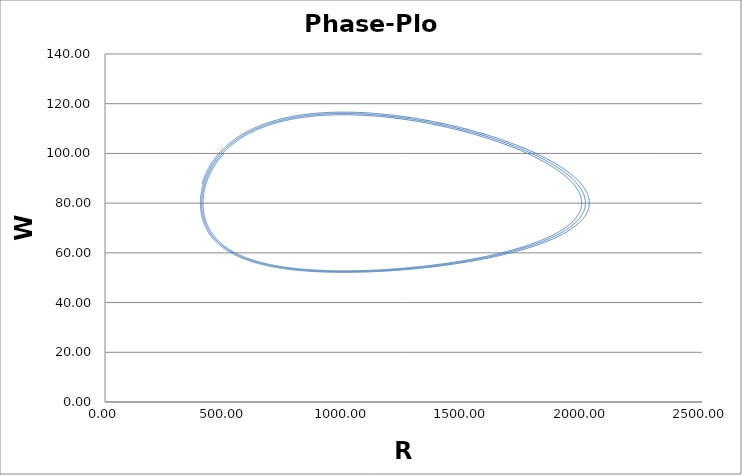
| Category | W |
|---|---|
| 500.0 | 100 |
| 498.9999999992 | 99.9 |
| 498.0069899984048 | 99.8 |
| 497.02094112752405 | 99.7 |
| 496.0418246593139 | 99.599 |
| 495.0696120096582 | 99.499 |
| 494.1042747378336 | 99.399 |
| 493.14578454675745 | 99.298 |
| 492.19411328322036 | 99.197 |
| 491.24923293810184 | 99.097 |
| 490.3111156465713 | 98.996 |
| 489.3797336882732 | 98.895 |
| 488.4550594874972 | 98.794 |
| 487.5370656133338 | 98.693 |
| 486.62572477981547 | 98.592 |
| 485.7210098460431 | 98.49 |
| 484.82289381629937 | 98.389 |
| 483.9313498401477 | 98.288 |
| 483.0463512125183 | 98.186 |
| 482.16787137378094 | 98.085 |
| 481.2958839098047 | 97.983 |
| 480.43036255200514 | 97.881 |
| 479.5712811773795 | 97.78 |
| 478.71861380852914 | 97.678 |
| 477.8723346136706 | 97.576 |
| 477.0324179066348 | 97.474 |
| 476.19883814685477 | 97.372 |
| 475.3715699393425 | 97.27 |
| 474.5505880346546 | 97.168 |
| 473.7358673288472 | 97.066 |
| 472.9273828634206 | 96.964 |
| 472.1251098252536 | 96.862 |
| 471.32902354652776 | 96.76 |
| 470.5390995046415 | 96.657 |
| 469.7553133221153 | 96.555 |
| 468.9776407664867 | 96.452 |
| 468.2060577501967 | 96.35 |
| 467.4405403304669 | 96.248 |
| 466.6810647091678 | 96.145 |
| 465.9276072326787 | 96.042 |
| 465.180144391739 | 95.94 |
| 464.43865282129127 | 95.837 |
| 463.70310930031644 | 95.735 |
| 462.97349075166125 | 95.632 |
| 462.2497742418577 | 95.529 |
| 461.5319369809353 | 95.426 |
| 460.81995632222583 | 95.324 |
| 460.1138097621613 | 95.221 |
| 459.4134749400645 | 95.118 |
| 458.71892963793323 | 95.015 |
| 458.0301517802177 | 94.912 |
| 457.3471194335914 | 94.81 |
| 456.6698108067159 | 94.707 |
| 455.9982042499992 | 94.604 |
| 455.33227825534885 | 94.501 |
| 454.67201145591815 | 94.398 |
| 454.0173826258477 | 94.295 |
| 453.36837068000085 | 94.192 |
| 452.7249546736942 | 94.089 |
| 452.08711380242244 | 93.986 |
| 451.45482740157854 | 93.883 |
| 450.8280749461688 | 93.78 |
| 450.206836050523 | 93.677 |
| 449.59109046800046 | 93.574 |
| 448.9808180906907 | 93.471 |
| 448.37599894911057 | 93.368 |
| 447.7766132118965 | 93.265 |
| 447.18264118549314 | 93.162 |
| 446.5940633138375 | 93.059 |
| 446.01086017803976 | 92.956 |
| 445.4330124960597 | 92.853 |
| 444.86050112238 | 92.75 |
| 444.293307047676 | 92.647 |
| 443.7314113984817 | 92.544 |
| 443.17479543685283 | 92.441 |
| 442.62344056002655 | 92.338 |
| 442.07732830007825 | 92.235 |
| 441.5364403235752 | 92.132 |
| 441.00075843122767 | 92.029 |
| 440.4702645575367 | 91.926 |
| 439.9449407704401 | 91.824 |
| 439.4247692709551 | 91.721 |
| 438.90973239281914 | 91.618 |
| 438.3998126021279 | 91.515 |
| 437.8949924969714 | 91.412 |
| 437.3952548070677 | 91.31 |
| 436.9005823933949 | 91.207 |
| 436.4109582478207 | 91.104 |
| 435.9263654927303 | 91.001 |
| 435.44678738065284 | 90.899 |
| 434.9722072938854 | 90.796 |
| 434.5026087441161 | 90.693 |
| 434.03797537204537 | 90.591 |
| 433.5782909470055 | 90.488 |
| 433.12353936657934 | 90.386 |
| 432.67370465621735 | 90.283 |
| 432.22877096885355 | 90.181 |
| 431.78872258452014 | 90.079 |
| 431.35354390996145 | 89.976 |
| 430.92321947824644 | 89.874 |
| 430.4977339483805 | 89.772 |
| 430.0770721049166 | 89.669 |
| 429.6612188575651 | 89.567 |
| 429.25015924080327 | 89.465 |
| 428.8438784134842 | 89.363 |
| 428.4423616584448 | 89.261 |
| 428.0455943821134 | 89.159 |
| 427.65356211411716 | 89.057 |
| 427.2662505068885 | 88.955 |
| 426.8836453352719 | 88.853 |
| 426.5057324961297 | 88.751 |
| 426.1324980079483 | 88.649 |
| 425.7639280104435 | 88.547 |
| 425.40000876416667 | 88.446 |
| 425.04072665010983 | 88.344 |
| 424.6860681693114 | 88.243 |
| 424.33601994246175 | 88.141 |
| 423.99056870950886 | 88.04 |
| 423.6497013292643 | 87.938 |
| 423.3134047790089 | 87.837 |
| 422.9816661540993 | 87.735 |
| 422.6544726675743 | 87.634 |
| 422.33181164976173 | 87.533 |
| 422.0136705478859 | 87.432 |
| 421.70003692567485 | 87.331 |
| 421.3908984629687 | 87.23 |
| 421.08624295532826 | 87.129 |
| 420.786058313644 | 87.028 |
| 420.49033256374594 | 86.927 |
| 420.19905384601384 | 86.826 |
| 419.91221041498835 | 86.726 |
| 419.62979063898257 | 86.625 |
| 419.3517829996944 | 86.525 |
| 419.07817609181996 | 86.424 |
| 418.80895862266726 | 86.324 |
| 418.54411941177125 | 86.223 |
| 418.2836473905094 | 86.123 |
| 418.0275316017181 | 86.023 |
| 417.7757611993106 | 85.923 |
| 417.5283254478949 | 85.823 |
| 417.2852137223936 | 85.723 |
| 417.0464155076643 | 85.623 |
| 416.8119203981207 | 85.523 |
| 416.58171809735586 | 85.423 |
| 416.3557984177653 | 85.324 |
| 416.134151280172 | 85.224 |
| 415.91676671345226 | 85.124 |
| 415.70363485416306 | 85.025 |
| 415.49474594617004 | 84.926 |
| 415.29009034027723 | 84.826 |
| 415.08965849385777 | 84.727 |
| 414.89344097048604 | 84.628 |
| 414.7014284395708 | 84.529 |
| 414.51361167599 | 84.43 |
| 414.3299815597266 | 84.331 |
| 414.15052907550603 | 84.232 |
| 413.97524531243477 | 84.134 |
| 413.80412146364034 | 84.035 |
| 413.6371488259129 | 83.937 |
| 413.47431879934805 | 83.838 |
| 413.3156228869911 | 83.74 |
| 413.1610526944828 | 83.642 |
| 413.0105999297068 | 83.543 |
| 412.86425640243806 | 83.445 |
| 412.72201402399315 | 83.347 |
| 412.58386480688205 | 83.249 |
| 412.4498008644612 | 83.152 |
| 412.3198144105885 | 83.054 |
| 412.1938977592793 | 82.956 |
| 412.0720433243647 | 82.859 |
| 411.9542436191505 | 82.761 |
| 411.8404912560785 | 82.664 |
| 411.73077894638925 | 82.567 |
| 411.6250994997859 | 82.47 |
| 411.5234458241003 | 82.373 |
| 411.42581092496033 | 82.276 |
| 411.33218790545897 | 82.179 |
| 411.24256996582506 | 82.082 |
| 411.1569504030956 | 81.985 |
| 411.0753226107899 | 81.889 |
| 410.997680078585 | 81.792 |
| 410.92401639199323 | 81.696 |
| 410.8543252320411 | 81.6 |
| 410.78860037495 | 81.504 |
| 410.7268356918186 | 81.408 |
| 410.66902514830696 | 81.312 |
| 410.61516280432204 | 81.216 |
| 410.5652428137055 | 81.12 |
| 410.5192594239225 | 81.024 |
| 410.47720697575284 | 80.929 |
| 410.4390799029834 | 80.833 |
| 410.4048727321023 | 80.738 |
| 410.37458008199525 | 80.643 |
| 410.3481966636428 | 80.548 |
| 410.3257172798201 | 80.453 |
| 410.30713682479785 | 80.358 |
| 410.29245028404546 | 80.263 |
| 410.28165273393523 | 80.169 |
| 410.274739341449 | 80.074 |
| 410.271705363886 | 79.98 |
| 410.2725461485727 | 79.885 |
| 410.2772571325744 | 79.791 |
| 410.2858338424082 | 79.697 |
| 410.2982718937581 | 79.603 |
| 410.3145669911918 | 79.509 |
| 410.3347149278787 | 79.415 |
| 410.35871158531035 | 79.322 |
| 410.38655293302213 | 79.228 |
| 410.41823502831676 | 79.135 |
| 410.45375401598966 | 79.041 |
| 410.49310612805584 | 78.948 |
| 410.5362876834786 | 78.855 |
| 410.58329508789984 | 78.762 |
| 410.63412483337225 | 78.669 |
| 410.6887734980931 | 78.576 |
| 410.74723774613955 | 78.484 |
| 410.809514327206 | 78.391 |
| 410.8756000763429 | 78.299 |
| 410.9454919136972 | 78.207 |
| 411.01918684425476 | 78.115 |
| 411.09668195758405 | 78.023 |
| 411.17797442758183 | 77.931 |
| 411.26306151222036 | 77.839 |
| 411.35194055329623 | 77.747 |
| 411.44460897618103 | 77.656 |
| 411.5410642895734 | 77.564 |
| 411.64130408525295 | 77.473 |
| 411.7453260378357 | 77.382 |
| 411.8531279045312 | 77.291 |
| 411.96470752490126 | 77.2 |
| 412.0800628206202 | 77.109 |
| 412.19919179523686 | 77.018 |
| 412.3220925339382 | 76.928 |
| 412.44876320331434 | 76.837 |
| 412.5792020511254 | 76.747 |
| 412.7134074060696 | 76.657 |
| 412.8513776775535 | 76.567 |
| 412.9931113554631 | 76.477 |
| 413.13860700993706 | 76.387 |
| 413.28786329114115 | 76.298 |
| 413.4408789290444 | 76.208 |
| 413.5976527331967 | 76.119 |
| 413.7581835925079 | 76.029 |
| 413.9224704750286 | 75.94 |
| 414.09051242773216 | 75.851 |
| 414.26230857629844 | 75.762 |
| 414.437858124899 | 75.674 |
| 414.61716035598363 | 75.585 |
| 414.8002146300685 | 75.496 |
| 414.98702038552574 | 75.408 |
| 415.1775771383742 | 75.32 |
| 415.3718844820723 | 75.232 |
| 415.5699420873115 | 75.144 |
| 415.77174970181187 | 75.056 |
| 415.9773071501186 | 74.968 |
| 416.18661433340003 | 74.881 |
| 416.3996712292474 | 74.793 |
| 416.6164778914754 | 74.706 |
| 416.8370344499246 | 74.619 |
| 417.0613411102648 | 74.532 |
| 417.2893981538 | 74.445 |
| 417.5212059372748 | 74.358 |
| 417.7567648926817 | 74.272 |
| 417.99607552707016 | 74.185 |
| 418.2391384223566 | 74.099 |
| 418.48595423513586 | 74.012 |
| 418.7365236964941 | 73.926 |
| 418.99084761182246 | 73.84 |
| 419.2489268606325 | 73.755 |
| 419.5107623963725 | 73.669 |
| 419.7763552462454 | 73.583 |
| 420.04570651102716 | 73.498 |
| 420.3188173648875 | 73.413 |
| 420.5956890552105 | 73.328 |
| 420.87632290241777 | 73.243 |
| 421.1607202997912 | 73.158 |
| 421.4488827132984 | 73.073 |
| 421.7408116814182 | 72.989 |
| 422.0365088149678 | 72.904 |
| 422.33597579693077 | 72.82 |
| 422.6392143822862 | 72.736 |
| 422.9462263978391 | 72.652 |
| 423.25701374205164 | 72.568 |
| 423.5715783848756 | 72.484 |
| 423.88992236758554 | 72.401 |
| 424.21204780261365 | 72.317 |
| 424.5379568733848 | 72.234 |
| 424.8676518341532 | 72.151 |
| 425.20113500983973 | 72.068 |
| 425.53840879587034 | 71.985 |
| 425.8794756580154 | 71.902 |
| 426.2243381322299 | 71.82 |
| 426.5729988244946 | 71.737 |
| 426.9254604106584 | 71.655 |
| 427.2817256362809 | 71.573 |
| 427.64179731647647 | 71.491 |
| 428.00567833575906 | 71.409 |
| 428.3733716478875 | 71.327 |
| 428.74488027571203 | 71.246 |
| 429.12020731102155 | 71.165 |
| 429.4993559143914 | 71.083 |
| 429.88232931503234 | 71.002 |
| 430.26913081064 | 70.921 |
| 430.65976376724507 | 70.84 |
| 431.0542316190645 | 70.76 |
| 431.4525378683531 | 70.679 |
| 431.85468608525593 | 70.599 |
| 432.2606799076615 | 70.519 |
| 432.6705230410555 | 70.439 |
| 433.08421925837524 | 70.359 |
| 433.5017723998647 | 70.279 |
| 433.9231863729302 | 70.199 |
| 434.34846515199666 | 70.12 |
| 434.7776127783644 | 70.04 |
| 435.21063336006665 | 69.961 |
| 435.6475310717274 | 69.882 |
| 436.08831015442007 | 69.803 |
| 436.53297491552615 | 69.725 |
| 436.9815297285951 | 69.646 |
| 437.43397903320397 | 69.568 |
| 437.8903273348181 | 69.489 |
| 438.35057920465175 | 69.411 |
| 438.8147392795294 | 69.333 |
| 439.28281226174767 | 69.255 |
| 439.754802918937 | 69.178 |
| 440.23071608392434 | 69.1 |
| 440.71055665459585 | 69.023 |
| 441.19432959375996 | 68.946 |
| 441.6820399290108 | 68.869 |
| 442.1736927525918 | 68.792 |
| 442.6692932212599 | 68.715 |
| 443.1688465561495 | 68.638 |
| 443.6723580426369 | 68.562 |
| 444.17983303020515 | 68.486 |
| 444.6912769323087 | 68.41 |
| 445.2066952262385 | 68.334 |
| 445.726093452987 | 68.258 |
| 446.2494772171138 | 68.182 |
| 446.7768521866106 | 68.107 |
| 447.30822409276703 | 68.031 |
| 447.843598730036 | 67.956 |
| 448.38298195589937 | 67.881 |
| 448.9263796907337 | 67.806 |
| 449.4737979176757 | 67.731 |
| 450.02524268248794 | 67.657 |
| 450.58072009342436 | 67.582 |
| 451.1402363210959 | 67.508 |
| 451.70379759833605 | 67.434 |
| 452.2714102200659 | 67.36 |
| 452.84308054315954 | 67.286 |
| 453.4188149863092 | 67.213 |
| 453.99862002989005 | 67.139 |
| 454.58250221582495 | 67.066 |
| 455.17046814744907 | 66.993 |
| 455.762524489374 | 66.92 |
| 456.358677967352 | 66.847 |
| 456.9589353681394 | 66.774 |
| 457.56330353936045 | 66.702 |
| 458.1717893893701 | 66.629 |
| 458.78439988711693 | 66.557 |
| 459.4011420620056 | 66.485 |
| 460.0220230037587 | 66.413 |
| 460.6470498622785 | 66.341 |
| 461.27622984750786 | 66.27 |
| 461.9095702292912 | 66.198 |
| 462.5470783372343 | 66.127 |
| 463.1887615605644 | 66.056 |
| 463.8346273479889 | 65.985 |
| 464.4846832075542 | 65.914 |
| 465.13893670650367 | 65.844 |
| 465.79739547113473 | 65.773 |
| 466.4600671866558 | 65.703 |
| 467.12695959704234 | 65.633 |
| 467.7980805048921 | 65.563 |
| 468.4734377712797 | 65.493 |
| 469.1530393156107 | 65.424 |
| 469.83689311547477 | 65.354 |
| 470.52500720649755 | 65.285 |
| 471.2173896821928 | 65.216 |
| 471.9140486938125 | 65.147 |
| 472.614992450197 | 65.078 |
| 473.3202292176237 | 65.009 |
| 474.02976731965515 | 64.941 |
| 474.7436151369858 | 64.873 |
| 475.4617811072882 | 64.804 |
| 476.18427372505795 | 64.736 |
| 476.9111015414577 | 64.669 |
| 477.6422731641599 | 64.601 |
| 478.37779725718866 | 64.533 |
| 479.1176825407604 | 64.466 |
| 479.86193779112347 | 64.399 |
| 480.6105718403962 | 64.332 |
| 481.36359357640424 | 64.265 |
| 482.1210119425165 | 64.198 |
| 482.8828359374794 | 64.132 |
| 483.6490746152506 | 64.066 |
| 484.4197370848306 | 64 |
| 485.1948325100936 | 63.934 |
| 485.97437010961653 | 63.868 |
| 486.758359156507 | 63.802 |
| 487.5468089782296 | 63.737 |
| 488.33972895643063 | 63.671 |
| 489.13712852676167 | 63.606 |
| 489.9390171787012 | 63.541 |
| 490.7454044553748 | 63.476 |
| 491.55629995337404 | 63.412 |
| 492.3717133225731 | 63.347 |
| 493.19165426594424 | 63.283 |
| 494.0161325393714 | 63.219 |
| 494.84515795146217 | 63.155 |
| 495.6787403633574 | 63.091 |
| 496.5168896885401 | 63.027 |
| 497.35961589264144 | 62.964 |
| 498.20692899324547 | 62.9 |
| 499.05883905969176 | 62.837 |
| 499.91535621287613 | 62.774 |
| 500.7764906250494 | 62.712 |
| 501.6422525196141 | 62.649 |
| 502.5126521709191 | 62.587 |
| 503.38769990405245 | 62.524 |
| 504.26740609463155 | 62.462 |
| 505.15178116859175 | 62.4 |
| 506.0408356019724 | 62.338 |
| 506.93457992070074 | 62.277 |
| 507.8330247003738 | 62.215 |
| 508.73618056603755 | 62.154 |
| 509.644058191964 | 62.093 |
| 510.556668301426 | 62.032 |
| 511.47402166646935 | 61.972 |
| 512.3961291076828 | 61.911 |
| 513.3230014939652 | 61.851 |
| 514.2546497422907 | 61.79 |
| 515.1910848174705 | 61.73 |
| 516.1323177319128 | 61.671 |
| 517.0783595453802 | 61.611 |
| 518.0292213647431 | 61.551 |
| 518.9849143437325 | 61.492 |
| 519.9454496826879 | 61.433 |
| 520.9108386283042 | 61.374 |
| 521.8810924733743 | 61.315 |
| 522.85622255653 | 61.256 |
| 523.836240261979 | 61.198 |
| 524.8211570192399 | 61.14 |
| 525.8109843028732 | 61.082 |
| 526.8057336322101 | 61.024 |
| 527.8054165710781 | 60.966 |
| 528.8100447275226 | 60.908 |
| 529.8196297535264 | 60.851 |
| 530.8341833447258 | 60.794 |
| 531.8537172401227 | 60.737 |
| 532.8782432217943 | 60.68 |
| 533.9077731145987 | 60.623 |
| 534.9423187858782 | 60.567 |
| 535.9818921451578 | 60.51 |
| 537.026505143841 | 60.454 |
| 538.076169774902 | 60.398 |
| 539.1308980725748 | 60.342 |
| 540.1907021120375 | 60.287 |
| 541.2555940090936 | 60.231 |
| 542.3255859198504 | 60.176 |
| 543.4006900403921 | 60.121 |
| 544.4809186064502 | 60.066 |
| 545.5662838930698 | 60.011 |
| 546.6567982142717 | 59.957 |
| 547.752473922711 | 59.902 |
| 548.8533234093314 | 59.848 |
| 549.9593591030157 | 59.794 |
| 551.0705934702318 | 59.74 |
| 552.1870390146752 | 59.687 |
| 553.3087082769067 | 59.633 |
| 554.4356138339863 | 59.58 |
| 555.5677682991025 | 59.527 |
| 556.7051843211974 | 59.474 |
| 557.8478745845878 | 59.421 |
| 558.9958518085808 | 59.369 |
| 560.1491287470861 | 59.316 |
| 561.3077181882232 | 59.264 |
| 562.4716329539239 | 59.212 |
| 563.6408858995301 | 59.16 |
| 564.8154899133878 | 59.109 |
| 565.9954579164349 | 59.057 |
| 567.1808028617857 | 59.006 |
| 568.3715377343087 | 58.955 |
| 569.5676755502019 | 58.904 |
| 570.7692293565608 | 58.853 |
| 571.9762122309427 | 58.803 |
| 573.1886372809257 | 58.753 |
| 574.4065176436625 | 58.702 |
| 575.6298664854287 | 58.652 |
| 576.8586970011663 | 58.603 |
| 578.0930224140218 | 58.553 |
| 579.3328559748785 | 58.504 |
| 580.5782109618843 | 58.454 |
| 581.8291006799731 | 58.405 |
| 583.0855384603808 | 58.357 |
| 584.3475376601566 | 58.308 |
| 585.6151116616672 | 58.259 |
| 586.8882738720968 | 58.211 |
| 588.1670377229399 | 58.163 |
| 589.4514166694895 | 58.115 |
| 590.7414241903185 | 58.067 |
| 592.0370737867559 | 58.02 |
| 593.338378982356 | 57.973 |
| 594.6453533223627 | 57.925 |
| 595.9580103731669 | 57.878 |
| 597.2763637217577 | 57.832 |
| 598.6004269751677 | 57.785 |
| 599.9302137599117 | 57.739 |
| 601.2657377214192 | 57.692 |
| 602.6070125234602 | 57.646 |
| 603.9540518475648 | 57.601 |
| 605.3068693924357 | 57.555 |
| 606.665478873355 | 57.51 |
| 608.0298940215831 | 57.464 |
| 609.4001285837517 | 57.419 |
| 610.7761963212495 | 57.374 |
| 612.1581110096014 | 57.33 |
| 613.5458864378403 | 57.285 |
| 614.939536407872 | 57.241 |
| 616.339074733833 | 57.197 |
| 617.7445152414413 | 57.153 |
| 619.1558717673396 | 57.109 |
| 620.5731581584317 | 57.066 |
| 621.9963882712108 | 57.023 |
| 623.4255759710807 | 56.979 |
| 624.8607351316699 | 56.937 |
| 626.3018796341377 | 56.894 |
| 627.749023366472 | 56.851 |
| 629.2021802227808 | 56.809 |
| 630.6613641025747 | 56.767 |
| 632.1265889100417 | 56.725 |
| 633.5978685533152 | 56.683 |
| 635.0752169437316 | 56.642 |
| 636.5586479950827 | 56.6 |
| 638.0481756228575 | 56.559 |
| 639.5438137434771 | 56.518 |
| 641.0455762735213 | 56.477 |
| 642.5534771289455 | 56.437 |
| 644.067530224291 | 56.397 |
| 645.5877494718852 | 56.356 |
| 647.1141487810343 | 56.316 |
| 648.6467420572063 | 56.277 |
| 650.1855432012063 | 56.237 |
| 651.730566108342 | 56.198 |
| 653.281824667581 | 56.159 |
| 654.8393327606984 | 56.12 |
| 656.4031042614164 | 56.081 |
| 657.9731530345333 | 56.042 |
| 659.5494929350446 | 56.004 |
| 661.1321378072539 | 55.966 |
| 662.7211014838751 | 55.928 |
| 664.3163977851245 | 55.89 |
| 665.9180405178037 | 55.853 |
| 667.5260434743728 | 55.816 |
| 669.1404204320143 | 55.778 |
| 670.7611851516862 | 55.741 |
| 672.3883513771663 | 55.705 |
| 674.0219328340861 | 55.668 |
| 675.6619432289546 | 55.632 |
| 677.3083962481719 | 55.596 |
| 678.9613055570334 | 55.56 |
| 680.6206847987223 | 55.524 |
| 682.2865475932934 | 55.489 |
| 683.9589075366451 | 55.454 |
| 685.6377781994815 | 55.419 |
| 687.3231731262641 | 55.384 |
| 689.0151058341522 | 55.349 |
| 690.713589811933 | 55.315 |
| 692.4186385189408 | 55.28 |
| 694.130265383965 | 55.246 |
| 695.8484838041472 | 55.213 |
| 697.5733071438676 | 55.179 |
| 699.3047487336195 | 55.146 |
| 701.0428218688729 | 55.113 |
| 702.787539808927 | 55.08 |
| 704.5389157757505 | 55.047 |
| 706.2969629528112 | 55.014 |
| 708.0616944838933 | 54.982 |
| 709.8331234719038 | 54.95 |
| 711.6112629776659 | 54.918 |
| 713.3961260187017 | 54.886 |
| 715.1877255680024 | 54.855 |
| 716.9860745527864 | 54.824 |
| 718.7911858532452 | 54.793 |
| 720.6030723012778 | 54.762 |
| 722.4217466792114 | 54.731 |
| 724.2472217185112 | 54.701 |
| 726.0795100984766 | 54.671 |
| 727.9186244449253 | 54.641 |
| 729.7645773288648 | 54.611 |
| 731.617381265151 | 54.581 |
| 733.477048711134 | 54.552 |
| 735.3435920652904 | 54.523 |
| 737.217023665844 | 54.494 |
| 739.0973557893716 | 54.466 |
| 740.9846006493973 | 54.437 |
| 742.878770394972 | 54.409 |
| 744.7798771092407 | 54.381 |
| 746.6879328079958 | 54.353 |
| 748.6029494382167 | 54.326 |
| 750.524938876596 | 54.298 |
| 752.4539129280523 | 54.271 |
| 754.3898833242283 | 54.244 |
| 756.332861721976 | 54.218 |
| 758.2828597018267 | 54.191 |
| 760.2398887664485 | 54.165 |
| 762.2039603390882 | 54.139 |
| 764.1750857619995 | 54.113 |
| 766.153276294857 | 54.088 |
| 768.1385431131556 | 54.063 |
| 770.130897306595 | 54.037 |
| 772.1303498774503 | 54.013 |
| 774.1369117389274 | 53.988 |
| 776.1505937135041 | 53.964 |
| 778.1714065312552 | 53.939 |
| 780.1993608281641 | 53.916 |
| 782.2344671444182 | 53.892 |
| 784.2767359226897 | 53.868 |
| 786.3261775064012 | 53.845 |
| 788.382802137976 | 53.822 |
| 790.4466199570721 | 53.799 |
| 792.5176409988023 | 53.777 |
| 794.5958751919375 | 53.754 |
| 796.6813323570946 | 53.732 |
| 798.774022204909 | 53.711 |
| 800.8739543341911 | 53.689 |
| 802.9811382300667 | 53.668 |
| 805.0955832621014 | 53.646 |
| 807.2172986824094 | 53.626 |
| 809.3462936237454 | 53.605 |
| 811.482577097581 | 53.584 |
| 813.6261579921644 | 53.564 |
| 815.7770450705632 | 53.544 |
| 817.9352469686919 | 53.524 |
| 820.1007721933219 | 53.505 |
| 822.2736291200747 | 53.486 |
| 824.4538259913994 | 53.467 |
| 826.6413709145324 | 53.448 |
| 828.8362718594406 | 53.429 |
| 831.0385366567474 | 53.411 |
| 833.2481729956423 | 53.393 |
| 835.4651884217727 | 53.375 |
| 837.6895903351187 | 53.358 |
| 839.9213859878507 | 53.34 |
| 842.1605824821697 | 53.323 |
| 844.40718676813 | 53.306 |
| 846.6612056414448 | 53.29 |
| 848.9226457412734 | 53.274 |
| 851.1915135479921 | 53.257 |
| 853.4678153809461 | 53.242 |
| 855.7515573961845 | 53.226 |
| 858.0427455841766 | 53.211 |
| 860.3413857675116 | 53.196 |
| 862.647483598579 | 53.181 |
| 864.9610445572318 | 53.166 |
| 867.2820739484313 | 53.152 |
| 869.6105768998735 | 53.138 |
| 871.9465583595984 | 53.124 |
| 874.2900230935791 | 53.11 |
| 876.6409756832944 | 53.097 |
| 878.9994205232821 | 53.084 |
| 881.3653618186739 | 53.071 |
| 883.738803582712 | 53.058 |
| 886.1197496342469 | 53.046 |
| 888.5082035952171 | 53.034 |
| 890.9041688881094 | 53.022 |
| 893.3076487334012 | 53.01 |
| 895.718646146983 | 52.999 |
| 898.137163937564 | 52.988 |
| 900.5632047040566 | 52.977 |
| 902.9967708329436 | 52.967 |
| 905.437864495626 | 52.956 |
| 907.886487645751 | 52.946 |
| 910.3426420165231 | 52.937 |
| 912.8063291179935 | 52.927 |
| 915.2775502343326 | 52.918 |
| 917.7563064210821 | 52.909 |
| 920.2425985023887 | 52.9 |
| 922.736427068218 | 52.892 |
| 925.2377924715496 | 52.884 |
| 927.7466948255533 | 52.876 |
| 930.2631340007451 | 52.868 |
| 932.787109622125 | 52.861 |
| 935.3186210662943 | 52.854 |
| 937.8576674585555 | 52.847 |
| 940.4042476699906 | 52.84 |
| 942.9583603145219 | 52.834 |
| 945.5200037459524 | 52.828 |
| 948.0891760549875 | 52.822 |
| 950.6658750662372 | 52.817 |
| 953.2500983351983 | 52.811 |
| 955.8418431452187 | 52.807 |
| 958.4411065044409 | 52.802 |
| 961.0478851427268 | 52.798 |
| 963.6621755085639 | 52.793 |
| 966.2839737659503 | 52.79 |
| 968.9132757912627 | 52.786 |
| 971.5500771701032 | 52.783 |
| 974.1943731941285 | 52.78 |
| 976.8461588578583 | 52.777 |
| 979.5054288554657 | 52.775 |
| 982.1721775775477 | 52.772 |
| 984.8463991078773 | 52.77 |
| 987.528087220136 | 52.769 |
| 990.2172353746267 | 52.768 |
| 992.9138367149693 | 52.767 |
| 995.6178840647752 | 52.766 |
| 998.329369924305 | 52.765 |
| 1001.0482864671051 | 52.765 |
| 1003.7746255366279 | 52.765 |
| 1006.5083786428315 | 52.766 |
| 1009.2495369587613 | 52.766 |
| 1011.9980913171129 | 52.767 |
| 1014.7540322067771 | 52.769 |
| 1017.5173497693655 | 52.77 |
| 1020.2880337957183 | 52.772 |
| 1023.0660737223936 | 52.774 |
| 1025.851458628139 | 52.777 |
| 1028.644177230344 | 52.779 |
| 1031.4442178814757 | 52.782 |
| 1034.251568565496 | 52.786 |
| 1037.0662168942608 | 52.789 |
| 1039.8881501039018 | 52.793 |
| 1042.717355051191 | 52.797 |
| 1045.5538182098867 | 52.802 |
| 1048.3975256670642 | 52.807 |
| 1051.2484631194268 | 52.812 |
| 1054.1066158696017 | 52.817 |
| 1056.9719688224186 | 52.823 |
| 1059.8445064811706 | 52.829 |
| 1062.7242129438596 | 52.835 |
| 1065.6110718994246 | 52.842 |
| 1068.5050666239545 | 52.849 |
| 1071.4061799768835 | 52.856 |
| 1074.3143943971718 | 52.864 |
| 1077.2296918994696 | 52.872 |
| 1080.1520540702666 | 52.88 |
| 1083.0814620640247 | 52.888 |
| 1086.0178965992968 | 52.897 |
| 1088.96133795483 | 52.906 |
| 1091.911765965654 | 52.915 |
| 1094.8691600191546 | 52.925 |
| 1097.8334990511341 | 52.935 |
| 1100.8047615418561 | 52.946 |
| 1103.7829255120773 | 52.956 |
| 1106.7679685190656 | 52.967 |
| 1109.7598676526043 | 52.979 |
| 1112.7585995309835 | 52.99 |
| 1115.7641402969784 | 53.002 |
| 1118.776465613816 | 53.014 |
| 1121.7955506611277 | 53.027 |
| 1124.8213701308905 | 53.04 |
| 1127.8538982233576 | 53.053 |
| 1130.8931086429761 | 53.067 |
| 1133.9389745942938 | 53.081 |
| 1136.9914687778553 | 53.095 |
| 1140.0505633860878 | 53.109 |
| 1143.1162300991764 | 53.124 |
| 1146.1884400809295 | 53.139 |
| 1149.267163974634 | 53.155 |
| 1152.352371898903 | 53.171 |
| 1155.4440334435121 | 53.187 |
| 1158.5421176652305 | 53.204 |
| 1161.646593083641 | 53.22 |
| 1164.7574276769533 | 53.238 |
| 1167.8745888778108 | 53.255 |
| 1170.998043569089 | 53.273 |
| 1174.1277580796886 | 53.291 |
| 1177.2636981803216 | 53.31 |
| 1180.4058290792923 | 53.329 |
| 1183.5541154182727 | 53.348 |
| 1186.7085212680724 | 53.368 |
| 1189.8690101244065 | 53.388 |
| 1193.035544903656 | 53.408 |
| 1196.208087938628 | 53.428 |
| 1199.3866009743112 | 53.449 |
| 1202.5710451636292 | 53.471 |
| 1205.7613810631917 | 53.492 |
| 1208.9575686290455 | 53.514 |
| 1212.1595672124217 | 53.537 |
| 1215.3673355554863 | 53.559 |
| 1218.5808317870872 | 53.583 |
| 1221.800013418504 | 53.606 |
| 1225.0248373391992 | 53.63 |
| 1228.2552598125694 | 53.654 |
| 1231.4912364717006 | 53.678 |
| 1234.7327223151258 | 53.703 |
| 1237.9796717025856 | 53.728 |
| 1241.2320383507943 | 53.754 |
| 1244.4897753292087 | 53.78 |
| 1247.752835055805 | 53.806 |
| 1251.0211692928592 | 53.833 |
| 1254.2947291427358 | 53.86 |
| 1257.5734650436834 | 53.887 |
| 1260.857326765638 | 53.915 |
| 1264.1462634060351 | 53.943 |
| 1267.4402233856329 | 53.972 |
| 1270.7391544443424 | 54.001 |
| 1274.043003637071 | 54.03 |
| 1277.3517173295772 | 54.059 |
| 1280.6652411943369 | 54.089 |
| 1283.9835202064228 | 54.12 |
| 1287.3064986393993 | 54.151 |
| 1290.6341200612294 | 54.182 |
| 1293.9663273301999 | 54.213 |
| 1297.30306259086 | 54.245 |
| 1300.64426726998 | 54.277 |
| 1303.9898820725248 | 54.31 |
| 1307.3398469776487 | 54.343 |
| 1310.6941012347081 | 54.376 |
| 1314.0525833592962 | 54.41 |
| 1317.4152311292976 | 54.444 |
| 1320.7819815809655 | 54.479 |
| 1324.1527710050227 | 54.514 |
| 1327.5275349427866 | 54.549 |
| 1330.9062081823179 | 54.585 |
| 1334.2887247545973 | 54.621 |
| 1337.6750179297276 | 54.658 |
| 1341.0650202131637 | 54.694 |
| 1344.4586633419729 | 54.732 |
| 1347.855878281123 | 54.769 |
| 1351.2565952198033 | 54.808 |
| 1354.6607435677759 | 54.846 |
| 1358.0682519517607 | 54.885 |
| 1361.4790482118547 | 54.924 |
| 1364.8930593979856 | 54.964 |
| 1368.3102117664018 | 55.004 |
| 1371.7304307762004 | 55.045 |
| 1375.1536410858916 | 55.086 |
| 1378.5797665500056 | 55.127 |
| 1382.0087302157367 | 55.169 |
| 1385.4404543196317 | 55.211 |
| 1388.8748602843198 | 55.253 |
| 1392.3118687152871 | 55.296 |
| 1395.751399397697 | 55.34 |
| 1399.193371293255 | 55.383 |
| 1402.6377025371237 | 55.428 |
| 1406.084310434885 | 55.472 |
| 1409.533111459553 | 55.517 |
| 1412.9840212486386 | 55.563 |
| 1416.4369546012656 | 55.609 |
| 1419.891825475343 | 55.655 |
| 1423.3485469847897 | 55.702 |
| 1426.807031396818 | 55.749 |
| 1430.2671901292745 | 55.797 |
| 1433.7289337480386 | 55.845 |
| 1437.1921719644843 | 55.893 |
| 1440.656813633002 | 55.942 |
| 1444.1227667485837 | 55.991 |
| 1447.5899384444735 | 56.041 |
| 1451.0582349898848 | 56.091 |
| 1454.527561787783 | 56.142 |
| 1457.9978233727393 | 56.193 |
| 1461.468923408853 | 56.244 |
| 1464.940764687748 | 56.296 |
| 1468.4132491266398 | 56.348 |
| 1471.8862777664792 | 56.401 |
| 1475.3597507701722 | 56.454 |
| 1478.8335674208763 | 56.508 |
| 1482.307626120378 | 56.562 |
| 1485.781824387549 | 56.617 |
| 1489.2560588568872 | 56.672 |
| 1492.7302252771392 | 56.727 |
| 1496.20421851001 | 56.783 |
| 1499.6779325289588 | 56.84 |
| 1503.151260418084 | 56.896 |
| 1506.6240943710977 | 56.954 |
| 1510.0963256903933 | 57.011 |
| 1513.5678447862051 | 57.069 |
| 1517.0385411758637 | 57.128 |
| 1520.5083034831482 | 57.187 |
| 1523.9770194377368 | 57.247 |
| 1527.4445758747565 | 57.307 |
| 1530.9108587344363 | 57.367 |
| 1534.3757530618616 | 57.428 |
| 1537.8391430068355 | 57.489 |
| 1541.3009118238454 | 57.551 |
| 1544.760941872139 | 57.614 |
| 1548.2191146159103 | 57.676 |
| 1551.675310624597 | 57.74 |
| 1555.1294095732915 | 57.803 |
| 1558.5812902432683 | 57.867 |
| 1562.0308305226272 | 57.932 |
| 1565.4779074070552 | 57.997 |
| 1568.9223970007104 | 58.063 |
| 1572.3641745172265 | 58.129 |
| 1575.803114280843 | 58.195 |
| 1579.2390897276593 | 58.262 |
| 1582.6719734070189 | 58.33 |
| 1586.10163698302 | 58.398 |
| 1589.5279512361599 | 58.466 |
| 1592.9507860651106 | 58.535 |
| 1596.3700104886304 | 58.605 |
| 1599.7854926476107 | 58.675 |
| 1603.1970998072622 | 58.745 |
| 1606.6046983594404 | 58.816 |
| 1610.0081538251136 | 58.887 |
| 1613.4073308569739 | 58.959 |
| 1616.8020932421944 | 59.031 |
| 1620.1923039053327 | 59.104 |
| 1623.5778249113846 | 59.178 |
| 1626.9585174689873 | 59.251 |
| 1630.3342419337766 | 59.326 |
| 1633.7048578118968 | 59.4 |
| 1637.0702237636685 | 59.476 |
| 1640.430197607413 | 59.551 |
| 1643.784636323437 | 59.628 |
| 1647.1333960581792 | 59.705 |
| 1650.4763321285182 | 59.782 |
| 1653.8132990262482 | 59.86 |
| 1657.1441504227187 | 59.938 |
| 1660.4687391736447 | 60.017 |
| 1663.786917324086 | 60.096 |
| 1667.098536113598 | 60.176 |
| 1670.4034459815568 | 60.256 |
| 1673.7014965726603 | 60.337 |
| 1676.992536742604 | 60.418 |
| 1680.2764145639378 | 60.5 |
| 1683.5529773321016 | 60.582 |
| 1686.8220715716432 | 60.665 |
| 1690.08354304262 | 60.748 |
| 1693.3372367471857 | 60.832 |
| 1696.5829969363635 | 60.917 |
| 1699.820667117008 | 61.001 |
| 1703.0500900589568 | 61.087 |
| 1706.2711078023735 | 61.173 |
| 1709.4835616652838 | 61.259 |
| 1712.6872922513062 | 61.346 |
| 1715.8821394575778 | 61.433 |
| 1719.0679424828784 | 61.521 |
| 1722.2445398359534 | 61.61 |
| 1725.411769344036 | 61.699 |
| 1728.5694681615716 | 61.788 |
| 1731.7174727791462 | 61.878 |
| 1734.8556190326165 | 61.969 |
| 1737.9837421124478 | 62.06 |
| 1741.1016765732586 | 62.152 |
| 1744.2092563435717 | 62.244 |
| 1747.3063147357766 | 62.336 |
| 1750.3926844563005 | 62.43 |
| 1753.4681976159923 | 62.523 |
| 1756.5326857407188 | 62.617 |
| 1759.5859797821745 | 62.712 |
| 1762.6279101289067 | 62.808 |
| 1765.658306617556 | 62.903 |
| 1768.6769985443134 | 63 |
| 1771.683814676596 | 63.096 |
| 1774.6785832649402 | 63.194 |
| 1777.6611320551146 | 63.292 |
| 1780.6312883004541 | 63.39 |
| 1783.588878774413 | 63.489 |
| 1786.5337297833414 | 63.589 |
| 1789.4656671794837 | 63.689 |
| 1792.384516374199 | 63.789 |
| 1795.2901023514053 | 63.89 |
| 1798.1822496812488 | 63.992 |
| 1801.0607825339962 | 64.094 |
| 1803.9255246941525 | 64.197 |
| 1806.776299574804 | 64.3 |
| 1809.6129302321863 | 64.404 |
| 1812.4352393804784 | 64.508 |
| 1815.243049406823 | 64.613 |
| 1818.036182386572 | 64.718 |
| 1820.814460098758 | 64.824 |
| 1823.5777040417936 | 64.931 |
| 1826.3257354493949 | 65.038 |
| 1829.058375306731 | 65.145 |
| 1831.7754443668007 | 65.253 |
| 1834.4767631670327 | 65.362 |
| 1837.1621520461126 | 65.471 |
| 1839.8314311610338 | 65.58 |
| 1842.4844205043728 | 65.69 |
| 1845.1209399217885 | 65.801 |
| 1847.7408091297448 | 65.912 |
| 1850.343847733455 | 66.024 |
| 1852.929875245049 | 66.136 |
| 1855.498711101961 | 66.249 |
| 1858.0501746855366 | 66.363 |
| 1860.584085339861 | 66.476 |
| 1863.100262390803 | 66.591 |
| 1865.598525165277 | 66.706 |
| 1868.0786930107208 | 66.821 |
| 1870.5405853147888 | 66.937 |
| 1872.984021525256 | 67.054 |
| 1875.4088211701353 | 67.171 |
| 1877.8148038780055 | 67.288 |
| 1880.2017893985458 | 67.407 |
| 1882.569597623279 | 67.525 |
| 1884.918048606519 | 67.644 |
| 1887.2469625865217 | 67.764 |
| 1889.5561600068363 | 67.884 |
| 1891.8454615378569 | 68.005 |
| 1894.1146880985705 | 68.127 |
| 1896.3636608785 | 68.248 |
| 1898.5922013598395 | 68.371 |
| 1900.8001313397792 | 68.494 |
| 1902.9872729530193 | 68.617 |
| 1905.1534486944672 | 68.741 |
| 1907.2984814421177 | 68.865 |
| 1909.4221944801127 | 68.99 |
| 1911.5244115219775 | 69.116 |
| 1913.6049567340299 | 69.242 |
| 1915.6636547589612 | 69.368 |
| 1917.700330739583 | 69.495 |
| 1919.7148103427392 | 69.623 |
| 1921.706919783378 | 69.751 |
| 1923.6764858487813 | 69.88 |
| 1925.6233359229482 | 70.009 |
| 1927.547298011127 | 70.138 |
| 1929.4482007644956 | 70.268 |
| 1931.3258735049822 | 70.399 |
| 1933.180146250225 | 70.53 |
| 1935.0108497386675 | 70.662 |
| 1936.8178154547809 | 70.794 |
| 1938.6008756544156 | 70.927 |
| 1940.3598633902723 | 71.06 |
| 1942.0946125374903 | 71.193 |
| 1943.8049578193488 | 71.327 |
| 1945.4907348330753 | 71.462 |
| 1947.1517800757574 | 71.597 |
| 1948.7879309703528 | 71.733 |
| 1950.399025891792 | 71.869 |
| 1951.9849041931695 | 72.006 |
| 1953.5454062320177 | 72.143 |
| 1955.0803733966588 | 72.28 |
| 1956.5896481326286 | 72.418 |
| 1958.073073969167 | 72.557 |
| 1959.5304955457705 | 72.696 |
| 1960.9617586388003 | 72.835 |
| 1962.3667101881395 | 72.975 |
| 1963.7451983238943 | 73.116 |
| 1965.0970723931355 | 73.257 |
| 1966.4221829866688 | 73.398 |
| 1967.7203819658346 | 73.54 |
| 1968.9915224893246 | 73.682 |
| 1970.2354590400137 | 73.825 |
| 1971.4520474517994 | 73.968 |
| 1972.6411449364402 | 74.112 |
| 1973.8026101103899 | 74.256 |
| 1974.9363030216182 | 74.401 |
| 1976.0420851764131 | 74.546 |
| 1977.119819566157 | 74.692 |
| 1978.1693706940698 | 74.837 |
| 1979.1906046019124 | 74.984 |
| 1980.1833888966437 | 75.131 |
| 1981.1475927770239 | 75.278 |
| 1982.0830870601555 | 75.426 |
| 1982.9897442079584 | 75.574 |
| 1983.8674383535674 | 75.722 |
| 1984.7160453276474 | 75.871 |
| 1985.5354426846193 | 76.021 |
| 1986.3255097287868 | 76.171 |
| 1987.0861275403586 | 76.321 |
| 1987.8171790013582 | 76.472 |
| 1988.5185488214117 | 76.623 |
| 1989.1901235634089 | 76.774 |
| 1989.8317916690273 | 76.926 |
| 1990.4434434841135 | 77.078 |
| 1991.0249712839113 | 77.231 |
| 1991.576269298133 | 77.384 |
| 1992.0972337358598 | 77.538 |
| 1992.5877628102708 | 77.691 |
| 1993.047756763185 | 77.846 |
| 1993.477117889415 | 78 |
| 1993.87575056092 | 78.155 |
| 1994.2435612507513 | 78.311 |
| 1994.580458556783 | 78.466 |
| 1994.8863532252192 | 78.622 |
| 1995.1611581738691 | 78.779 |
| 1995.4047885151833 | 78.936 |
| 1995.6171615790415 | 79.093 |
| 1995.798196935285 | 79.25 |
| 1995.9478164159843 | 79.408 |
| 1996.0659441374364 | 79.566 |
| 1996.1525065218798 | 79.725 |
| 1996.207432318923 | 79.884 |
| 1996.2306526266764 | 80.043 |
| 1996.2221009125788 | 80.202 |
| 1996.181713033913 | 80.362 |
| 1996.1094272580008 | 80.522 |
| 1996.0051842820692 | 80.683 |
| 1995.8689272527813 | 80.843 |
| 1995.7006017854224 | 81.004 |
| 1995.5001559827347 | 81.166 |
| 1995.267540453393 | 81.327 |
| 1995.0027083301118 | 81.489 |
| 1994.7056152873784 | 81.651 |
| 1994.3762195588035 | 81.814 |
| 1994.0144819540808 | 81.976 |
| 1993.6203658755499 | 82.139 |
| 1993.1938373343537 | 82.303 |
| 1992.7348649661842 | 82.466 |
| 1992.2434200466073 | 82.63 |
| 1991.7194765059623 | 82.794 |
| 1991.1630109438279 | 82.958 |
| 1990.574002643045 | 83.123 |
| 1989.9524335832957 | 83.287 |
| 1989.2982884542241 | 83.452 |
| 1988.611554668099 | 83.617 |
| 1987.892222372007 | 83.783 |
| 1987.1402844595725 | 83.948 |
| 1986.3557365821982 | 84.114 |
| 1985.538577159817 | 84.28 |
| 1984.688807391152 | 84.446 |
| 1983.80643126348 | 84.612 |
| 1982.8914555618867 | 84.779 |
| 1981.943889878016 | 84.945 |
| 1980.9637466183008 | 85.112 |
| 1979.9510410116734 | 85.279 |
| 1978.9057911167515 | 85.446 |
| 1977.8280178284901 | 85.614 |
| 1976.7177448843001 | 85.781 |
| 1975.5749988696232 | 85.949 |
| 1974.3998092229633 | 86.116 |
| 1973.1922082403678 | 86.284 |
| 1971.9522310793532 | 86.452 |
| 1970.679915762274 | 86.62 |
| 1969.3753031791284 | 86.788 |
| 1968.0384370897987 | 86.957 |
| 1966.6693641257218 | 87.125 |
| 1965.2681337909878 | 87.293 |
| 1963.8347984628608 | 87.462 |
| 1962.369413391723 | 87.63 |
| 1960.872036700435 | 87.799 |
| 1959.3427293831146 | 87.968 |
| 1957.7815553033254 | 88.137 |
| 1956.1885811916795 | 88.305 |
| 1954.5638766428488 | 88.474 |
| 1952.9075141119827 | 88.643 |
| 1951.2195689105329 | 88.812 |
| 1949.5001192014827 | 88.981 |
| 1947.7492459939797 | 89.15 |
| 1945.967033137371 | 89.319 |
| 1944.1535673146402 | 89.488 |
| 1942.3089380352476 | 89.657 |
| 1940.433237627369 | 89.826 |
| 1938.526561229538 | 89.995 |
| 1936.589006781689 | 90.164 |
| 1934.6206750156025 | 90.333 |
| 1932.6216694447521 | 90.502 |
| 1930.5920963535566 | 90.67 |
| 1928.5320647860356 | 90.839 |
| 1926.4416865338717 | 91.008 |
| 1924.3210761238806 | 91.177 |
| 1922.1703508048895 | 91.345 |
| 1919.989630534028 | 91.514 |
| 1917.7790379624334 | 91.682 |
| 1915.5386984203703 | 91.85 |
| 1913.2687399017714 | 92.018 |
| 1910.969293048199 | 92.186 |
| 1908.640491132232 | 92.354 |
| 1906.282470040282 | 92.522 |
| 1903.8953682548415 | 92.69 |
| 1901.4793268361677 | 92.858 |
| 1899.0344894034072 | 93.025 |
| 1896.5610021151658 | 93.192 |
| 1894.0590136495266 | 93.359 |
| 1891.5286751835222 | 93.526 |
| 1888.970140372067 | 93.693 |
| 1886.383565326352 | 93.86 |
| 1883.769108591711 | 94.026 |
| 1881.126931124961 | 94.192 |
| 1878.4571962712232 | 94.358 |
| 1875.7600697402338 | 94.524 |
| 1873.035719582145 | 94.69 |
| 1870.2843161628293 | 94.855 |
| 1867.5060321386875 | 95.02 |
| 1864.7010424309726 | 95.185 |
| 1861.8695241996338 | 95.349 |
| 1859.0116568166873 | 95.514 |
| 1856.1276218391242 | 95.678 |
| 1853.217602981361 | 95.842 |
| 1850.281786087241 | 96.005 |
| 1847.320359101594 | 96.169 |
| 1844.3335120413642 | 96.332 |
| 1841.3214369663137 | 96.494 |
| 1838.2843279493093 | 96.657 |
| 1835.2223810462028 | 96.819 |
| 1832.1357942653128 | 96.98 |
| 1829.024767536517 | 97.142 |
| 1825.8895026799646 | 97.303 |
| 1822.7302033744184 | 97.464 |
| 1819.547075125234 | 97.624 |
| 1816.3403252319895 | 97.784 |
| 1813.1101627557716 | 97.944 |
| 1809.85679848613 | 98.103 |
| 1806.5804449077095 | 98.262 |
| 1803.281316166571 | 98.42 |
| 1799.9596280362096 | 98.578 |
| 1796.6155978832812 | 98.736 |
| 1793.2494446330497 | 98.893 |
| 1789.8613887345612 | 99.05 |
| 1786.4516521255603 | 99.207 |
| 1783.0204581971564 | 99.363 |
| 1779.5680317582517 | 99.518 |
| 1776.094598999742 | 99.674 |
| 1772.6003874585 | 99.828 |
| 1769.0856259811546 | 99.983 |
| 1765.550544687674 | 100.136 |
| 1761.995374934766 | 100.29 |
| 1758.4203492791078 | 100.442 |
| 1754.8257014404114 | 100.595 |
| 1751.211666264342 | 100.747 |
| 1747.5784796852972 | 100.898 |
| 1743.926378689058 | 101.049 |
| 1740.255601275326 | 101.199 |
| 1736.566386420153 | 101.349 |
| 1732.8589740382818 | 101.498 |
| 1729.1336049454 | 101.647 |
| 1725.3905208203282 | 101.795 |
| 1721.6299641671458 | 101.943 |
| 1717.85217827727 | 102.09 |
| 1714.057407191499 | 102.237 |
| 1710.2458956620287 | 102.383 |
| 1706.4178891144572 | 102.528 |
| 1702.5736336097843 | 102.673 |
| 1698.7133758064213 | 102.817 |
| 1694.8373629222194 | 102.961 |
| 1690.9458426965298 | 103.104 |
| 1687.0390633523036 | 103.247 |
| 1683.1172735582466 | 103.388 |
| 1679.1807223910355 | 103.53 |
| 1675.2296592976104 | 103.67 |
| 1671.2643340575503 | 103.81 |
| 1667.284996745546 | 103.95 |
| 1663.291897693979 | 104.088 |
| 1659.2852874556163 | 104.227 |
| 1655.2654167664327 | 104.364 |
| 1651.232536508572 | 104.501 |
| 1647.186897673453 | 104.637 |
| 1643.1287513250356 | 104.772 |
| 1639.0583485632537 | 104.907 |
| 1634.975940487625 | 105.041 |
| 1630.881778161048 | 105.175 |
| 1626.7761125737977 | 105.307 |
| 1622.6591946077237 | 105.439 |
| 1618.5312750006672 | 105.571 |
| 1614.392604311101 | 105.701 |
| 1610.2434328830034 | 105.831 |
| 1606.0840108109749 | 105.96 |
| 1601.914587905605 | 106.089 |
| 1597.735413659101 | 106.216 |
| 1593.5467372111827 | 106.343 |
| 1589.3488073152557 | 106.47 |
| 1585.1418723048673 | 106.595 |
| 1580.9261800604568 | 106.72 |
| 1576.7019779764046 | 106.844 |
| 1572.46951292839 | 106.967 |
| 1568.2290312410646 | 107.089 |
| 1563.980778656047 | 107.211 |
| 1559.725000300249 | 107.332 |
| 1555.461940654536 | 107.452 |
| 1551.1918435227333 | 107.572 |
| 1546.9149520009798 | 107.69 |
| 1542.6315084474395 | 107.808 |
| 1538.3417544523736 | 107.925 |
| 1534.0459308085829 | 108.041 |
| 1529.7442774822223 | 108.157 |
| 1525.437033583996 | 108.271 |
| 1521.1244373407376 | 108.385 |
| 1516.8067260673795 | 108.498 |
| 1512.484136139319 | 108.61 |
| 1508.156902965183 | 108.721 |
| 1503.8252609599986 | 108.832 |
| 1499.4894435187714 | 108.942 |
| 1495.1496829904788 | 109.05 |
| 1490.8062106524787 | 109.158 |
| 1486.4592566853416 | 109.266 |
| 1482.1090501481058 | 109.372 |
| 1477.7558189539614 | 109.477 |
| 1473.3997898463663 | 109.582 |
| 1469.041188375597 | 109.686 |
| 1464.6802388757353 | 109.789 |
| 1460.3171644420981 | 109.891 |
| 1455.9521869091068 | 109.992 |
| 1451.5855268286036 | 110.092 |
| 1447.2174034486145 | 110.192 |
| 1442.8480346925608 | 110.29 |
| 1438.4776371389223 | 110.388 |
| 1434.106426001352 | 110.485 |
| 1429.7346151092445 | 110.58 |
| 1425.3624168887598 | 110.676 |
| 1420.9900423443019 | 110.77 |
| 1416.6177010404556 | 110.863 |
| 1412.2456010843787 | 110.955 |
| 1407.873949108653 | 111.047 |
| 1403.5029502545935 | 111.137 |
| 1399.132808156015 | 111.227 |
| 1394.763724923457 | 111.316 |
| 1390.395901128866 | 111.404 |
| 1386.0295357907362 | 111.491 |
| 1381.6648263597062 | 111.577 |
| 1377.301968704612 | 111.662 |
| 1372.9411570989942 | 111.746 |
| 1368.5825842080615 | 111.83 |
| 1364.2264410761054 | 111.912 |
| 1359.8729171143668 | 111.994 |
| 1355.5222000893532 | 112.074 |
| 1351.1744761116033 | 112.154 |
| 1346.8299296248995 | 112.233 |
| 1342.4887433959243 | 112.31 |
| 1338.1510985043587 | 112.387 |
| 1333.8171743334228 | 112.463 |
| 1329.4871485608521 | 112.538 |
| 1325.1611971503112 | 112.613 |
| 1320.8394943432395 | 112.686 |
| 1316.5222126511271 | 112.758 |
| 1312.2095228482187 | 112.83 |
| 1307.9015939646408 | 112.9 |
| 1303.598593279951 | 112.97 |
| 1299.3006863171051 | 113.038 |
| 1295.008036836839 | 113.106 |
| 1290.7208068324614 | 113.173 |
| 1286.4391565250555 | 113.238 |
| 1282.1632443590834 | 113.303 |
| 1277.893226998392 | 113.367 |
| 1273.6292593226156 | 113.43 |
| 1269.37149442397 | 113.492 |
| 1265.1200836044375 | 113.553 |
| 1260.875176373334 | 113.614 |
| 1256.636920445259 | 113.673 |
| 1252.4054617384202 | 113.731 |
| 1248.180944373331 | 113.789 |
| 1243.9635106718752 | 113.845 |
| 1239.7533011567348 | 113.901 |
| 1235.5504545511772 | 113.955 |
| 1231.3551077791951 | 114.009 |
| 1227.167395965997 | 114.062 |
| 1222.9874524388417 | 114.114 |
| 1218.815408728213 | 114.164 |
| 1214.65139456933 | 114.214 |
| 1210.4955379039868 | 114.263 |
| 1206.3479648827185 | 114.312 |
| 1202.2087998672873 | 114.359 |
| 1198.0781654334842 | 114.405 |
| 1193.9561823742406 | 114.45 |
| 1189.8429697030472 | 114.495 |
| 1185.7386446576709 | 114.538 |
| 1181.6433227041687 | 114.581 |
| 1177.5571175411915 | 114.622 |
| 1173.4801411045723 | 114.663 |
| 1169.4125035721952 | 114.703 |
| 1165.3543133691378 | 114.742 |
| 1161.3056771730849 | 114.78 |
| 1157.2666999200044 | 114.817 |
| 1153.2374848100844 | 114.853 |
| 1149.2181333139224 | 114.888 |
| 1145.2087451789641 | 114.922 |
| 1141.2094184361854 | 114.956 |
| 1137.2202494070123 | 114.988 |
| 1133.241332710474 | 115.02 |
| 1129.2727612705835 | 115.05 |
| 1125.3146263239414 | 115.08 |
| 1121.3670174275555 | 115.109 |
| 1117.4300224668743 | 115.137 |
| 1113.5037276640257 | 115.164 |
| 1109.5882175862587 | 115.19 |
| 1105.6835751545814 | 115.215 |
| 1101.78988165259 | 115.24 |
| 1097.9072167354848 | 115.263 |
| 1094.0356584392666 | 115.286 |
| 1090.1752831901101 | 115.307 |
| 1086.3261658139086 | 115.328 |
| 1082.488379545984 | 115.348 |
| 1078.661996040958 | 115.367 |
| 1074.847085382781 | 115.385 |
| 1071.0437160949107 | 115.402 |
| 1067.2519551506375 | 115.419 |
| 1063.4718679835523 | 115.434 |
| 1059.7035184981496 | 115.449 |
| 1055.9469690805643 | 115.463 |
| 1052.2022806094344 | 115.476 |
| 1048.469512466887 | 115.488 |
| 1044.748722549642 | 115.499 |
| 1041.0399672802296 | 115.509 |
| 1037.343301618315 | 115.519 |
| 1033.65877907213 | 115.527 |
| 1029.9864517100016 | 115.535 |
| 1026.3263701719773 | 115.542 |
| 1022.6785836815422 | 115.548 |
| 1019.0431400574212 | 115.553 |
| 1015.4200857254638 | 115.558 |
| 1011.8094657306078 | 115.561 |
| 1008.2113237489169 | 115.564 |
| 1004.625702099687 | 115.566 |
| 1001.0526417576199 | 115.567 |
| 997.4921823650571 | 115.567 |
| 993.944362244273 | 115.567 |
| 990.4092184098203 | 115.565 |
| 986.886786580927 | 115.563 |
| 983.3771011939385 | 115.56 |
| 979.8801954148024 | 115.556 |
| 976.3961011515926 | 115.552 |
| 972.9248490670675 | 115.546 |
| 969.4664685912611 | 115.54 |
| 966.020987934101 | 115.533 |
| 962.5884340980514 | 115.525 |
| 959.1688328907773 | 115.516 |
| 955.7622089378266 | 115.507 |
| 952.3685856953264 | 115.497 |
| 948.9879854626909 | 115.486 |
| 945.6204293953372 | 115.474 |
| 942.2659375174064 | 115.461 |
| 938.9245287344863 | 115.448 |
| 935.5962208463332 | 115.434 |
| 932.2810305595893 | 115.419 |
| 928.9789735004945 | 115.403 |
| 925.6900642275863 | 115.387 |
| 922.4143162443894 | 115.37 |
| 919.1517420120886 | 115.352 |
| 915.9023529621844 | 115.333 |
| 912.6661595091282 | 115.314 |
| 909.4431710629342 | 115.294 |
| 906.233396041766 | 115.273 |
| 903.0368418844951 | 115.251 |
| 899.853515063229 | 115.229 |
| 896.6834210958074 | 115.206 |
| 893.5265645582622 | 115.182 |
| 890.3829490972417 | 115.158 |
| 887.2525774423947 | 115.132 |
| 884.1354514187134 | 115.106 |
| 881.0315719588331 | 115.08 |
| 877.9409391152864 | 115.052 |
| 874.8635520727099 | 115.024 |
| 871.7994091600021 | 114.995 |
| 868.7485078624294 | 114.966 |
| 865.7108448336801 | 114.936 |
| 862.6864159078635 | 114.905 |
| 859.6752161114528 | 114.873 |
| 856.6772396751694 | 114.841 |
| 853.6924800458092 | 114.808 |
| 850.7209298980067 | 114.775 |
| 847.7625811459366 | 114.74 |
| 844.817424954952 | 114.705 |
| 841.8854517531573 | 114.67 |
| 838.9666512429142 | 114.634 |
| 836.0610124122791 | 114.597 |
| 833.168523546373 | 114.559 |
| 830.2891722386789 | 114.521 |
| 827.4229454022698 | 114.482 |
| 824.5698292809616 | 114.442 |
| 821.7298094603947 | 114.402 |
| 818.9028708790389 | 114.361 |
| 816.0889978391239 | 114.32 |
| 813.2881740174919 | 114.278 |
| 810.5003824763736 | 114.235 |
| 807.7256056740852 | 114.192 |
| 804.963825475646 | 114.148 |
| 802.2150231633165 | 114.104 |
| 799.4791794470549 | 114.058 |
| 796.7562744748928 | 114.013 |
| 794.0462878432284 | 113.966 |
| 791.3491986070362 | 113.919 |
| 788.664985289995 | 113.872 |
| 785.9936258945298 | 113.824 |
| 783.3350979117707 | 113.775 |
| 780.6893783314264 | 113.726 |
| 778.0564436515716 | 113.676 |
| 775.4362698883498 | 113.625 |
| 772.8288325855883 | 113.574 |
| 770.234106824328 | 113.523 |
| 767.652067232265 | 113.471 |
| 765.082687993106 | 113.418 |
| 762.525942855835 | 113.365 |
| 759.9818051438936 | 113.311 |
| 757.4502477642719 | 113.256 |
| 754.9312432165125 | 113.201 |
| 752.424763601625 | 113.146 |
| 749.9307806309134 | 113.09 |
| 747.4492656347132 | 113.033 |
| 744.9801895710416 | 112.976 |
| 742.5235230341577 | 112.919 |
| 740.0792362630352 | 112.86 |
| 737.6472991497452 | 112.802 |
| 735.227681247751 | 112.743 |
| 732.820351780114 | 112.683 |
| 730.4252796476114 | 112.623 |
| 728.0424334367648 | 112.562 |
| 725.6717814277808 | 112.501 |
| 723.3132916024036 | 112.439 |
| 720.9669316516789 | 112.377 |
| 718.6326689836301 | 112.314 |
| 716.310470730847 | 112.251 |
| 714.0003037579868 | 112.187 |
| 711.7021346691876 | 112.123 |
| 709.4159298153952 | 112.058 |
| 707.1416553016029 | 111.993 |
| 704.8792769940046 | 111.928 |
| 702.6287605270621 | 111.862 |
| 700.3900713104861 | 111.795 |
| 698.1631745361315 | 111.728 |
| 695.9480351848081 | 111.661 |
| 693.7446180330057 | 111.593 |
| 691.5528876595351 | 111.524 |
| 689.3728084520847 | 111.456 |
| 687.2043446136929 | 111.386 |
| 685.0474601691385 | 111.317 |
| 682.9021189712466 | 111.247 |
| 680.7682847071131 | 111.176 |
| 678.6459209042463 | 111.105 |
| 676.5349909366274 | 111.034 |
| 674.43545803069 | 110.962 |
| 672.3472852712182 | 110.89 |
| 670.2704356071649 | 110.817 |
| 668.2048718573908 | 110.744 |
| 666.1505567163231 | 110.67 |
| 664.1074527595367 | 110.596 |
| 662.0755224492565 | 110.522 |
| 660.0547281397817 | 110.447 |
| 658.0450320828339 | 110.372 |
| 656.046396432828 | 110.297 |
| 654.0587832520671 | 110.221 |
| 652.0821545158616 | 110.145 |
| 650.1164721175742 | 110.068 |
| 648.1616978735894 | 109.991 |
| 646.2177935282102 | 109.914 |
| 644.2847207584806 | 109.836 |
| 642.3624411789363 | 109.758 |
| 640.4509163462825 | 109.679 |
| 638.5501077640009 | 109.6 |
| 636.6599768868855 | 109.521 |
| 634.7804851255074 | 109.442 |
| 632.9115938506116 | 109.362 |
| 631.0532643974421 | 109.281 |
| 629.2054580700017 | 109.201 |
| 627.3681361452406 | 109.12 |
| 625.5412598771799 | 109.038 |
| 623.7247905009679 | 108.957 |
| 621.9186892368696 | 108.875 |
| 620.1229172941918 | 108.792 |
| 618.3374358751424 | 108.71 |
| 616.5622061786262 | 108.627 |
| 614.7971894039764 | 108.543 |
| 613.0423467546236 | 108.46 |
| 611.2976394417025 | 108.376 |
| 609.5630286875962 | 108.292 |
| 607.8384757294201 | 108.207 |
| 606.1239418224446 | 108.122 |
| 604.4193882434587 | 108.037 |
| 602.7247762940734 | 107.952 |
| 601.0400673039672 | 107.866 |
| 599.3652226340732 | 107.78 |
| 597.7002036797087 | 107.693 |
| 596.0449718736481 | 107.607 |
| 594.3994886891402 | 107.52 |
| 592.7637156428686 | 107.433 |
| 591.1376142978585 | 107.345 |
| 589.521146266328 | 107.257 |
| 587.9142732124868 | 107.169 |
| 586.316956855281 | 107.081 |
| 584.7291589710853 | 106.992 |
| 583.150841396344 | 106.903 |
| 581.58196603016 | 106.814 |
| 580.0224948368331 | 106.725 |
| 578.4723898483489 | 106.635 |
| 576.9316131668178 | 106.545 |
| 575.400126966864 | 106.455 |
| 573.8778934979683 | 106.365 |
| 572.3648750867615 | 106.274 |
| 570.8610341392706 | 106.183 |
| 569.3663331431202 | 106.092 |
| 567.8807346696854 | 106.001 |
| 566.4042013762013 | 105.909 |
| 564.9366960078265 | 105.817 |
| 563.478181399663 | 105.725 |
| 562.0286204787316 | 105.633 |
| 560.5879762659051 | 105.54 |
| 559.1562118777982 | 105.448 |
| 557.7332905286156 | 105.355 |
| 556.3191755319585 | 105.261 |
| 554.9138303025904 | 105.168 |
| 553.5172183581623 | 105.074 |
| 552.1293033208981 | 104.981 |
| 550.7500489192407 | 104.887 |
| 549.3794189894594 | 104.792 |
| 548.0173774772187 | 104.698 |
| 546.6638884391099 | 104.603 |
| 545.318916044145 | 104.508 |
| 543.9824245752144 | 104.413 |
| 542.654378430508 | 104.318 |
| 541.3347421249007 | 104.223 |
| 540.0234802913028 | 104.127 |
| 538.7205576819762 | 104.031 |
| 537.4259391698155 | 103.935 |
| 536.1395897495961 | 103.839 |
| 534.8614745391892 | 103.743 |
| 533.5915587807435 | 103.646 |
| 532.3298078418354 | 103.55 |
| 531.0761872165868 | 103.453 |
| 529.8306625267521 | 103.356 |
| 528.5931995227742 | 103.259 |
| 527.3637640848102 | 103.161 |
| 526.1423222237273 | 103.064 |
| 524.9288400820692 | 102.966 |
| 523.7232839349932 | 102.868 |
| 522.5256201911797 | 102.77 |
| 521.3358153937124 | 102.672 |
| 520.1538362209319 | 102.574 |
| 518.9796494872614 | 102.475 |
| 517.813222144006 | 102.377 |
| 516.6545212801252 | 102.278 |
| 515.5035141229803 | 102.179 |
| 514.360168039055 | 102.08 |
| 513.2244505346522 | 101.981 |
| 512.0963292565651 | 101.882 |
| 510.9757719927248 | 101.782 |
| 509.86274667282294 | 101.683 |
| 508.75722136891204 | 101.583 |
| 507.6591642959818 | 101.483 |
| 506.568543812513 | 101.383 |
| 505.48532842100917 | 101.283 |
| 504.40948676850604 | 101.183 |
| 503.3409876470595 | 101.083 |
| 502.27979999421206 | 100.982 |
| 501.22589289343904 | 100.882 |
| 500.1792355745736 | 100.781 |
| 499.13979741421196 | 100.681 |
| 498.1075479360986 | 100.58 |
| 497.08245681149236 | 100.479 |
| 496.0644938595129 | 100.378 |
| 495.05362904746875 | 100.277 |
| 494.049832491167 | 100.175 |
| 493.0530744552046 | 100.074 |
| 492.0633253532417 | 99.972 |
| 491.0805557482583 | 99.871 |
| 490.10473635279294 | 99.769 |
| 489.135838029165 | 99.667 |
| 488.17383178968026 | 99.566 |
| 487.21868879682074 | 99.464 |
| 486.27038036341776 | 99.362 |
| 485.3288779528103 | 99.26 |
| 484.39415317898744 | 99.157 |
| 483.46617780671625 | 99.055 |
| 482.5449237516545 | 98.953 |
| 481.63036308044923 | 98.85 |
| 480.72246801082116 | 98.748 |
| 479.821210911635 | 98.645 |
| 478.9265643029563 | 98.543 |
| 478.0385008560952 | 98.44 |
| 477.1569933936366 | 98.337 |
| 476.2820148894579 | 98.234 |
| 475.41353846873426 | 98.132 |
| 474.551537407931 | 98.029 |
| 473.6959851347848 | 97.926 |
| 472.8468552282724 | 97.823 |
| 472.00412141856805 | 97.719 |
| 471.1677575869899 | 97.616 |
| 470.33773776593483 | 97.513 |
| 469.5140361388027 | 97.41 |
| 468.69662703991014 | 97.306 |
| 467.8854849543938 | 97.203 |
| 467.08058451810354 | 97.099 |
| 466.2819005174855 | 96.996 |
| 465.48940788945595 | 96.892 |
| 464.7030817212651 | 96.789 |
| 463.9228972503521 | 96.685 |
| 463.14882986419065 | 96.582 |
| 462.380855100126 | 96.478 |
| 461.61894864520315 | 96.374 |
| 460.86308633598685 | 96.27 |
| 460.11324415837294 | 96.167 |
| 459.3693982473919 | 96.063 |
| 458.63152488700484 | 95.959 |
| 457.89960050989106 | 95.855 |
| 457.17360169722895 | 95.751 |
| 456.453505178469 | 95.647 |
| 455.73928783110006 | 95.543 |
| 455.03092668040836 | 95.439 |
| 454.3283988992301 | 95.335 |
| 453.63168180769713 | 95.231 |
| 452.9407528729766 | 95.127 |
| 452.25558970900374 | 95.023 |
| 451.57617007620934 | 94.919 |
| 450.9024718812407 | 94.815 |
| 450.2344731766769 | 94.711 |
| 449.57215216073894 | 94.606 |
| 448.91548717699374 | 94.502 |
| 448.26445671405327 | 94.398 |
| 447.61903940526855 | 94.294 |
| 446.97921402841837 | 94.19 |
| 446.3449595053934 | 94.086 |
| 445.71625490187546 | 93.981 |
| 445.0930794270124 | 93.877 |
| 444.47541243308825 | 93.773 |
| 443.86323341518914 | 93.669 |
| 443.2565220108654 | 93.565 |
| 442.65525799978917 | 93.461 |
| 442.0594213034084 | 93.356 |
| 441.4689919845968 | 93.252 |
| 440.8839502473006 | 93.148 |
| 440.3042764361813 | 93.044 |
| 439.72995103625504 | 92.94 |
| 439.1609546725292 | 92.836 |
| 438.5972681096352 | 92.731 |
| 438.03887225145854 | 92.627 |
| 437.48574814076596 | 92.523 |
| 436.9378769588296 | 92.419 |
| 436.3952400250484 | 92.315 |
| 435.8578187965672 | 92.211 |
| 435.3255948678928 | 92.107 |
| 434.79854997050813 | 92.003 |
| 434.27666597248384 | 91.899 |
| 433.75992487808765 | 91.795 |
| 433.24830882739167 | 91.691 |
| 432.7418000958778 | 91.587 |
| 432.24038109404097 | 91.483 |
| 431.7440343669907 | 91.379 |
| 431.25274259405097 | 91.275 |
| 430.7664885883583 | 91.172 |
| 430.28525529645833 | 91.068 |
| 429.809025797901 | 90.964 |
| 429.33778330483403 | 90.86 |
| 428.8715111615957 | 90.757 |
| 428.41019284430575 | 90.653 |
| 427.95381196045537 | 90.549 |
| 427.5023522484963 | 90.446 |
| 427.05579757742885 | 90.342 |
| 426.6141319463886 | 90.239 |
| 426.177339484233 | 90.135 |
| 425.74540444912645 | 90.032 |
| 425.31831122812525 | 89.928 |
| 424.8960443367615 | 89.825 |
| 424.4785884186268 | 89.722 |
| 424.0659282449551 | 89.618 |
| 423.6580487142054 | 89.515 |
| 423.25493485164384 | 89.412 |
| 422.8565718089257 | 89.309 |
| 422.46294486367714 | 89.206 |
| 422.0740394190765 | 89.103 |
| 421.6898410034357 | 89 |
| 421.31033526978166 | 88.897 |
| 420.9355079954375 | 88.794 |
| 420.5653450816037 | 88.691 |
| 420.1998325529398 | 88.588 |
| 419.8389565571458 | 88.485 |
| 419.4827033645439 | 88.383 |
| 419.13105936766067 | 88.28 |
| 418.7840110808093 | 88.178 |
| 418.4415451396723 | 88.075 |
| 418.1036483008846 | 87.973 |
| 417.770307441617 | 87.87 |
| 417.4415095591603 | 87.768 |
| 417.11724177050996 | 87.666 |
| 416.797491311951 | 87.564 |
| 416.48224553864384 | 87.461 |
| 416.1714919242109 | 87.359 |
| 415.8652180603236 | 87.257 |
| 415.5634116562903 | 87.155 |
| 415.2660605386449 | 87.053 |
| 414.9731526507364 | 86.952 |
| 414.6846760523191 | 86.85 |
| 414.40061891914416 | 86.748 |
| 414.12096954255145 | 86.647 |
| 413.84571632906284 | 86.545 |
| 413.5748477999763 | 86.444 |
| 413.308352590961 | 86.342 |
| 413.04621945165377 | 86.241 |
| 412.7884372452561 | 86.14 |
| 412.5349949481327 | 86.039 |
| 412.28588164941124 | 85.938 |
| 412.04108655058286 | 85.836 |
| 411.8005989651044 | 85.736 |
| 411.5644083180014 | 85.635 |
| 411.33250414547274 | 85.534 |
| 411.10487609449615 | 85.433 |
| 410.88151392243566 | 85.333 |
| 410.66240749664973 | 85.232 |
| 410.44754679410113 | 85.132 |
| 410.236921900968 | 85.031 |
| 410.0305230122565 | 84.931 |
| 409.8283404314147 | 84.831 |
| 409.63036456994814 | 84.731 |
| 409.43658594703663 | 84.631 |
| 409.24699518915264 | 84.531 |
| 409.0615830296812 | 84.431 |
| 408.88034030854124 | 84.331 |
| 408.70325797180874 | 84.231 |
| 408.53032707134105 | 84.132 |
| 408.36153876440306 | 84.032 |
| 408.1968843132949 | 83.933 |
| 408.0363550849811 | 83.833 |
| 407.8799425507217 | 83.734 |
| 407.72763828570464 | 83.635 |
| 407.57943396868006 | 83.536 |
| 407.43532138159605 | 83.437 |
| 407.29529240923625 | 83.338 |
| 407.1593390388591 | 83.239 |
| 407.0274533598388 | 83.14 |
| 406.89962756330766 | 83.042 |
| 406.77585394180096 | 82.943 |
| 406.65612488890264 | 82.845 |
| 406.5404328988933 | 82.747 |
| 406.42877056639975 | 82.648 |
| 406.3211305860464 | 82.55 |
| 406.21750575210837 | 82.452 |
| 406.1178889581663 | 82.354 |
| 406.0222731967632 | 82.257 |
| 405.9306515590628 | 82.159 |
| 405.84301723451 | 82.061 |
| 405.75936351049273 | 81.964 |
| 405.679683772006 | 81.866 |
| 405.60397150131763 | 81.769 |
| 405.53222027763564 | 81.672 |
| 405.4644237767779 | 81.575 |
| 405.40057577084303 | 81.478 |
| 405.3406701278837 | 81.381 |
| 405.2847008115814 | 81.284 |
| 405.23266188092305 | 81.187 |
| 405.1845474898799 | 81.091 |
| 405.1403518870876 | 80.994 |
| 405.1000694155288 | 80.898 |
| 405.0636945122171 | 80.802 |
| 405.0312217078831 | 80.706 |
| 405.00264562666223 | 80.609 |
| 404.9779609857845 | 80.514 |
| 404.957162595266 | 80.418 |
| 404.94024535760263 | 80.322 |
| 404.927204267465 | 80.226 |
| 404.9180344113958 | 80.131 |
| 404.9127309675088 | 80.036 |
| 404.9112892051898 | 79.94 |
| 404.9137044847992 | 79.845 |
| 404.9199722573768 | 79.75 |
| 404.93008806434807 | 79.655 |
| 404.9440475372327 | 79.56 |
| 404.96184639735446 | 79.466 |
| 404.9834804555536 | 79.371 |
| 405.0089456119004 | 79.277 |
| 405.038237855411 | 79.182 |
| 405.071353263765 | 79.088 |
| 405.10828800302477 | 78.994 |
| 405.1490383273568 | 78.9 |
| 405.19360057875457 | 78.806 |
| 405.24197118676375 | 78.712 |
| 405.29414666820867 | 78.619 |
| 405.35012362692095 | 78.525 |
| 405.4098987534698 | 78.432 |
| 405.4734688248943 | 78.339 |
| 405.5408307044373 | 78.246 |
| 405.6119813412812 | 78.153 |
| 405.6869177702855 | 78.06 |
| 405.7656371117262 | 77.967 |
| 405.848136571037 | 77.874 |
| 405.93441343855204 | 77.782 |
| 406.0244650892508 | 77.689 |
| 406.1182889825044 | 77.597 |
| 406.2158826618239 | 77.505 |
| 406.31724375461033 | 77.413 |
| 406.42236997190616 | 77.321 |
| 406.5312591081491 | 77.229 |
| 406.6439090409269 | 77.137 |
| 406.76031773073476 | 77.046 |
| 406.8804832207333 | 76.954 |
| 407.0044036365095 | 76.863 |
| 407.1320771858382 | 76.772 |
| 407.26350215844644 | 76.681 |
| 407.39867692577815 | 76.59 |
| 407.53759994076177 | 76.499 |
| 407.6802697375788 | 76.409 |
| 407.82668493143416 | 76.318 |
| 407.97684421832827 | 76.228 |
| 408.13074637483084 | 76.137 |
| 408.28839025785595 | 76.047 |
| 408.44977480443924 | 75.957 |
| 408.61489903151636 | 75.867 |
| 408.7837620357031 | 75.778 |
| 408.9563629930771 | 75.688 |
| 409.13270115896125 | 75.599 |
| 409.3127758677086 | 75.509 |
| 409.49658653248866 | 75.42 |
| 409.6841326450757 | 75.331 |
| 409.87541377563787 | 75.242 |
| 410.0704295725287 | 75.153 |
| 410.26917976207955 | 75.065 |
| 410.4716641483935 | 74.976 |
| 410.6778826131412 | 74.888 |
| 410.88783511535803 | 74.799 |
| 411.1015216912424 | 74.711 |
| 411.31894245395586 | 74.623 |
| 411.54009759342466 | 74.535 |
| 411.76498737614264 | 74.448 |
| 411.9936121449755 | 74.36 |
| 412.2259723189666 | 74.273 |
| 412.4620683931443 | 74.185 |
| 412.70190093833014 | 74.098 |
| 412.94547060094914 | 74.011 |
| 413.19277810284086 | 73.924 |
| 413.44382424107226 | 73.837 |
| 413.6986098877515 | 73.751 |
| 413.95713598984344 | 73.664 |
| 414.2194035689862 | 73.578 |
| 414.48541372130916 | 73.492 |
| 414.7551676172522 | 73.406 |
| 415.02866650138617 | 73.32 |
| 415.3059116922347 | 73.234 |
| 415.5869045820973 | 73.148 |
| 415.8716466368736 | 73.063 |
| 416.16013939588885 | 72.978 |
| 416.4523844717205 | 72.892 |
| 416.74838355002646 | 72.807 |
| 417.0481383893738 | 72.722 |
| 417.35165082106914 | 72.638 |
| 417.6589227489903 | 72.553 |
| 417.96995614941846 | 72.468 |
| 418.2847530708722 | 72.384 |
| 418.6033156339421 | 72.3 |
| 418.9256460311266 | 72.216 |
| 419.251746526669 | 72.132 |
| 419.58161945639574 | 72.048 |
| 419.9152672275551 | 71.964 |
| 420.25269231865764 | 71.881 |
| 420.5938972793172 | 71.798 |
| 420.93888473009315 | 71.714 |
| 421.28765736233345 | 71.631 |
| 421.6402179380189 | 71.548 |
| 421.9965692896081 | 71.466 |
| 422.35671431988357 | 71.383 |
| 422.7206560017988 | 71.301 |
| 423.0883973783259 | 71.218 |
| 423.4599415623047 | 71.136 |
| 423.83529173629216 | 71.054 |
| 424.2144511524129 | 70.972 |
| 424.5974231322108 | 70.89 |
| 424.984211066501 | 70.809 |
| 425.37481841522316 | 70.727 |
| 425.769248707295 | 70.646 |
| 426.16750554046706 | 70.565 |
| 426.56959258117826 | 70.484 |
| 426.97551356441176 | 70.403 |
| 427.385272293552 | 70.323 |
| 427.7988726402422 | 70.242 |
| 428.2163185442427 | 70.162 |
| 428.6376140132899 | 70.081 |
| 429.0627631229559 | 70.001 |
| 429.49177001650884 | 69.921 |
| 429.9246389047737 | 69.842 |
| 430.36137406599386 | 69.762 |
| 430.80197984569327 | 69.682 |
| 431.24646065653906 | 69.603 |
| 431.6948209782049 | 69.524 |
| 432.14706535723474 | 69.445 |
| 432.603198406907 | 69.366 |
| 433.0632248070995 | 69.287 |
| 433.5271493041549 | 69.209 |
| 433.994976710746 | 69.13 |
| 434.4667119057426 | 69.052 |
| 434.94235983407765 | 68.974 |
| 435.4219255066144 | 68.896 |
| 435.9054140000139 | 68.818 |
| 436.39283045660284 | 68.741 |
| 436.8841800842417 | 68.663 |
| 437.379468156193 | 68.586 |
| 437.8787000109906 | 68.509 |
| 438.3818810523083 | 68.432 |
| 438.88901674882953 | 68.355 |
| 439.40011263411674 | 68.278 |
| 439.9151743064815 | 68.202 |
| 440.4342074288544 | 68.125 |
| 440.9572177286553 | 68.049 |
| 441.4842109976638 | 67.973 |
| 442.01519309188996 | 67.897 |
| 442.55016993144477 | 67.821 |
| 443.0891475004112 | 67.745 |
| 443.63213184671486 | 67.67 |
| 444.1791290819953 | 67.595 |
| 444.73014538147675 | 67.52 |
| 445.2851869838392 | 67.445 |
| 445.84426019108963 | 67.37 |
| 446.40737136843296 | 67.295 |
| 446.9745269441429 | 67.221 |
| 447.5457334094331 | 67.146 |
| 448.1209973183279 | 67.072 |
| 448.700325287533 | 66.998 |
| 449.28372399630615 | 66.924 |
| 449.8712001863276 | 66.85 |
| 450.4627606615704 | 66.777 |
| 451.0584122881705 | 66.704 |
| 451.6581619942964 | 66.63 |
| 452.2620167700191 | 66.557 |
| 452.8699836671813 | 66.484 |
| 453.48206979926647 | 66.412 |
| 454.0982823412676 | 66.339 |
| 454.7186285295555 | 66.267 |
| 455.3431156617471 | 66.194 |
| 455.9717510965731 | 66.122 |
| 456.60454225374485 | 66.05 |
| 457.2414966138217 | 65.978 |
| 457.88262171807696 | 65.907 |
| 458.527925168364 | 65.835 |
| 459.17741462698154 | 65.764 |
| 459.8310978165386 | 65.693 |
| 460.48898251981865 | 65.622 |
| 461.1510765796433 | 65.551 |
| 461.8173878987356 | 65.48 |
| 462.4879244395823 | 65.41 |
| 463.16269422429565 | 65.34 |
| 463.8417053344746 | 65.27 |
| 464.5249659110653 | 65.2 |
| 465.2124841542204 | 65.13 |
| 465.9042683231584 | 65.06 |
| 466.6003267360214 | 64.991 |
| 467.30066776973246 | 64.921 |
| 468.0052998598522 | 64.852 |
| 468.7142315004341 | 64.783 |
| 469.42747124387944 | 64.714 |
| 470.1450277007909 | 64.646 |
| 470.86690953982514 | 64.577 |
| 471.59312548754497 | 64.509 |
| 472.32368432826985 | 64.441 |
| 473.05859490392567 | 64.373 |
| 473.7978661138935 | 64.305 |
| 474.54150691485717 | 64.237 |
| 475.2895263206495 | 64.17 |
| 476.04193340209775 | 64.102 |
| 476.7987372868678 | 64.035 |
| 477.5599471593068 | 63.968 |
| 478.32557226028484 | 63.901 |
| 479.0956218870356 | 63.834 |
| 479.8701053929949 | 63.768 |
| 480.64903218763885 | 63.702 |
| 481.43241173632 | 63.635 |
| 482.22025356010215 | 63.569 |
| 483.01256723559425 | 63.504 |
| 483.809362394782 | 63.438 |
| 484.61064872485866 | 63.372 |
| 485.41643596805415 | 63.307 |
| 486.2267339214623 | 63.242 |
| 487.04155243686694 | 63.177 |
| 487.860901420566 | 63.112 |
| 488.68479083319426 | 63.048 |
| 489.51323068954423 | 62.983 |
| 490.34623105838534 | 62.919 |
| 491.1838020622814 | 62.855 |
| 492.02595387740627 | 62.791 |
| 492.8726967333576 | 62.727 |
| 493.7240409129691 | 62.663 |
| 494.5799967521203 | 62.6 |
| 495.4405746395449 | 62.537 |
| 496.30578501663706 | 62.473 |
| 497.17563837725544 | 62.411 |
| 498.0501452675256 | 62.348 |
| 498.92931628563986 | 62.285 |
| 499.81316208165555 | 62.223 |
| 500.7016933572909 | 62.16 |
| 501.59492086571856 | 62.098 |
| 502.49285541135737 | 62.037 |
| 503.39550784966144 | 61.975 |
| 504.30288908690716 | 61.913 |
| 505.21501007997784 | 61.852 |
| 506.13188183614614 | 61.791 |
| 507.0535154128538 | 61.73 |
| 507.9799219174892 | 61.669 |
| 508.9111125071624 | 61.608 |
| 509.8470983884775 | 61.548 |
| 510.7878908173026 | 61.487 |
| 511.73350109853726 | 61.427 |
| 512.683940585877 | 61.367 |
| 513.6392206815757 | 61.307 |
| 514.5993528362044 | 61.248 |
| 515.5643485484084 | 61.188 |
| 516.5342193646605 | 61.129 |
| 517.5089768790128 | 61.07 |
| 518.4886327328439 | 61.011 |
| 519.4731986146046 | 60.952 |
| 520.4626862595597 | 60.894 |
| 521.4571074495278 | 60.835 |
| 522.4564740126169 | 60.777 |
| 523.4607978229579 | 60.719 |
| 524.4700908004344 | 60.661 |
| 525.4843649104091 | 60.603 |
| 526.5036321634483 | 60.546 |
| 527.5279046150414 | 60.488 |
| 528.5571943653182 | 60.431 |
| 529.5915135587627 | 60.374 |
| 530.6308743839231 | 60.317 |
| 531.675289073119 | 60.261 |
| 532.7247699021443 | 60.204 |
| 533.7793291899675 | 60.148 |
| 534.8389792984275 | 60.092 |
| 535.9037326319267 | 60.036 |
| 536.9736016371197 | 59.98 |
| 538.0485988025986 | 59.925 |
| 539.1287366585743 | 59.87 |
| 540.2140277765546 | 59.814 |
| 541.3044847690178 | 59.759 |
| 542.4001202890822 | 59.705 |
| 543.500947030173 | 59.65 |
| 544.6069777256835 | 59.595 |
| 545.7182251486329 | 59.541 |
| 546.8347021113208 | 59.487 |
| 547.9564214649763 | 59.433 |
| 549.0833960994037 | 59.379 |
| 550.2156389426233 | 59.326 |
| 551.3531629605088 | 59.272 |
| 552.4959811564194 | 59.219 |
| 553.6441065708281 | 59.166 |
| 554.7975522809451 | 59.113 |
| 555.9563314003374 | 59.061 |
| 557.120457078543 | 59.008 |
| 558.2899425006809 | 58.956 |
| 559.4648008870563 | 58.904 |
| 560.6450454927611 | 58.852 |
| 561.8306896072701 | 58.8 |
| 563.0217465540313 | 58.749 |
| 564.2182296900523 | 58.698 |
| 565.4201524054812 | 58.646 |
| 566.6275281231826 | 58.595 |
| 567.840370298309 | 58.545 |
| 569.0586924178663 | 58.494 |
| 570.2825080002744 | 58.444 |
| 571.5118305949233 | 58.393 |
| 572.7466737817224 | 58.343 |
| 573.9870511706463 | 58.293 |
| 575.2329764012735 | 58.244 |
| 576.4844631423208 | 58.194 |
| 577.7415250911714 | 58.145 |
| 579.0041759733981 | 58.096 |
| 580.2724295422803 | 58.047 |
| 581.5462995783156 | 57.998 |
| 582.8257998887257 | 57.95 |
| 584.110944306956 | 57.901 |
| 585.4017466921698 | 57.853 |
| 586.6982209287365 | 57.805 |
| 588.0003809257138 | 57.758 |
| 589.308240616323 | 57.71 |
| 590.6218139574198 | 57.663 |
| 591.9411149289573 | 57.615 |
| 593.2661575334438 | 57.568 |
| 594.5969557953936 | 57.521 |
| 595.9335237607718 | 57.475 |
| 597.2758754964326 | 57.428 |
| 598.6240250895509 | 57.382 |
| 599.9779866470474 | 57.336 |
| 601.3377742950072 | 57.29 |
| 602.7034021780913 | 57.244 |
| 604.0748844589419 | 57.199 |
| 605.4522353175801 | 57.154 |
| 606.8354689507972 | 57.109 |
| 608.2245995715391 | 57.064 |
| 609.6196414082831 | 57.019 |
| 611.0206087044081 | 56.974 |
| 612.4275157175573 | 56.93 |
| 613.8403767189935 | 56.886 |
| 615.2592059929478 | 56.842 |
| 616.68401783596 | 56.798 |
| 618.1148265562119 | 56.755 |
| 619.5516464728531 | 56.711 |
| 620.994491915319 | 56.668 |
| 622.4433772226416 | 56.625 |
| 623.8983167427517 | 56.583 |
| 625.3593248317738 | 56.54 |
| 626.8264158533134 | 56.498 |
| 628.2996041777352 | 56.455 |
| 629.7789041814347 | 56.414 |
| 631.2643302461001 | 56.372 |
| 632.755896757968 | 56.33 |
| 634.2536181070681 | 56.289 |
| 635.7575086864622 | 56.248 |
| 637.2675828914732 | 56.207 |
| 638.783855118906 | 56.166 |
| 640.3063397662598 | 56.125 |
| 641.8350512309319 | 56.085 |
| 643.3700039094123 | 56.045 |
| 644.91121219647 | 56.005 |
| 646.4586904843303 | 55.965 |
| 648.0124531618426 | 55.925 |
| 649.5725146136397 | 55.886 |
| 651.1388892192879 | 55.847 |
| 652.7115913524276 | 55.808 |
| 654.2906353799051 | 55.769 |
| 655.8760356608941 | 55.731 |
| 657.4678065460089 | 55.692 |
| 659.0659623764071 | 55.654 |
| 660.6705174828835 | 55.616 |
| 662.2814861849532 | 55.578 |
| 663.8988827899263 | 55.541 |
| 665.5227215919714 | 55.504 |
| 667.15301687117 | 55.466 |
| 668.7897828925609 | 55.429 |
| 670.4330339051735 | 55.393 |
| 672.0827841410521 | 55.356 |
| 673.7390478142694 | 55.32 |
| 675.4018391199293 | 55.284 |
| 677.0711722331598 | 55.248 |
| 678.7470613080951 | 55.212 |
| 680.429520476847 | 55.177 |
| 682.1185638484657 | 55.142 |
| 683.8142055078896 | 55.106 |
| 685.5164595148849 | 55.072 |
| 687.225339902973 | 55.037 |
| 688.9408606783481 | 55.003 |
| 690.6630358187828 | 54.968 |
| 692.3918792725226 | 54.934 |
| 694.1274049571697 | 54.901 |
| 695.8696267585544 | 54.867 |
| 697.618558529596 | 54.834 |
| 699.374214089151 | 54.8 |
| 701.1366072208507 | 54.767 |
| 702.9057516719264 | 54.735 |
| 704.6816611520228 | 54.702 |
| 706.4643493319996 | 54.67 |
| 708.2538298427212 | 54.638 |
| 710.0501162738335 | 54.606 |
| 711.8532221725299 | 54.574 |
| 713.663161042303 | 54.543 |
| 715.4799463416864 | 54.512 |
| 717.3035914829811 | 54.481 |
| 719.1341098309722 | 54.45 |
| 720.9715147016307 | 54.419 |
| 722.8158193608035 | 54.389 |
| 724.667037022891 | 54.359 |
| 726.5251808495103 | 54.329 |
| 728.3902639481469 | 54.299 |
| 730.2622993707921 | 54.27 |
| 732.141300112568 | 54.24 |
| 734.0272791103389 | 54.211 |
| 735.9202492413086 | 54.182 |
| 737.8202233216056 | 54.154 |
| 739.7272141048529 | 54.125 |
| 741.6412342807263 | 54.097 |
| 743.5622964734965 | 54.069 |
| 745.4904132405594 | 54.041 |
| 747.4255970709511 | 54.014 |
| 749.3678603838492 | 53.987 |
| 751.3172155270605 | 53.96 |
| 753.2736747754933 | 53.933 |
| 755.2372503296164 | 53.906 |
| 757.207954313903 | 53.88 |
| 759.1857987752607 | 53.854 |
| 761.170795681446 | 53.828 |
| 763.1629569194648 | 53.802 |
| 765.1622942939581 | 53.776 |
| 767.1688195255718 | 53.751 |
| 769.182544249313 | 53.726 |
| 771.2034800128897 | 53.701 |
| 773.2316382750369 | 53.677 |
| 775.2670304038255 | 53.652 |
| 777.3096676749578 | 53.628 |
| 779.3595612700462 | 53.604 |
| 781.4167222748766 | 53.581 |
| 783.4811616776567 | 53.557 |
| 785.5528903672476 | 53.534 |
| 787.6319191313808 | 53.511 |
| 789.7182586548577 | 53.489 |
| 791.811919517735 | 53.466 |
| 793.912912193492 | 53.444 |
| 796.0212470471835 | 53.422 |
| 798.1369343335748 | 53.4 |
| 800.2599841952615 | 53.378 |
| 802.3904066607724 | 53.357 |
| 804.5282116426558 | 53.336 |
| 806.6734089355492 | 53.315 |
| 808.8260082142322 | 53.294 |
| 810.9860190316626 | 53.274 |
| 813.153450816996 | 53.254 |
| 815.3283128735877 | 53.234 |
| 817.5106143769777 | 53.214 |
| 819.7003643728591 | 53.195 |
| 821.8975717750286 | 53.176 |
| 824.1022453633198 | 53.157 |
| 826.3143937815191 | 53.138 |
| 828.5340255352646 | 53.12 |
| 830.7611489899264 | 53.101 |
| 832.9957723684697 | 53.084 |
| 835.237903749301 | 53.066 |
| 837.4875510640949 | 53.048 |
| 839.7447220956038 | 53.031 |
| 842.00942447545 | 53.014 |
| 844.281665681899 | 52.997 |
| 846.5614530376146 | 52.981 |
| 848.8487937073968 | 52.965 |
| 851.1436946959001 | 52.949 |
| 853.4461628453342 | 52.933 |
| 855.7562048331461 | 52.917 |
| 858.0738271696832 | 52.902 |
| 860.399036195839 | 52.887 |
| 862.7318380806784 | 52.872 |
| 865.0722388190457 | 52.858 |
| 867.420244229153 | 52.843 |
| 869.7758599501506 | 52.829 |
| 872.1390914396768 | 52.816 |
| 874.5099439713906 | 52.802 |
| 876.888422632484 | 52.789 |
| 879.2745323211755 | 52.776 |
| 881.6682777441848 | 52.763 |
| 884.0696634141879 | 52.751 |
| 886.4786936472524 | 52.738 |
| 888.8953725602544 | 52.726 |
| 891.3197040682753 | 52.715 |
| 893.7516918819795 | 52.703 |
| 896.1913395049716 | 52.692 |
| 898.6386502311354 | 52.681 |
| 901.0936271419528 | 52.67 |
| 903.5562731038017 | 52.66 |
| 906.0265907652363 | 52.65 |
| 908.5045825542458 | 52.64 |
| 910.9902506754945 | 52.63 |
| 913.4835971075413 | 52.621 |
| 915.9846236000395 | 52.612 |
| 918.4933316709167 | 52.603 |
| 921.0097226035346 | 52.594 |
| 923.5337974438288 | 52.586 |
| 926.0655569974289 | 52.578 |
| 928.6050018267576 | 52.57 |
| 931.1521322481111 | 52.563 |
| 933.7069483287177 | 52.556 |
| 936.2694498837776 | 52.549 |
| 938.8396364734821 | 52.542 |
| 941.4175074000119 | 52.536 |
| 944.0030617045164 | 52.529 |
| 946.596298164072 | 52.523 |
| 949.1972152886199 | 52.518 |
| 951.8058113178847 | 52.513 |
| 954.4220842182716 | 52.507 |
| 957.0460316797441 | 52.503 |
| 959.6776511126811 | 52.498 |
| 962.3169396447138 | 52.494 |
| 964.9638941175422 | 52.49 |
| 967.6185110837317 | 52.486 |
| 970.2807868034895 | 52.483 |
| 972.95071724142 | 52.48 |
| 975.6282980632609 | 52.477 |
| 978.3135246325987 | 52.474 |
| 981.0063920075642 | 52.472 |
| 983.7068949375072 | 52.47 |
| 986.4150278596522 | 52.468 |
| 989.1307848957334 | 52.467 |
| 991.8541598486095 | 52.466 |
| 994.5851461988586 | 52.465 |
| 997.3237371013538 | 52.464 |
| 1000.0699253818176 | 52.464 |
| 1002.8237035333577 | 52.464 |
| 1005.5850637129824 | 52.464 |
| 1008.353997738096 | 52.465 |
| 1011.1304970829754 | 52.466 |
| 1013.9145528752256 | 52.467 |
| 1016.7061558922176 | 52.469 |
| 1019.5052965575051 | 52.47 |
| 1022.3119649372225 | 52.472 |
| 1025.1261507364638 | 52.475 |
| 1027.947843295642 | 52.477 |
| 1030.7770315868293 | 52.48 |
| 1033.613704210078 | 52.483 |
| 1036.4578493897234 | 52.487 |
| 1039.309454970667 | 52.491 |
| 1042.168508414641 | 52.495 |
| 1045.0349967964548 | 52.499 |
| 1047.908906800222 | 52.504 |
| 1050.7902247155703 | 52.509 |
| 1053.6789364338322 | 52.514 |
| 1056.575027444218 | 52.52 |
| 1059.4784828299703 | 52.526 |
| 1062.3892872645017 | 52.532 |
| 1065.3074250075135 | 52.539 |
| 1068.2328799010984 | 52.546 |
| 1071.1656353658243 | 52.553 |
| 1074.105674396802 | 52.56 |
| 1077.0529795597356 | 52.568 |
| 1080.0075329869558 | 52.576 |
| 1082.9693163734366 | 52.585 |
| 1085.938310972796 | 52.593 |
| 1088.9144975932797 | 52.602 |
| 1091.8978565937296 | 52.612 |
| 1094.888367879535 | 52.621 |
| 1097.8860108985707 | 52.631 |
| 1100.8907646371165 | 52.642 |
| 1103.9026076157638 | 52.652 |
| 1106.921517885307 | 52.663 |
| 1109.9474730226182 | 52.675 |
| 1112.9804501265105 | 52.686 |
| 1116.0204258135852 | 52.698 |
| 1119.0673762140646 | 52.71 |
| 1122.1212769676122 | 52.723 |
| 1125.18210321914 | 52.736 |
| 1128.2498296146005 | 52.749 |
| 1131.3244302967682 | 52.762 |
| 1134.4058789010076 | 52.776 |
| 1137.4941485510278 | 52.791 |
| 1140.5892118546276 | 52.805 |
| 1143.6910408994272 | 52.82 |
| 1146.7996072485894 | 52.835 |
| 1149.914881936529 | 52.851 |
| 1153.036835464613 | 52.866 |
| 1156.1654377968496 | 52.883 |
| 1159.3006583555675 | 52.899 |
| 1162.4424660170857 | 52.916 |
| 1165.5908291073745 | 52.933 |
| 1168.745715397707 | 52.951 |
| 1171.9070921003038 | 52.969 |
| 1175.0749258639676 | 52.987 |
| 1178.2491827697122 | 53.005 |
| 1181.429828326384 | 53.024 |
| 1184.6168274662755 | 53.043 |
| 1187.8101445407344 | 53.063 |
| 1191.0097433157662 | 53.083 |
| 1194.2155869676308 | 53.103 |
| 1197.4276380784356 | 53.124 |
| 1200.6458586317235 | 53.145 |
| 1203.8702100080568 | 53.166 |
| 1207.1006529805984 | 53.188 |
| 1210.3371477106898 | 53.21 |
| 1213.5796537434267 | 53.232 |
| 1216.8281300032327 | 53.255 |
| 1220.0825347894327 | 53.278 |
| 1223.3428257718242 | 53.302 |
| 1226.6089599862491 | 53.325 |
| 1229.8808938301668 | 53.35 |
| 1233.1585830582262 | 53.374 |
| 1236.4419827778418 | 53.399 |
| 1239.7310474447697 | 53.424 |
| 1243.0257308586888 | 53.45 |
| 1246.325986158783 | 53.476 |
| 1249.6317658193295 | 53.502 |
| 1252.9430216452906 | 53.529 |
| 1256.2597047679117 | 53.556 |
| 1259.5817656403246 | 53.583 |
| 1262.909154033159 | 53.611 |
| 1266.2418190301591 | 53.639 |
| 1269.5797090238113 | 53.668 |
| 1272.922771710978 | 53.697 |
| 1276.2709540885428 | 53.726 |
| 1279.6242024490662 | 53.756 |
| 1282.9824623764507 | 53.786 |
| 1286.3456787416203 | 53.816 |
| 1289.7137956982103 | 53.847 |
| 1293.086756678272 | 53.878 |
| 1296.4645043879912 | 53.91 |
| 1299.8469808034224 | 53.942 |
| 1303.234127166238 | 53.974 |
| 1306.6258839794957 | 54.007 |
| 1310.0221910034213 | 54.04 |
| 1313.4229872512128 | 54.074 |
| 1316.8282109848615 | 54.108 |
| 1320.2377997109952 | 54.142 |
| 1323.6516901767418 | 54.177 |
| 1327.0698183656148 | 54.212 |
| 1330.4921194934225 | 54.247 |
| 1333.9185280042013 | 54.283 |
| 1337.3489775661735 | 54.319 |
| 1340.7834010677313 | 54.356 |
| 1344.2217306134482 | 54.393 |
| 1347.6638975201176 | 54.43 |
| 1351.1098323128217 | 54.468 |
| 1354.559464721029 | 54.506 |
| 1358.012723674724 | 54.545 |
| 1361.4695373005686 | 54.584 |
| 1364.9298329180974 | 54.624 |
| 1368.393537035946 | 54.663 |
| 1371.8605753481165 | 54.704 |
| 1375.3308727302779 | 54.744 |
| 1378.804353236106 | 54.785 |
| 1382.2809400936605 | 54.827 |
| 1385.760555701804 | 54.869 |
| 1389.2431216266593 | 54.911 |
| 1392.7285585981133 | 54.954 |
| 1396.2167865063602 | 54.997 |
| 1399.7077243984932 | 55.041 |
| 1403.2012904751396 | 55.085 |
| 1406.6974020871444 | 55.129 |
| 1410.1959757323034 | 55.174 |
| 1413.6969270521445 | 55.219 |
| 1417.2001708287607 | 55.265 |
| 1420.705620981697 | 55.311 |
| 1424.2131905648885 | 55.358 |
| 1427.7227917636567 | 55.405 |
| 1431.2343358917597 | 55.452 |
| 1434.7477333885022 | 55.5 |
| 1438.2628938159032 | 55.548 |
| 1441.779725855926 | 55.597 |
| 1445.2981373077687 | 55.646 |
| 1448.8180350852197 | 55.695 |
| 1452.3393252140768 | 55.745 |
| 1455.8619128296339 | 55.796 |
| 1459.3857021742344 | 55.847 |
| 1462.9105965948952 | 55.898 |
| 1466.4364985410007 | 55.95 |
| 1469.963309562069 | 56.002 |
| 1473.4909303055933 | 56.055 |
| 1477.0192605149568 | 56.108 |
| 1480.5481990274263 | 56.161 |
| 1484.0776437722234 | 56.215 |
| 1487.6074917686758 | 56.27 |
| 1491.137639124451 | 56.325 |
| 1494.6679810338726 | 56.38 |
| 1498.1984117763218 | 56.436 |
| 1501.7288247147255 | 56.492 |
| 1505.2591122941324 | 56.549 |
| 1508.7891660403789 | 56.606 |
| 1512.3188765588475 | 56.663 |
| 1515.8481335333165 | 56.721 |
| 1519.3768257249062 | 56.78 |
| 1522.9048409711213 | 56.839 |
| 1526.4320661849908 | 56.898 |
| 1529.958387354309 | 56.958 |
| 1533.4836895409776 | 57.019 |
| 1537.007856880451 | 57.079 |
| 1540.5307725812884 | 57.141 |
| 1544.0523189248102 | 57.202 |
| 1547.572377264866 | 57.265 |
| 1551.0908280277115 | 57.327 |
| 1554.6075507119979 | 57.391 |
| 1558.1224238888756 | 57.454 |
| 1561.6353252022147 | 57.518 |
| 1565.146131368942 | 57.583 |
| 1568.6547181794976 | 57.648 |
| 1572.1609604984149 | 57.714 |
| 1575.6647322650203 | 57.78 |
| 1579.1659064942626 | 57.846 |
| 1582.6643552776648 | 57.913 |
| 1586.1599497844081 | 57.981 |
| 1589.652560262545 | 58.049 |
| 1593.142056040345 | 58.117 |
| 1596.6283055277756 | 58.186 |
| 1600.1111762181188 | 58.256 |
| 1603.5905346897257 | 58.325 |
| 1607.0662466079125 | 58.396 |
| 1610.5381767269964 | 58.467 |
| 1614.0061888924772 | 58.538 |
| 1617.4701460433637 | 58.61 |
| 1620.929910214648 | 58.682 |
| 1624.38534253993 | 58.755 |
| 1627.8363032541913 | 58.829 |
| 1631.282651696725 | 58.903 |
| 1634.724246314219 | 58.977 |
| 1638.1609446639975 | 59.052 |
| 1641.5926034174204 | 59.127 |
| 1645.0190783634444 | 59.203 |
| 1648.4402244123469 | 59.279 |
| 1651.8558955996139 | 59.356 |
| 1655.2659450899953 | 59.434 |
| 1658.6702251817278 | 59.512 |
| 1662.068587310929 | 59.59 |
| 1665.4608820561625 | 59.669 |
| 1668.846959143178 | 59.748 |
| 1672.2266674498267 | 59.828 |
| 1675.599855011154 | 59.909 |
| 1678.9663690246728 | 59.99 |
| 1682.3260558558175 | 60.071 |
| 1685.6787610435804 | 60.153 |
| 1689.0243293063338 | 60.235 |
| 1692.362604547839 | 60.318 |
| 1695.6934298634433 | 60.402 |
| 1699.0166475464662 | 60.486 |
| 1702.3320990947798 | 60.571 |
| 1705.6396252175807 | 60.656 |
| 1708.9390658423586 | 60.741 |
| 1712.2302601220608 | 60.827 |
| 1715.5130464424565 | 60.914 |
| 1718.7872624297006 | 61.001 |
| 1722.0527449580995 | 61.089 |
| 1725.3093301580816 | 61.177 |
| 1728.5568534243705 | 61.266 |
| 1731.7951494243678 | 61.355 |
| 1735.024052106742 | 61.445 |
| 1738.2433947102274 | 61.535 |
| 1741.453009772636 | 61.626 |
| 1744.6527291400794 | 61.718 |
| 1747.842383976406 | 61.809 |
| 1751.0218047728547 | 61.902 |
| 1754.1908213579238 | 61.995 |
| 1757.3492629074588 | 62.088 |
| 1760.4969579549588 | 62.182 |
| 1763.633734402106 | 62.277 |
| 1766.7594195295144 | 62.372 |
| 1769.8738400077025 | 62.468 |
| 1772.9768219082912 | 62.564 |
| 1776.0681907154265 | 62.661 |
| 1779.147771337428 | 62.758 |
| 1782.2153881186662 | 62.856 |
| 1785.2708648516677 | 62.954 |
| 1788.3140247894494 | 63.053 |
| 1791.3446906580834 | 63.152 |
| 1794.3626846694945 | 63.252 |
| 1797.3678285344865 | 63.353 |
| 1800.3599434760056 | 63.454 |
| 1803.338850242633 | 63.555 |
| 1806.3043691223152 | 63.658 |
| 1809.2563199563267 | 63.76 |
| 1812.1945221534697 | 63.863 |
| 1815.1187947045084 | 63.967 |
| 1818.0289561968411 | 64.071 |
| 1820.924824829407 | 64.176 |
| 1823.8062184278322 | 64.282 |
| 1826.6729544598113 | 64.387 |
| 1829.524850050728 | 64.494 |
| 1832.3617219995122 | 64.601 |
| 1835.1833867947353 | 64.708 |
| 1837.9896606309442 | 64.817 |
| 1840.7803594252316 | 64.925 |
| 1843.555298834045 | 65.034 |
| 1846.3142942702334 | 65.144 |
| 1849.0571609203298 | 65.254 |
| 1851.783713762073 | 65.365 |
| 1854.4937675821634 | 65.477 |
| 1857.1871369942576 | 65.588 |
| 1859.863636457196 | 65.701 |
| 1862.5230802934677 | 65.814 |
| 1865.1652827079079 | 65.927 |
| 1867.7900578066296 | 66.041 |
| 1870.3972196161892 | 66.156 |
| 1872.986582102981 | 66.271 |
| 1875.5579591928656 | 66.387 |
| 1878.1111647910266 | 66.503 |
| 1880.6460128020549 | 66.62 |
| 1883.1623171502624 | 66.737 |
| 1885.6598918002203 | 66.855 |
| 1888.1385507775221 | 66.974 |
| 1890.59810818977 | 67.093 |
| 1893.0383782477827 | 67.212 |
| 1895.4591752870222 | 67.332 |
| 1897.8603137892396 | 67.453 |
| 1900.2416084043368 | 67.574 |
| 1902.6028739724416 | 67.696 |
| 1904.9439255461955 | 67.818 |
| 1907.2645784132515 | 67.94 |
| 1909.5646481189788 | 68.064 |
| 1911.8439504893738 | 68.188 |
| 1914.1023016541735 | 68.312 |
| 1916.339518070169 | 68.437 |
| 1918.5554165447172 | 68.562 |
| 1920.7498142594463 | 68.688 |
| 1922.9225287941556 | 68.815 |
| 1925.0733781509018 | 68.942 |
| 1927.2021807782735 | 69.069 |
| 1929.3087555958473 | 69.197 |
| 1931.3929220188243 | 69.326 |
| 1933.4544999828427 | 69.455 |
| 1935.4933099689636 | 69.585 |
| 1937.5091730288252 | 69.715 |
| 1939.5019108099639 | 69.846 |
| 1941.4713455812957 | 69.977 |
| 1943.417300258758 | 70.109 |
| 1945.3395984311016 | 70.241 |
| 1947.2380643858373 | 70.374 |
| 1949.1125231353237 | 70.507 |
| 1950.9628004429994 | 70.641 |
| 1952.7887228497511 | 70.775 |
| 1954.5901177004137 | 70.91 |
| 1956.366813170399 | 71.046 |
| 1958.1186382924468 | 71.181 |
| 1959.8454229834952 | 71.318 |
| 1961.5469980716625 | 71.455 |
| 1963.223195323339 | 71.592 |
| 1964.8738474703812 | 71.73 |
| 1966.498788237403 | 71.868 |
| 1968.0978523691608 | 72.007 |
| 1969.6708756580244 | 72.147 |
| 1971.2176949715292 | 72.287 |
| 1972.7381482800051 | 72.427 |
| 1974.2320746842743 | 72.568 |
| 1975.6993144434127 | 72.709 |
| 1977.1397090025712 | 72.851 |
| 1978.5531010208463 | 72.994 |
| 1979.9393343991983 | 73.137 |
| 1981.2982543084083 | 73.28 |
| 1982.6297072170678 | 73.424 |
| 1983.9335409195953 | 73.568 |
| 1985.209604564273 | 73.713 |
| 1986.4577486812955 | 73.858 |
| 1987.677825210827 | 74.004 |
| 1988.8696875310563 | 74.15 |
| 1990.0331904862458 | 74.297 |
| 1991.1681904147642 | 74.444 |
| 1992.2745451771007 | 74.591 |
| 1993.3521141838476 | 74.739 |
| 1994.4007584236485 | 74.888 |
| 1995.420340491103 | 75.037 |
| 1996.410724614619 | 75.186 |
| 1997.37177668421 | 75.336 |
| 1998.3033642792227 | 75.486 |
| 1999.2053566959926 | 75.637 |
| 2000.0776249754192 | 75.788 |
| 2000.9200419304502 | 75.94 |
| 2001.7324821734694 | 76.092 |
| 2002.5148221435795 | 76.244 |
| 2003.266940133772 | 76.397 |
| 2003.988716317976 | 76.55 |
| 2004.6800327779763 | 76.704 |
| 2005.3407735301964 | 76.858 |
| 2005.9708245523348 | 77.013 |
| 2006.5700738098462 | 77.168 |
| 2007.1384112822625 | 77.323 |
| 2007.6757289893412 | 77.479 |
| 2008.1819210170365 | 77.635 |
| 2008.656883543282 | 77.791 |
| 2009.100514863577 | 77.948 |
| 2009.5127154163697 | 78.106 |
| 2009.8933878082262 | 78.263 |
| 2010.2424368387785 | 78.421 |
| 2010.5597695254435 | 78.58 |
| 2010.8452951279007 | 78.739 |
| 2011.0989251723256 | 78.898 |
| 2011.3205734753656 | 79.057 |
| 2011.5101561678514 | 79.217 |
| 2011.667591718237 | 79.378 |
| 2011.792800955756 | 79.538 |
| 2011.8857070932893 | 79.699 |
| 2011.9462357499328 | 79.86 |
| 2011.9743149732592 | 80.022 |
| 2011.9698752612626 | 80.184 |
| 2011.9328495839798 | 80.346 |
| 2011.8631734047776 | 80.509 |
| 2011.7607847013 | 80.672 |
| 2011.6256239860647 | 80.835 |
| 2011.4576343267024 | 80.999 |
| 2011.2567613658284 | 81.162 |
| 2011.0229533405409 | 81.327 |
| 2010.7561611015353 | 81.491 |
| 2010.4563381318283 | 81.656 |
| 2010.1234405650814 | 81.821 |
| 2009.7574272035192 | 81.986 |
| 2009.35825953543 | 82.152 |
| 2008.9259017522454 | 82.318 |
| 2008.4603207651874 | 82.484 |
| 2007.9614862214783 | 82.65 |
| 2007.429370520103 | 82.817 |
| 2006.8639488271183 | 82.984 |
| 2006.2651990905 | 83.151 |
| 2005.6331020545224 | 83.318 |
| 2004.967641273662 | 83.486 |
| 2004.2688031260159 | 83.653 |
| 2003.5365768262336 | 83.821 |
| 2002.7709544379497 | 83.99 |
| 2001.971930885713 | 84.158 |
| 2001.1395039664058 | 84.327 |
| 2000.273674360147 | 84.496 |
| 1999.3744456406705 | 84.665 |
| 1998.4418242851755 | 84.834 |
| 1997.4758196836406 | 85.003 |
| 1996.4764441475966 | 85.173 |
| 1995.4437129183527 | 85.343 |
| 1994.3776441746695 | 85.512 |
| 1993.2782590398729 | 85.682 |
| 1992.145581588406 | 85.853 |
| 1990.9796388518116 | 86.023 |
| 1989.7804608241413 | 86.194 |
| 1988.5480804667857 | 86.364 |
| 1987.2825337127226 | 86.535 |
| 1985.9838594701773 | 86.706 |
| 1984.6520996256916 | 86.877 |
| 1983.2872990465971 | 87.048 |
| 1981.8895055828896 | 87.219 |
| 1980.4587700685001 | 87.39 |
| 1978.99514632196 | 87.562 |
| 1977.4986911464557 | 87.733 |
| 1975.9694643292721 | 87.905 |
| 1974.4075286406198 | 88.076 |
| 1972.812949831845 | 88.248 |
| 1971.1857966330174 | 88.42 |
| 1969.5261407498997 | 88.591 |
| 1967.834056860288 | 88.763 |
| 1966.1096226097297 | 88.935 |
| 1964.352918606613 | 89.107 |
| 1962.5640284166266 | 89.279 |
| 1960.743038556592 | 89.45 |
| 1958.8900384876638 | 89.622 |
| 1957.0051206078997 | 89.794 |
| 1955.088380244199 | 89.966 |
| 1953.13991564361 | 90.138 |
| 1951.1598279640075 | 90.31 |
| 1949.1482212641372 | 90.482 |
| 1947.105202493033 | 90.653 |
| 1945.0308814788036 | 90.825 |
| 1942.9253709167917 | 90.997 |
| 1940.7887863571073 | 91.168 |
| 1938.621246191535 | 91.34 |
| 1936.4228716398204 | 91.511 |
| 1934.1937867353342 | 91.683 |
| 1931.9341183101192 | 91.854 |
| 1929.6439959793202 | 92.025 |
| 1927.3235521250028 | 92.196 |
| 1924.972921879362 | 92.367 |
| 1922.5922431073247 | 92.538 |
| 1920.1816563885486 | 92.709 |
| 1917.7413049988245 | 92.88 |
| 1915.2713348908821 | 93.05 |
| 1912.7718946746065 | 93.22 |
| 1910.2431355966694 | 93.391 |
| 1907.6852115195786 | 93.561 |
| 1905.0982789001525 | 93.73 |
| 1902.482496767424 | 93.9 |
| 1899.83802669998 | 94.07 |
| 1897.1650328027408 | 94.239 |
| 1894.4636816831883 | 94.408 |
| 1891.7341424270448 | 94.577 |
| 1888.9765865734148 | 94.746 |
| 1886.1911880893897 | 94.914 |
| 1883.3781233441282 | 95.082 |
| 1880.5375710824167 | 95.25 |
| 1877.669712397716 | 95.418 |
| 1874.7747307047057 | 95.585 |
| 1871.8528117113292 | 95.753 |
| 1868.9041433903515 | 95.92 |
| 1865.9289159504347 | 96.086 |
| 1862.9273218067426 | 96.253 |
| 1859.89955555108 | 96.419 |
| 1856.8458139215777 | 96.585 |
| 1853.7662957719303 | 96.75 |
| 1850.6612020401983 | 96.915 |
| 1847.5307357171803 | 97.08 |
| 1844.3751018143682 | 97.245 |
| 1841.194507331494 | 97.409 |
| 1837.9891612236752 | 97.573 |
| 1834.759274368174 | 97.736 |
| 1831.5050595307748 | 97.9 |
| 1828.2267313317955 | 98.062 |
| 1824.9245062117373 | 98.225 |
| 1821.5986023965895 | 98.387 |
| 1818.2492398627955 | 98.549 |
| 1814.8766403018922 | 98.71 |
| 1811.481027084834 | 98.871 |
| 1808.0626252260129 | 99.031 |
| 1804.6216613469837 | 99.191 |
| 1801.1583636399087 | 99.351 |
| 1797.6729618307286 | 99.51 |
| 1794.165687142077 | 99.669 |
| 1790.6367722559455 | 99.827 |
| 1787.086451276111 | 99.985 |
| 1783.5149596903395 | 100.142 |
| 1779.922534332378 | 100.299 |
| 1776.3094133437419 | 100.456 |
| 1772.675836135315 | 100.612 |
| 1769.0220433487716 | 100.767 |
| 1765.3482768178324 | 100.922 |
| 1761.654779529367 | 101.077 |
| 1757.9417955843544 | 101.231 |
| 1754.209570158714 | 101.384 |
| 1750.4583494640187 | 101.537 |
| 1746.6883807081024 | 101.689 |
| 1742.8999120555739 | 101.841 |
| 1739.0931925882496 | 101.993 |
| 1735.2684722655165 | 102.143 |
| 1731.4260018846373 | 102.294 |
| 1727.5660330410117 | 102.443 |
| 1723.6888180884025 | 102.592 |
| 1719.7946100991414 | 102.741 |
| 1715.8836628243255 | 102.889 |
| 1711.9562306540151 | 103.036 |
| 1708.012568577448 | 103.183 |
| 1704.0529321432775 | 103.329 |
| 1700.07757741985 | 103.474 |
| 1696.0867609555319 | 103.619 |
| 1692.0807397390968 | 103.763 |
| 1688.059771160187 | 103.907 |
| 1684.0241129698577 | 104.05 |
| 1679.974023241218 | 104.192 |
| 1675.9097603301777 | 104.334 |
| 1671.8315828363131 | 104.475 |
| 1667.7397495638616 | 104.616 |
| 1663.6345194828557 | 104.755 |
| 1659.5161516904095 | 104.894 |
| 1655.384905372166 | 105.033 |
| 1651.241039763917 | 105.17 |
| 1647.0848141134045 | 105.307 |
| 1642.916487642319 | 105.444 |
| 1638.736319508497 | 105.579 |
| 1634.5445687683348 | 105.714 |
| 1630.3414943394255 | 105.848 |
| 1626.1273549634284 | 105.982 |
| 1621.9024091691822 | 106.114 |
| 1617.6669152360707 | 106.246 |
| 1613.4211311576505 | 106.378 |
| 1609.1653146055485 | 106.508 |
| 1604.8997228936419 | 106.638 |
| 1600.6246129425244 | 106.767 |
| 1596.3402412442724 | 106.895 |
| 1592.0468638275152 | 107.023 |
| 1587.7447362228213 | 107.149 |
| 1583.4341134284064 | 107.275 |
| 1579.115249876172 | 107.4 |
| 1574.788399398082 | 107.525 |
| 1570.4538151928866 | 107.648 |
| 1566.1117497931969 | 107.771 |
| 1561.7624550329222 | 107.893 |
| 1557.4061820150741 | 108.015 |
| 1553.043181079944 | 108.135 |
| 1548.6737017736623 | 108.255 |
| 1544.2979928171449 | 108.373 |
| 1539.9163020754322 | 108.491 |
| 1535.528876527429 | 108.608 |
| 1531.1359622360483 | 108.725 |
| 1526.7378043187662 | 108.84 |
| 1522.3346469185935 | 108.955 |
| 1517.9267331754684 | 109.069 |
| 1513.5143051980751 | 109.182 |
| 1509.0976040360943 | 109.294 |
| 1504.6768696528884 | 109.405 |
| 1500.2523408986274 | 109.516 |
| 1495.8242554838587 | 109.625 |
| 1491.3928499535245 | 109.734 |
| 1486.9583596614316 | 109.842 |
| 1482.5210187451758 | 109.949 |
| 1478.081060101525 | 110.055 |
| 1473.638715362265 | 110.16 |
| 1469.1942148705075 | 110.264 |
| 1464.7477876574671 | 110.368 |
| 1460.2996614197077 | 110.47 |
| 1455.8500624968601 | 110.572 |
| 1451.3992158498143 | 110.673 |
| 1446.9473450393868 | 110.773 |
| 1442.494672205467 | 110.872 |
| 1438.0414180466396 | 110.97 |
| 1433.587801800291 | 111.067 |
| 1429.1340412231934 | 111.164 |
| 1424.6803525725743 | 111.259 |
| 1420.2269505876654 | 111.353 |
| 1415.774048471738 | 111.447 |
| 1411.3218578746203 | 111.54 |
| 1406.870588875698 | 111.631 |
| 1402.420449967401 | 111.722 |
| 1397.9716480391703 | 111.812 |
| 1393.52438836191 | 111.901 |
| 1389.078874572922 | 111.989 |
| 1384.6353086613199 | 112.076 |
| 1380.1938909539267 | 112.163 |
| 1375.75482010165 | 112.248 |
| 1371.3182930663352 | 112.332 |
| 1366.8845051080973 | 112.416 |
| 1362.4536497731265 | 112.498 |
| 1358.025918881967 | 112.58 |
| 1353.601502518269 | 112.66 |
| 1349.1805890180074 | 112.74 |
| 1344.7633649591708 | 112.819 |
| 1340.3500151519129 | 112.897 |
| 1335.9407226291676 | 112.973 |
| 1331.5356686377222 | 113.049 |
| 1327.13503262975 | 113.124 |
| 1322.7389922547939 | 113.198 |
| 1318.3477233522033 | 113.271 |
| 1313.961399944017 | 113.343 |
| 1309.5801942282917 | 113.415 |
| 1305.20427657287 | 113.485 |
| 1300.833815509588 | 113.554 |
| 1296.4689777289148 | 113.622 |
| 1292.109928075022 | 113.69 |
| 1287.7568295412811 | 113.756 |
| 1283.409843266181 | 113.822 |
| 1279.0691285296646 | 113.886 |
| 1274.7348427498794 | 113.95 |
| 1270.407141480337 | 114.012 |
| 1266.086178407479 | 114.074 |
| 1261.7721053486428 | 114.135 |
| 1257.4650722504232 | 114.195 |
| 1253.1652271874275 | 114.253 |
| 1248.8727163614162 | 114.311 |
| 1244.5876841008264 | 114.368 |
| 1240.3102728606725 | 114.424 |
| 1236.0406232228195 | 114.479 |
| 1231.7788738966242 | 114.533 |
| 1227.5251617199385 | 114.586 |
| 1223.2796216604704 | 114.638 |
| 1219.0423868174976 | 114.69 |
| 1214.813588423928 | 114.74 |
| 1210.593355848702 | 114.789 |
| 1206.3818165995328 | 114.837 |
| 1202.1790963259766 | 114.885 |
| 1197.985318822829 | 114.931 |
| 1193.800606033843 | 114.977 |
| 1189.6250780557627 | 115.021 |
| 1185.4588531426648 | 115.065 |
| 1181.302047710606 | 115.108 |
| 1177.15477634257 | 115.149 |
| 1173.0171517937054 | 115.19 |
| 1168.8892849968545 | 115.23 |
| 1164.7712850683627 | 115.269 |
| 1160.6632593141642 | 115.307 |
| 1156.5653132361408 | 115.344 |
| 1152.4775505387447 | 115.38 |
| 1148.4000731358824 | 115.415 |
| 1144.3329811580525 | 115.45 |
| 1140.2763729597332 | 115.483 |
| 1136.2303451270127 | 115.515 |
| 1132.1949924854575 | 115.547 |
| 1128.1704081082135 | 115.577 |
| 1124.1566833243323 | 115.607 |
| 1120.1539077273217 | 115.636 |
| 1116.1621691839089 | 115.663 |
| 1112.1815538430155 | 115.69 |
| 1108.2121461449376 | 115.716 |
| 1104.2540288307237 | 115.741 |
| 1100.3072829517482 | 115.765 |
| 1096.3719878794727 | 115.789 |
| 1092.4482213153897 | 115.811 |
| 1088.536059301145 | 115.832 |
| 1084.635576228833 | 115.853 |
| 1080.7468448514578 | 115.872 |
| 1076.8699362935567 | 115.891 |
| 1073.0049200619817 | 115.909 |
| 1069.1518640568302 | 115.926 |
| 1065.3108345825244 | 115.942 |
| 1061.4818963590305 | 115.957 |
| 1057.665112533215 | 115.971 |
| 1053.8605446903316 | 115.985 |
| 1050.0682528656348 | 115.997 |
| 1046.2882955561147 | 116.009 |
| 1042.5207297323484 | 116.02 |
| 1038.765610850463 | 116.029 |
| 1035.0229928642052 | 116.038 |
| 1031.2929282371138 | 116.047 |
| 1027.5754679547886 | 116.054 |
| 1023.870661537253 | 116.06 |
| 1020.1785570514046 | 116.066 |
| 1016.4992011235495 | 116.07 |
| 1012.8326389520159 | 116.074 |
| 1009.1789143198428 | 116.077 |
| 1005.5380696075385 | 116.079 |
| 1001.9101458059068 | 116.081 |
| 998.2951825289335 | 116.081 |
| 994.693218026732 | 116.081 |
| 991.1042891985416 | 116.08 |
| 987.5284316057763 | 116.077 |
| 983.965679485119 | 116.075 |
| 980.416065761657 | 116.071 |
| 976.8796220620557 | 116.066 |
| 973.3563787277657 | 116.061 |
| 969.8463648282614 | 116.055 |
| 966.3496081743046 | 116.048 |
| 962.8661353312322 | 116.04 |
| 959.395971632262 | 116.031 |
| 955.9391411918156 | 116.022 |
| 952.4956669188526 | 116.012 |
| 949.0655705302146 | 116.001 |
| 945.6488725639737 | 115.989 |
| 942.2455923927846 | 115.976 |
| 938.8557482372349 | 115.963 |
| 935.4793571791921 | 115.949 |
| 932.1164351751426 | 115.934 |
| 928.7669970695214 | 115.918 |
| 925.4310566080288 | 115.901 |
| 922.1086264509306 | 115.884 |
| 918.7997181863394 | 115.866 |
| 915.5043423434751 | 115.847 |
| 912.2225084059003 | 115.828 |
| 908.9542248247295 | 115.807 |
| 905.6994990318082 | 115.786 |
| 902.45833745286 | 115.764 |
| 899.2307455205995 | 115.742 |
| 896.016727687808 | 115.719 |
| 892.8162874403699 | 115.694 |
| 889.6294273102674 | 115.67 |
| 886.4561488885316 | 115.644 |
| 883.2964528381478 | 115.618 |
| 880.150338906912 | 115.591 |
| 877.0178059402372 | 115.563 |
| 873.8988518939086 | 115.535 |
| 870.7934738467834 | 115.506 |
| 867.7016680134349 | 115.476 |
| 864.6234297567389 | 115.445 |
| 861.5587536004007 | 115.414 |
| 858.5076332414195 | 115.382 |
| 855.4700615624911 | 115.349 |
| 852.4460306443448 | 115.316 |
| 849.4355317780147 | 115.282 |
| 846.4385554770425 | 115.247 |
| 843.455091489612 | 115.212 |
| 840.4851288106113 | 115.176 |
| 837.5286556936248 | 115.139 |
| 834.5856596628502 | 115.102 |
| 831.6561275249412 | 115.064 |
| 828.7400453807753 | 115.025 |
| 825.8373986371428 | 114.985 |
| 822.9481720183588 | 114.945 |
| 820.0723495777955 | 114.905 |
| 817.209914709334 | 114.863 |
| 814.3608501587348 | 114.821 |
| 811.525138034926 | 114.779 |
| 808.7027598212085 | 114.735 |
| 805.8936963863766 | 114.692 |
| 803.0979279957543 | 114.647 |
| 800.315434322145 | 114.602 |
| 797.546194456696 | 114.556 |
| 794.7901869196744 | 114.51 |
| 792.0473896711567 | 114.463 |
| 789.3177801216284 | 114.415 |
| 786.601335142496 | 114.367 |
| 783.8980310765087 | 114.318 |
| 781.2078437480895 | 114.269 |
| 778.5307484735771 | 114.219 |
| 775.8667200713754 | 114.168 |
| 773.2157328720126 | 114.117 |
| 770.5777607281078 | 114.065 |
| 767.952777024246 | 114.013 |
| 765.3407546867602 | 113.96 |
| 762.7416661934213 | 113.906 |
| 760.1554835830347 | 113.852 |
| 757.5821784649432 | 113.798 |
| 755.0217220284381 | 113.743 |
| 752.4740850520751 | 113.687 |
| 749.9392379128975 | 113.631 |
| 747.4171505955654 | 113.574 |
| 744.9077927013914 | 113.516 |
| 742.4111334572816 | 113.458 |
| 739.9271417245842 | 113.4 |
| 737.4557860078426 | 113.341 |
| 734.9970344634557 | 113.281 |
| 732.5508549082446 | 113.221 |
| 730.1172148279244 | 113.161 |
| 727.6960813854841 | 113.1 |
| 725.2874214294718 | 113.038 |
| 722.8912015021866 | 112.976 |
| 720.5073878477785 | 112.913 |
| 718.1359464202542 | 112.85 |
| 715.7768428913904 | 112.787 |
| 713.4300426585553 | 112.723 |
| 711.0955108524369 | 112.658 |
| 708.7732123446801 | 112.593 |
| 706.4631117554318 | 112.527 |
| 704.165173460794 | 112.461 |
| 701.8793616001874 | 112.395 |
| 699.6056400836226 | 112.328 |
| 697.3439725988817 | 112.26 |
| 695.0943226186104 | 112.192 |
| 692.8566534073193 | 112.124 |
| 690.630928028297 | 112.055 |
| 688.417109350434 | 111.986 |
| 686.2151600549579 | 111.916 |
| 684.0250426420816 | 111.846 |
| 681.846719437563 | 111.775 |
| 679.6801525991783 | 111.704 |
| 677.5253041231084 | 111.632 |
| 675.3821358502396 | 111.56 |
| 673.2506094723786 | 111.488 |
| 671.1306865383824 | 111.415 |
| 669.0223284602034 | 111.342 |
| 666.9254965188516 | 111.268 |
| 664.8401518702714 | 111.194 |
| 662.7662555511376 | 111.119 |
| 660.703768484568 | 111.044 |
| 658.6526514857535 | 110.969 |
| 656.6128652675087 | 110.893 |
| 654.5843704457405 | 110.817 |
| 652.5671275448371 | 110.741 |
| 650.5610970029775 | 110.664 |
| 648.5662391773619 | 110.586 |
| 646.5825143493648 | 110.509 |
| 644.6098827296089 | 110.43 |
| 642.6483044629632 | 110.352 |
| 640.6977396334642 | 110.273 |
| 638.7581482691611 | 110.194 |
| 636.8294903468867 | 110.114 |
| 634.9117257969524 | 110.034 |
| 633.0048145077706 | 109.954 |
| 631.1087163304029 | 109.873 |
| 629.2233910830366 | 109.792 |
| 627.3487985553883 | 109.711 |
| 625.4848985130365 | 109.629 |
| 623.631650701684 | 109.547 |
| 621.7890148513497 | 109.464 |
| 619.9569506804914 | 109.382 |
| 618.1354179000593 | 109.298 |
| 616.3243762174825 | 109.215 |
| 614.523785340587 | 109.131 |
| 612.7336049814477 | 109.047 |
| 610.9537948601742 | 108.963 |
| 609.1843147086308 | 108.878 |
| 607.4251242740926 | 108.793 |
| 605.6761833228361 | 108.707 |
| 603.9374516436682 | 108.622 |
| 602.2088890513908 | 108.536 |
| 600.4904553902045 | 108.449 |
| 598.7821105370499 | 108.363 |
| 597.083814404889 | 108.276 |
| 595.3955269459258 | 108.188 |
| 593.7172081547676 | 108.101 |
| 592.0488180715281 | 108.013 |
| 590.3903167848713 | 107.925 |
| 588.7416644349986 | 107.836 |
| 587.102821216579 | 107.748 |
| 585.4737473816228 | 107.659 |
| 583.8544032423006 | 107.569 |
| 582.2447491737055 | 107.48 |
| 580.6447456165633 | 107.39 |
| 579.0543530798881 | 107.3 |
| 577.4735321435838 | 107.21 |
| 575.9022434609957 | 107.119 |
| 574.3404477614079 | 107.028 |
| 572.7881058524912 | 106.937 |
| 571.2451786227002 | 106.846 |
| 569.7116270436202 | 106.754 |
| 568.1874121722649 | 106.662 |
| 566.672495153326 | 106.57 |
| 565.1668372213746 | 106.478 |
| 563.6703997030147 | 106.385 |
| 562.1831440189907 | 106.292 |
| 560.7050316862484 | 106.199 |
| 559.2360243199503 | 106.106 |
| 557.7760836354462 | 106.012 |
| 556.3251714501992 | 105.919 |
| 554.8832496856678 | 105.825 |
| 553.4502803691456 | 105.73 |
| 552.0262256355571 | 105.636 |
| 550.6110477292124 | 105.541 |
| 549.2047090055202 | 105.447 |
| 547.8071719326596 | 105.351 |
| 546.4183990932121 | 105.256 |
| 545.0383531857533 | 105.161 |
| 543.6669970264055 | 105.065 |
| 542.304293550352 | 104.969 |
| 540.9502058133126 | 104.873 |
| 539.6046969929819 | 104.777 |
| 538.2677303904309 | 104.68 |
| 536.9392694314711 | 104.584 |
| 535.6192776679839 | 104.487 |
| 534.307718779213 | 104.39 |
| 533.0045565730236 | 104.293 |
| 531.7097549871255 | 104.195 |
| 530.4232780902635 | 104.098 |
| 529.1450900833735 | 104 |
| 527.8751553007065 | 103.902 |
| 526.61343821092 | 103.804 |
| 525.3599034181364 | 103.705 |
| 524.1145156629716 | 103.607 |
| 522.8772398235318 | 103.508 |
| 521.6480409163795 | 103.41 |
| 520.4268840974703 | 103.311 |
| 519.2137346630595 | 103.212 |
| 518.0085580505804 | 103.112 |
| 516.8113198394927 | 103.013 |
| 515.6219857521044 | 102.913 |
| 514.4405216543643 | 102.814 |
| 513.2668935566289 | 102.714 |
| 512.1010676144012 | 102.614 |
| 510.9430101290438 | 102.514 |
| 509.79268754846544 | 102.413 |
| 508.65006646778306 | 102.313 |
| 507.51511362995774 | 102.212 |
| 506.3877959264064 | 102.112 |
| 505.2680803975893 | 102.011 |
| 504.15593423357336 | 101.91 |
| 503.05132477457255 | 101.809 |
| 501.95421951146466 | 101.708 |
| 500.8645860862858 | 101.607 |
| 499.7823922927024 | 101.505 |
| 498.70760607646173 | 101.404 |
| 497.64019553582017 | 101.302 |
| 496.5801289219512 | 101.2 |
| 495.5273746393321 | 101.098 |
| 494.4819012461105 | 100.996 |
| 493.4436774544507 | 100.894 |
| 492.41267213086076 | 100.792 |
| 491.38885429649963 | 100.69 |
| 490.3721931274661 | 100.587 |
| 489.3626579550685 | 100.485 |
| 488.3602182660765 | 100.382 |
| 487.3648437029549 | 100.279 |
| 486.3765040640797 | 100.176 |
| 485.39516930393734 | 100.074 |
| 484.4208095333062 | 99.971 |
| 483.4533950194226 | 99.867 |
| 482.49289618612937 | 99.764 |
| 481.53928361400926 | 99.661 |
| 480.59252804050226 | 99.558 |
| 479.65260036000785 | 99.454 |
| 478.71947162397186 | 99.351 |
| 477.79311304095876 | 99.247 |
| 476.87349597670953 | 99.144 |
| 475.96059195418513 | 99.04 |
| 475.05437265359626 | 98.936 |
| 474.1548099124195 | 98.832 |
| 473.2618757254001 | 98.728 |
| 472.37554224454135 | 98.624 |
| 471.49578177908194 | 98.52 |
| 470.62256679545993 | 98.416 |
| 469.7558699172651 | 98.312 |
| 468.89566392517895 | 98.208 |
| 468.041921756903 | 98.103 |
| 467.1946165070758 | 97.999 |
| 466.3537214271784 | 97.894 |
| 465.5192099254291 | 97.79 |
| 464.69105556666705 | 97.685 |
| 463.8692320722258 | 97.581 |
| 463.0537133197964 | 97.476 |
| 462.24447334328 | 97.371 |
| 461.44148633263154 | 97.267 |
| 460.6447266336928 | 97.162 |
| 459.85416874801695 | 97.057 |
| 459.06978733268323 | 96.952 |
| 458.29155720010334 | 96.847 |
| 457.51945331781855 | 96.743 |
| 456.75345080828856 | 96.638 |
| 455.9935249486719 | 96.533 |
| 455.23965117059845 | 96.428 |
| 454.4918050599337 | 96.322 |
| 453.74996235653555 | 96.217 |
| 453.01409895400343 | 96.112 |
| 452.28419089942025 | 96.007 |
| 451.5602143930869 | 95.902 |
| 450.84214578825015 | 95.797 |
| 450.1299615908235 | 95.692 |
| 449.42363845910137 | 95.586 |
| 448.7231532034673 | 95.481 |
| 448.02848278609525 | 95.376 |
| 447.3396043206453 | 95.27 |
| 446.6564950719534 | 95.165 |
| 445.9791324557148 | 95.06 |
| 445.3074940381629 | 94.955 |
| 444.6415575357415 | 94.849 |
| 443.9813008147729 | 94.744 |
| 443.32670189111997 | 94.638 |
| 442.67773892984366 | 94.533 |
| 442.03439024485584 | 94.428 |
| 441.39663429856716 | 94.322 |
| 440.76444970153045 | 94.217 |
| 440.1378152120799 | 94.112 |
| 439.5167097359657 | 94.006 |
| 438.901112325985 | 93.901 |
| 438.2910021816084 | 93.795 |
| 437.68635864860306 | 93.69 |
| 437.0871612186517 | 93.585 |
| 436.4933895289684 | 93.479 |
| 435.90502336191065 | 93.374 |
| 435.3220426445881 | 93.269 |
| 434.7444274484684 | 93.163 |
| 434.17215798897956 | 93.058 |
| 433.6052146251095 | 92.953 |
| 433.04357785900294 | 92.847 |
| 432.48722833555513 | 92.742 |
| 431.9361468420034 | 92.637 |
| 431.39031430751584 | 92.532 |
| 430.84971180277773 | 92.426 |
| 430.31432053957576 | 92.321 |
| 429.7841218703798 | 92.216 |
| 429.25909728792277 | 92.111 |
| 428.73922842477833 | 92.006 |
| 428.22449705293695 | 91.901 |
| 427.71488508337995 | 91.795 |
| 427.2103745656519 | 91.69 |
| 426.71094768743114 | 91.585 |
| 426.21658677409954 | 91.48 |
| 425.7272742883098 | 91.375 |
| 425.2429928295522 | 91.27 |
| 424.7637251337197 | 91.166 |
| 424.2894540726719 | 91.061 |
| 423.8201626537982 | 90.956 |
| 423.3558340195794 | 90.851 |
| 422.8964514471489 | 90.746 |
| 422.4419983478527 | 90.641 |
| 421.9924582668088 | 90.537 |
| 421.54781488246584 | 90.432 |
| 421.1080520061611 | 90.327 |
| 420.6731535816778 | 90.223 |
| 420.24310368480235 | 90.118 |
| 419.8178865228807 | 90.014 |
| 419.3974864343745 | 89.909 |
| 418.9818878884172 | 89.805 |
| 418.57107548436943 | 89.701 |
| 418.1650339513749 | 89.596 |
| 417.7637481479155 | 89.492 |
| 417.3672030613671 | 89.388 |
| 416.97538380755446 | 89.284 |
| 416.5882756303073 | 89.18 |
| 416.2058639010156 | 89.076 |
| 415.82813411818574 | 88.972 |
| 415.45507190699635 | 88.868 |
| 415.08666301885495 | 88.764 |
| 414.72289333095466 | 88.66 |
| 414.3637488458314 | 88.556 |
| 414.0092156909218 | 88.452 |
| 413.659280118121 | 88.349 |
| 413.31392850334174 | 88.245 |
| 412.9731473460735 | 88.142 |
| 412.6369232689427 | 88.038 |
| 412.30524301727326 | 87.935 |
| 411.9780934586481 | 87.831 |
| 411.65546158247145 | 87.728 |
| 411.33733449953183 | 87.625 |
| 411.0236994415661 | 87.522 |
| 410.7145437608242 | 87.419 |
| 410.40985492963495 | 87.315 |
| 410.1096205399729 | 87.213 |
| 409.81382830302624 | 87.11 |
| 409.5224660487653 | 87.007 |
| 409.2355217255128 | 86.904 |
| 408.9529833995149 | 86.801 |
| 408.6748392545134 | 86.699 |
| 408.4010775913192 | 86.596 |
| 408.1316868273869 | 86.494 |
| 407.8666554963907 | 86.391 |
| 407.6059722478018 | 86.289 |
| 407.34962584646667 | 86.187 |
| 407.0976051721872 | 86.085 |
| 406.8498992193015 | 85.983 |
| 406.60649709626716 | 85.881 |
| 406.36738802524474 | 85.779 |
| 406.13256134168347 | 85.677 |
| 405.90200649390846 | 85.575 |
| 405.6757130427089 | 85.473 |
| 405.4536706609281 | 85.372 |
| 405.23586913305525 | 85.27 |
| 405.0222983548184 | 85.169 |
| 404.8129483327792 | 85.068 |
| 404.6078091839291 | 84.966 |
| 404.4068711352875 | 84.865 |
| 404.2101245235012 | 84.764 |
| 404.0175597944458 | 84.663 |
| 403.82916750282857 | 84.562 |
| 403.64493831179306 | 84.461 |
| 403.4648629925256 | 84.36 |
| 403.2889324238632 | 84.26 |
| 403.11713759190366 | 84.159 |
| 402.9494695896171 | 84.059 |
| 402.78591961645924 | 83.958 |
| 402.62647897798684 | 83.858 |
| 402.4711390854745 | 83.758 |
| 402.3198914555336 | 83.658 |
| 402.17272770973295 | 83.558 |
| 402.0296395742214 | 83.458 |
| 401.890618879352 | 83.358 |
| 401.7556575593085 | 83.258 |
| 401.62474765173306 | 83.159 |
| 401.49788129735686 | 83.059 |
| 401.37505073963143 | 82.96 |
| 401.2562483243629 | 82.861 |
| 401.14146649934736 | 82.761 |
| 401.0306978140088 | 82.662 |
| 400.92393491903863 | 82.563 |
| 400.82117056603704 | 82.464 |
| 400.72239760715667 | 82.365 |
| 400.62760899474796 | 82.267 |
| 400.53679778100656 | 82.168 |
| 400.44995711762255 | 82.07 |
| 400.3670802554319 | 81.971 |
| 400.28816054406974 | 81.873 |
| 400.21319143162555 | 81.775 |
| 400.1421664643005 | 81.677 |
| 400.07507928606657 | 81.579 |
| 400.0119236383279 | 81.481 |
| 399.952693359584 | 81.383 |
| 399.8973823850947 | 81.285 |
| 399.84598474654786 | 81.188 |
| 399.79849457172804 | 81.09 |
| 399.75490608418806 | 80.993 |
| 399.7152136029222 | 80.896 |
| 399.6794115420411 | 80.799 |
| 399.64749441044944 | 80.702 |
| 399.6194568115248 | 80.605 |
| 399.595293442799 | 80.508 |
| 399.57499909564143 | 80.411 |
| 399.5585686549441 | 80.315 |
| 399.54599709880904 | 80.218 |
| 399.53727949823747 | 80.122 |
| 399.53241101682096 | 80.026 |
| 399.5313869104349 | 79.93 |
| 399.5342025269334 | 79.834 |
| 399.5408533058469 | 79.738 |
| 399.551334778081 | 79.642 |
| 399.56564256561796 | 79.546 |
| 399.5837723812197 | 79.451 |
| 399.6057200281332 | 79.355 |
| 399.6314813997974 | 79.26 |
| 399.6610524795525 | 79.165 |
| 399.694429340351 | 79.07 |
| 399.73160814447084 | 78.975 |
| 399.77258514323023 | 78.88 |
| 399.81735667670495 | 78.785 |
| 399.8659191734471 | 78.691 |
| 399.9182691502059 | 78.596 |
| 399.97440321165084 | 78.502 |
| 400.0343180500961 | 78.408 |
| 400.09801044522754 | 78.314 |
| 400.1654772638312 | 78.22 |
| 400.23671545952385 | 78.126 |
| 400.31172207248545 | 78.032 |
| 400.3904942291936 | 77.939 |
| 400.4730291421598 | 77.845 |
| 400.55932410966756 | 77.752 |
| 400.64937651551236 | 77.659 |
| 400.7431838287439 | 77.566 |
| 400.8407436034095 | 77.473 |
| 400.94205347830024 | 77.38 |
| 401.047111176698 | 77.287 |
| 401.1559145061252 | 77.194 |
| 401.26846135809586 | 77.102 |
| 401.38474970786865 | 77.01 |
| 401.50477761420177 | 76.917 |
| 401.62854321910976 | 76.825 |
| 401.7560447476218 | 76.733 |
| 401.88728050754213 | 76.642 |
| 402.02224888921216 | 76.55 |
| 402.1609483652742 | 76.458 |
| 402.3033774904372 | 76.367 |
| 402.44953490124414 | 76.276 |
| 402.5994193158412 | 76.185 |
| 402.75302953374853 | 76.094 |
| 402.91036443563297 | 76.003 |
| 403.0714229830824 | 75.912 |
| 403.2362042183817 | 75.821 |
| 403.4047072642906 | 75.731 |
| 403.5769313238231 | 75.64 |
| 403.7528756800285 | 75.55 |
| 403.9325396957745 | 75.46 |
| 404.11592281353114 | 75.37 |
| 404.3030245551574 | 75.28 |
| 404.4938445216886 | 75.191 |
| 404.68838239312595 | 75.101 |
| 404.8866379282275 | 75.012 |
| 405.08861096430064 | 74.922 |
| 405.29430141699635 | 74.833 |
| 405.5037092801049 | 74.744 |
| 405.7168346253531 | 74.655 |
| 405.9336776022034 | 74.567 |
| 406.15423843765404 | 74.478 |
| 406.3785174360412 | 74.39 |
| 406.6065149788423 | 74.301 |
| 406.8382315244811 | 74.213 |
| 407.07366760813414 | 74.125 |
| 407.3128238415386 | 74.037 |
| 407.55570091280185 | 73.949 |
| 407.8022995862122 | 73.862 |
| 408.0526207020513 | 73.774 |
| 408.30666517640776 | 73.687 |
| 408.56443400099255 | 73.6 |
| 408.82592824295534 | 73.513 |
| 409.0911490447026 | 73.426 |
| 409.3600976237168 | 73.339 |
| 409.63277527237716 | 73.252 |
| 409.9091833577817 | 73.166 |
| 410.1893233215708 | 73.079 |
| 410.4731966797514 | 72.993 |
| 410.7608050225237 | 72.907 |
| 411.05215001410784 | 72.821 |
| 411.34723339257283 | 72.735 |
| 411.64605696966635 | 72.65 |
| 411.9486226306458 | 72.564 |
| 412.25493233411055 | 72.479 |
| 412.5649881118357 | 72.394 |
| 412.87879206860674 | 72.309 |
| 413.1963463820554 | 72.224 |
| 413.51765330249697 | 72.139 |
| 413.84271515276845 | 72.054 |
| 414.1715343280681 | 71.97 |
| 414.504113295796 | 71.886 |
| 414.8404545953956 | 71.802 |
| 415.1805608381967 | 71.717 |
| 415.5244347072592 | 71.634 |
| 415.8720789572182 | 71.55 |
| 416.22349641412984 | 71.466 |
| 416.57868997531835 | 71.383 |
| 416.9376626092242 | 71.3 |
| 417.3004173552533 | 71.216 |
| 417.6669573236266 | 71.133 |
| 418.0372856952317 | 71.051 |
| 418.41140572147447 | 70.968 |
| 418.78932072413215 | 70.885 |
| 419.1710340952071 | 70.803 |
| 419.5565492967817 | 70.721 |
| 419.945869860874 | 70.639 |
| 420.33899938929403 | 70.557 |
| 420.7359415535016 | 70.475 |
| 421.13670009446423 | 70.393 |
| 421.54127882251623 | 70.312 |
| 421.94968161721886 | 70.23 |
| 422.3619124272206 | 70.149 |
| 422.7779752701189 | 70.068 |
| 423.1978742323221 | 69.987 |
| 423.62161346891264 | 69.906 |
| 424.0491972035106 | 69.826 |
| 424.4806297281379 | 69.745 |
| 424.91591540308355 | 69.665 |
| 425.35505865676924 | 69.585 |
| 425.79806398561567 | 69.505 |
| 426.2449359539096 | 69.425 |
| 426.6956791936714 | 69.346 |
| 427.1502984045233 | 69.266 |
| 427.60879835355803 | 69.187 |
| 428.07118387520813 | 69.108 |
| 428.53745987111597 | 69.028 |
| 429.0076313100039 | 68.95 |
| 429.48170322754527 | 68.871 |
| 429.9596807262358 | 68.792 |
| 430.4415689752651 | 68.714 |
| 430.92737321038936 | 68.636 |
| 431.41709873380364 | 68.557 |
| 431.91075091401507 | 68.479 |
| 432.4083351857164 | 68.402 |
| 432.9098570496597 | 68.324 |
| 433.4153220725305 | 68.247 |
| 433.92473588682236 | 68.169 |
| 434.4381041907116 | 68.092 |
| 434.9554327479323 | 68.015 |
| 435.4767273876518 | 67.938 |
| 436.00199400434605 | 67.861 |
| 436.5312385576755 | 67.785 |
| 437.0644670723612 | 67.708 |
| 437.60168563806064 | 67.632 |
| 438.1429004092445 | 67.556 |
| 438.6881176050726 | 67.48 |
| 439.23734350927094 | 67.405 |
| 439.7905844700082 | 67.329 |
| 440.3478468997722 | 67.253 |
| 440.9091372752471 | 67.178 |
| 441.4744621371899 | 67.103 |
| 442.04382809030756 | 67.028 |
| 442.6172418031334 | 66.953 |
| 443.19471000790423 | 66.879 |
| 443.7762395004368 | 66.804 |
| 444.3618371400045 | 66.73 |
| 444.951509849214 | 66.656 |
| 445.54526461388133 | 66.582 |
| 446.1431084829083 | 66.508 |
| 446.7450485681586 | 66.434 |
| 447.3510920443336 | 66.361 |
| 447.96124614884775 | 66.287 |
| 448.57551818170435 | 66.214 |
| 449.19391550537046 | 66.141 |
| 449.8164455446516 | 66.068 |
| 450.44311578656635 | 65.996 |
| 451.0739337802207 | 65.923 |
| 451.7089071366816 | 65.851 |
| 452.3480435288503 | 65.778 |
| 452.99135069133564 | 65.706 |
| 453.63883642032624 | 65.635 |
| 454.29050857346283 | 65.563 |
| 454.94637506970963 | 65.491 |
| 455.60644388922566 | 65.42 |
| 456.27072307323505 | 65.349 |
| 456.93922072389705 | 65.278 |
| 457.6119450041755 | 65.207 |
| 458.28890413770733 | 65.136 |
| 458.970106408671 | 65.065 |
| 459.65556016165345 | 64.995 |
| 460.3452738015174 | 64.925 |
| 461.03925579326693 | 64.855 |
| 461.73751466191277 | 64.785 |
| 462.4400589923369 | 64.715 |
| 463.14689742915607 | 64.645 |
| 463.8580386765848 | 64.576 |
| 464.5734914982971 | 64.507 |
| 465.2932647172877 | 64.438 |
| 466.0173672157321 | 64.369 |
| 466.745807934846 | 64.3 |
| 467.4785958747432 | 64.231 |
| 468.2157400942929 | 64.163 |
| 468.95724971097616 | 64.095 |
| 469.70313390074057 | 64.027 |
| 470.4534018978547 | 63.959 |
| 471.2080629947608 | 63.891 |
| 471.96712654192646 | 63.824 |
| 472.73060194769556 | 63.756 |
| 473.49849867813725 | 63.689 |
| 474.2708262568942 | 63.622 |
| 475.04759426502966 | 63.555 |
| 475.82881234087256 | 63.488 |
| 476.61449017986223 | 63.422 |
| 477.40463753439093 | 63.355 |
| 478.19926421364545 | 63.289 |
| 478.99838008344705 | 63.223 |
| 479.8019950660901 | 63.157 |
| 480.61011914017917 | 63.091 |
| 481.42276234046443 | 63.026 |
| 482.2399347576759 | 62.961 |
| 483.0616465383556 | 62.895 |
| 483.8879078846886 | 62.83 |
| 484.718729054332 | 62.765 |
| 485.5541203602423 | 62.701 |
| 486.39409217050115 | 62.636 |
| 487.2386549081396 | 62.572 |
| 488.08781905095987 | 62.508 |
| 488.9415951313559 | 62.444 |
| 489.7999937361318 | 62.38 |
| 490.66302550631855 | 62.316 |
| 491.5307011369884 | 62.253 |
| 492.40303137706786 | 62.189 |
| 493.28002702914824 | 62.126 |
| 494.1616989492943 | 62.063 |
| 495.0480580468509 | 62.001 |
| 495.9391152842474 | 61.938 |
| 496.83488167680014 | 61.876 |
| 497.73536829251236 | 61.813 |
| 498.6405862518723 | 61.751 |
| 499.5505467276489 | 61.689 |
| 500.465260944685 | 61.628 |
| 501.3847401796884 | 61.566 |
| 502.3089957610207 | 61.505 |
| 503.2380390684834 | 61.443 |
| 504.1718815331017 | 61.382 |
| 505.11053463690604 | 61.321 |
| 506.0540099127105 | 61.261 |
| 507.00231894388935 | 61.2 |
| 507.95547336415046 | 61.14 |
| 508.91348485730634 | 61.08 |
| 509.8763651570425 | 61.02 |
| 510.84412604668285 | 60.96 |
| 511.81677935895243 | 60.9 |
| 512.7943369757376 | 60.841 |
| 513.776810827843 | 60.781 |
| 514.7642128947456 | 60.722 |
| 515.7565552043462 | 60.663 |
| 516.7538498327178 | 60.605 |
| 517.7561089038506 | 60.546 |
| 518.7633445893943 | 60.488 |
| 519.775569108397 | 60.43 |
| 520.7927947270416 | 60.371 |
| 521.815033758378 | 60.314 |
| 522.8422985620531 | 60.256 |
| 523.8746015440364 | 60.198 |
| 524.9119551563434 | 60.141 |
| 525.9543718967547 | 60.084 |
| 527.0018643085322 | 60.027 |
| 528.0544449801317 | 59.97 |
| 529.1121265449121 | 59.914 |
| 530.1749216808406 | 59.857 |
| 531.2428431101947 | 59.801 |
| 532.3159035992605 | 59.745 |
| 533.3941159580272 | 59.689 |
| 534.4774930398777 | 59.633 |
| 535.5660477412758 | 59.578 |
| 536.6597930014493 | 59.522 |
| 537.7587418020688 | 59.467 |
| 538.8629071669235 | 59.412 |
| 539.972302161592 | 59.358 |
| 541.0869398931097 | 59.303 |
| 542.2068335096321 | 59.248 |
| 543.3319962000934 | 59.194 |
| 544.4624411938611 | 59.14 |
| 545.598181760387 | 59.086 |
| 546.7392312088531 | 59.033 |
| 547.8856028878132 | 58.979 |
| 549.0373101848306 | 58.926 |
| 550.194366526111 | 58.873 |
| 551.3567853761306 | 58.82 |
| 552.5245802372604 | 58.767 |
| 553.6977646493848 | 58.714 |
| 554.876352189517 | 58.662 |
| 556.0603564714078 | 58.61 |
| 557.2497911451512 | 58.558 |
| 558.4446698967845 | 58.506 |
| 559.6450064478831 | 58.454 |
| 560.8508145551515 | 58.403 |
| 562.0621080100078 | 58.351 |
| 563.2789006381644 | 58.3 |
| 564.5012062992027 | 58.249 |
| 565.7290388861435 | 58.199 |
| 566.9624123250106 | 58.148 |
| 568.2013405743913 | 58.098 |
| 569.4458376249894 | 58.047 |
| 570.6959174991741 | 57.997 |
| 571.951594250523 | 57.948 |
| 573.2128819633596 | 57.898 |
| 574.4797947522849 | 57.849 |
| 575.7523467617037 | 57.799 |
| 577.0305521653455 | 57.75 |
| 578.3144251657783 | 57.701 |
| 579.6039799939182 | 57.653 |
| 580.8992309085318 | 57.604 |
| 582.2001921957334 | 57.556 |
| 583.5068781684756 | 57.508 |
| 584.8193031660344 | 57.46 |
| 586.1374815534872 | 57.412 |
| 587.4614277211859 | 57.365 |
| 588.7911560842224 | 57.318 |
| 590.1266810818884 | 57.27 |
| 591.4680171771286 | 57.223 |
| 592.8151788559876 | 57.177 |
| 594.1681806270499 | 57.13 |
| 595.5270370208734 | 57.084 |
| 596.8917625894164 | 57.038 |
| 598.2623719054576 | 56.992 |
| 599.6388795620092 | 56.946 |
| 601.021300171723 | 56.9 |
| 602.4096483662906 | 56.855 |
| 603.8039387958347 | 56.81 |
| 605.2041861282946 | 56.765 |
| 606.6104050488043 | 56.72 |
| 608.0226102590632 | 56.675 |
| 609.4408164766992 | 56.631 |
| 610.8650384346251 | 56.586 |
| 612.2952908803869 | 56.542 |
| 613.7315885755046 | 56.499 |
| 615.1739462948057 | 56.455 |
| 616.6223788257508 | 56.411 |
| 618.0769009677517 | 56.368 |
| 619.5375275314809 | 56.325 |
| 621.0042733381742 | 56.282 |
| 622.4771532189246 | 56.24 |
| 623.9561820139683 | 56.197 |
| 625.4413745719627 | 56.155 |
| 626.9327457492562 | 56.113 |
| 628.4303104091495 | 56.071 |
| 629.9340834211481 | 56.029 |
| 631.4440796602079 | 55.988 |
| 632.9603140059702 | 55.947 |
| 634.4828013419897 | 55.905 |
| 636.011556554953 | 55.865 |
| 637.5465945338887 | 55.824 |
| 639.0879301693683 | 55.783 |
| 640.6355783526986 | 55.743 |
| 642.1895539751049 | 55.703 |
| 643.7498719269046 | 55.663 |
| 645.3165470966726 | 55.624 |
| 646.8895943703969 | 55.584 |
| 648.4690286306248 | 55.545 |
| 650.0548647555997 | 55.506 |
| 651.6471176183887 | 55.467 |
| 653.2458020860004 | 55.428 |
| 654.8509330184928 | 55.39 |
| 656.462525268072 | 55.352 |
| 658.0805936781807 | 55.314 |
| 659.7051530825764 | 55.276 |
| 661.336218304401 | 55.238 |
| 662.973804155238 | 55.201 |
| 664.617925434162 | 55.164 |
| 666.2685969267762 | 55.127 |
| 667.9258334042404 | 55.09 |
| 669.589649622288 | 55.053 |
| 671.2600603202329 | 55.017 |
| 672.937080219966 | 54.981 |
| 674.6207240249398 | 54.945 |
| 676.3110064191441 | 54.909 |
| 678.0079420660687 | 54.873 |
| 679.7115456076572 | 54.838 |
| 681.4218316632478 | 54.803 |
| 683.1388148285046 | 54.768 |
| 684.8625096743366 | 54.733 |
| 686.5929307458058 | 54.699 |
| 688.3300925610238 | 54.665 |
| 690.0740096100366 | 54.63 |
| 691.8246963536984 | 54.597 |
| 693.5821672225333 | 54.563 |
| 695.346436615585 | 54.529 |
| 697.1175188992554 | 54.496 |
| 698.8954284061299 | 54.463 |
| 700.6801794337923 | 54.43 |
| 702.4717862436262 | 54.398 |
| 704.2702630596045 | 54.366 |
| 706.075624067067 | 54.333 |
| 707.887883411485 | 54.301 |
| 709.7070551972135 | 54.27 |
| 711.5331534862314 | 54.238 |
| 713.3661922968674 | 54.207 |
| 715.2061856025149 | 54.176 |
| 717.0531473303329 | 54.145 |
| 718.9070913599339 | 54.114 |
| 720.7680315220593 | 54.084 |
| 722.6359815972411 | 54.054 |
| 724.5109553144501 | 54.024 |
| 726.3929663497316 | 53.994 |
| 728.2820283248262 | 53.964 |
| 730.1781548057786 | 53.935 |
| 732.0813593015313 | 53.906 |
| 733.9916552625053 | 53.877 |
| 735.9090560791672 | 53.848 |
| 737.8335750805808 | 53.82 |
| 739.7652255329467 | 53.792 |
| 741.7040206381262 | 53.764 |
| 743.6499735321511 | 53.736 |
| 745.6030972837201 | 53.708 |
| 747.5634048926794 | 53.681 |
| 749.5309092884899 | 53.654 |
| 751.5056233286784 | 53.627 |
| 753.487559797276 | 53.6 |
| 755.4767314032393 | 53.574 |
| 757.4731507788583 | 53.548 |
| 759.4768304781488 | 53.522 |
| 761.4877829752293 | 53.496 |
| 763.5060206626829 | 53.471 |
| 765.5315558499041 | 53.445 |
| 767.5644007614294 | 53.42 |
| 769.6045675352534 | 53.395 |
| 771.6520682211282 | 53.371 |
| 773.7069147788475 | 53.346 |
| 775.7691190765152 | 53.322 |
| 777.8386928887971 | 53.298 |
| 779.915647895158 | 53.275 |
| 781.999995678081 | 53.251 |
| 784.0917477212714 | 53.228 |
| 786.1909154078452 | 53.205 |
| 788.297510018499 | 53.182 |
| 790.4115427296653 | 53.16 |
| 792.5330246116498 | 53.137 |
| 794.6619666267535 | 53.115 |
| 796.7983796273762 | 53.094 |
| 798.9422743541045 | 53.072 |
| 801.0936614337819 | 53.051 |
| 803.2525513775624 | 53.03 |
| 805.4189545789468 | 53.009 |
| 807.592881311801 | 52.988 |
| 809.774341728358 | 52.968 |
| 811.9633458572015 | 52.948 |
| 814.1599036012326 | 52.928 |
| 816.3640247356183 | 52.908 |
| 818.5757189057225 | 52.889 |
| 820.7949956250195 | 52.869 |
| 823.0218642729885 | 52.85 |
| 825.2563340929913 | 52.832 |
| 827.4984141901311 | 52.813 |
| 829.7481135290934 | 52.795 |
| 832.0054409319683 | 52.777 |
| 834.270405076055 | 52.759 |
| 836.543014491647 | 52.742 |
| 838.8232775597994 | 52.725 |
| 841.1112025100774 | 52.708 |
| 843.406797418286 | 52.691 |
| 845.7100702041806 | 52.674 |
| 848.0210286291593 | 52.658 |
| 850.3396802939359 | 52.642 |
| 852.6660326361933 | 52.626 |
| 855.0000929282193 | 52.611 |
| 857.3418682745208 | 52.596 |
| 859.6913656094215 | 52.581 |
| 862.0485916946377 | 52.566 |
| 864.413553116836 | 52.551 |
| 866.7862562851716 | 52.537 |
| 869.1667074288057 | 52.523 |
| 871.554912594405 | 52.509 |
| 873.95087764362 | 52.496 |
| 876.354608250544 | 52.483 |
| 878.7661098991523 | 52.47 |
| 881.1853878807215 | 52.457 |
| 883.6124472912284 | 52.444 |
| 886.0472930287287 | 52.432 |
| 888.4899297907168 | 52.42 |
| 890.9403620714633 | 52.409 |
| 893.3985941593337 | 52.397 |
| 895.8646301340868 | 52.386 |
| 898.338473864152 | 52.375 |
| 900.820129003886 | 52.364 |
| 903.3095989908098 | 52.354 |
| 905.8068870428249 | 52.344 |
| 908.311996155408 | 52.334 |
| 910.8249290987865 | 52.324 |
| 913.3456884150919 | 52.315 |
| 915.8742764154932 | 52.306 |
| 918.4106951773094 | 52.297 |
| 920.9549465411009 | 52.289 |
| 923.5070321077401 | 52.28 |
| 926.0669532354615 | 52.272 |
| 928.6347110368897 | 52.265 |
| 931.2103063760479 | 52.257 |
| 933.7937398653442 | 52.25 |
| 936.3850118625369 | 52.243 |
| 938.9841224676798 | 52.236 |
| 941.5910715200448 | 52.23 |
| 944.2058585950247 | 52.224 |
| 946.8284830010139 | 52.218 |
| 949.4589437762685 | 52.213 |
| 952.0972396857449 | 52.207 |
| 954.7433692179172 | 52.202 |
| 957.3973305815739 | 52.198 |
| 960.0591217025923 | 52.193 |
| 962.7287402206924 | 52.189 |
| 965.4061834861699 | 52.185 |
| 968.0914485566068 | 52.182 |
| 970.7845321935622 | 52.178 |
| 973.4854308592406 | 52.175 |
| 976.1941407131399 | 52.172 |
| 978.9106576086774 | 52.17 |
| 981.6349770897955 | 52.168 |
| 984.3670943875453 | 52.166 |
| 987.10700441665 | 52.164 |
| 989.8547017720464 | 52.163 |
| 992.6101807254056 | 52.162 |
| 995.3734352216329 | 52.161 |
| 998.1444588753462 | 52.16 |
| 1000.9232449673339 | 52.16 |
| 1003.7097864409913 | 52.16 |
| 1006.5040758987367 | 52.161 |
| 1009.3061055984067 | 52.161 |
| 1012.1158674496298 | 52.162 |
| 1014.9333530101804 | 52.164 |
| 1017.7585534823115 | 52.165 |
| 1020.5914597090671 | 52.167 |
| 1023.4320621705739 | 52.169 |
| 1026.2803509803127 | 52.172 |
| 1029.1363158813695 | 52.174 |
| 1031.9999462426656 | 52.177 |
| 1034.8712310551696 | 52.181 |
| 1037.7501589280864 | 52.184 |
| 1040.6367180850284 | 52.188 |
| 1043.530896360166 | 52.193 |
| 1046.4326811943586 | 52.197 |
| 1049.3420596312656 | 52.202 |
| 1052.2590183134382 | 52.207 |
| 1055.183543478392 | 52.213 |
| 1058.1156209546596 | 52.218 |
| 1061.055236157824 | 52.224 |
| 1064.002374086535 | 52.231 |
| 1066.9570193185032 | 52.238 |
| 1069.9191560064792 | 52.245 |
| 1072.8887678742112 | 52.252 |
| 1075.865838212386 | 52.259 |
| 1078.8503498745508 | 52.267 |
| 1081.8422852730173 | 52.276 |
| 1084.8416263747483 | 52.284 |
| 1087.8483546972266 | 52.293 |
| 1090.862451304305 | 52.302 |
| 1093.883896802042 | 52.312 |
| 1096.9126713345167 | 52.322 |
| 1099.9487545796303 | 52.332 |
| 1102.9921257448884 | 52.342 |
| 1106.0427635631686 | 52.353 |
| 1109.100646288471 | 52.364 |
| 1112.165751691653 | 52.375 |
| 1115.2380570561486 | 52.387 |
| 1118.317539173672 | 52.399 |
| 1121.4041743399064 | 52.412 |
| 1124.4979383501768 | 52.424 |
| 1127.5988064951105 | 52.437 |
| 1130.70675355628 | 52.451 |
| 1133.8217538018357 | 52.465 |
| 1136.9437809821206 | 52.479 |
| 1140.0728083252754 | 52.493 |
| 1143.2088085328282 | 52.508 |
| 1146.351753775272 | 52.523 |
| 1149.50161568763 | 52.538 |
| 1152.6583653650077 | 52.554 |
| 1155.8219733581357 | 52.57 |
| 1158.9924096688976 | 52.586 |
| 1162.16964374585 | 52.603 |
| 1165.3536444797294 | 52.62 |
| 1168.5443801989509 | 52.637 |
| 1171.741818665095 | 52.655 |
| 1174.9459270683867 | 52.673 |
| 1178.1566720231642 | 52.692 |
| 1181.374019563339 | 52.71 |
| 1184.5979351378492 | 52.73 |
| 1187.8283836061025 | 52.749 |
| 1191.065329233415 | 52.769 |
| 1194.3087356864394 | 52.789 |
| 1197.5585660285901 | 52.81 |
| 1200.8147827154603 | 52.83 |
| 1204.077347590235 | 52.852 |
| 1207.3462218790971 | 52.873 |
| 1210.6213661866313 | 52.895 |
| 1213.9027404912229 | 52.917 |
| 1217.1903041404526 | 52.94 |
| 1220.4840158464897 | 52.963 |
| 1223.7838336814823 | 52.986 |
| 1227.0897150729456 | 53.01 |
| 1230.4016167991497 | 53.034 |
| 1233.719494984506 | 53.059 |
| 1237.043305094954 | 53.083 |
| 1240.3730019333486 | 53.109 |
| 1243.7085396348489 | 53.134 |
| 1247.0498716623083 | 53.16 |
| 1250.3969508016678 | 53.186 |
| 1253.7497291573516 | 53.213 |
| 1257.1081581476672 | 53.24 |
| 1260.4721885002098 | 53.267 |
| 1263.841770247272 | 53.295 |
| 1267.2168527212589 | 53.323 |
| 1270.59738455011 | 53.352 |
| 1273.9833136527293 | 53.381 |
| 1277.374587234422 | 53.41 |
| 1280.771151782341 | 53.439 |
| 1284.1729530609425 | 53.469 |
| 1287.579936107453 | 53.5 |
| 1290.9920452273454 | 53.531 |
| 1294.4092239898296 | 53.562 |
| 1297.8314152233531 | 53.593 |
| 1301.2585610111184 | 53.625 |
| 1304.690602686612 | 53.658 |
| 1308.1274808291498 | 53.69 |
| 1311.5691352594397 | 53.723 |
| 1315.0155050351595 | 53.757 |
| 1318.466528446554 | 53.791 |
| 1321.9221430120504 | 53.825 |
| 1325.3822854738935 | 53.86 |
| 1328.8468917938023 | 53.895 |
| 1332.315897148648 | 53.93 |
| 1335.7892359261539 | 53.966 |
| 1339.2668417206203 | 54.002 |
| 1342.7486473286726 | 54.039 |
| 1346.2345847450372 | 54.076 |
| 1349.7245851583411 | 54.113 |
| 1353.2185789469424 | 54.151 |
| 1356.7164956747872 | 54.189 |
| 1360.2182640872982 | 54.228 |
| 1363.7238121072926 | 54.267 |
| 1367.2330668309332 | 54.307 |
| 1370.745954523713 | 54.346 |
| 1374.2624006164722 | 54.387 |
| 1377.7823297014534 | 54.427 |
| 1381.305665528391 | 54.469 |
| 1384.8323310006406 | 54.51 |
| 1388.3622481713444 | 54.552 |
| 1391.8953382396408 | 54.594 |
| 1395.431521546912 | 54.637 |
| 1398.9707175730762 | 54.68 |
| 1402.5128449329225 | 54.724 |
| 1406.0578213724925 | 54.768 |
| 1409.6055637655072 | 54.813 |
| 1413.155988109842 | 54.858 |
| 1416.7090095240508 | 54.903 |
| 1420.2645422439412 | 54.949 |
| 1423.8224996192 | 54.995 |
| 1427.3827941100737 | 55.041 |
| 1430.945337284102 | 55.088 |
| 1434.5100398129082 | 55.136 |
| 1438.0768114690466 | 55.184 |
| 1441.6455611229085 | 55.232 |
| 1445.2161967396887 | 55.281 |
| 1448.7886253764136 | 55.33 |
| 1452.3627531790323 | 55.38 |
| 1455.9384853795723 | 55.43 |
| 1459.5157262933615 | 55.481 |
| 1463.0943793163178 | 55.532 |
| 1466.6743469223084 | 55.583 |
| 1470.2555306605782 | 55.635 |
| 1473.8378311532524 | 55.687 |
| 1477.4211480929116 | 55.74 |
| 1481.0053802402433 | 55.793 |
| 1484.5904254217696 | 55.847 |
| 1488.1761805276542 | 55.901 |
| 1491.7625415095897 | 55.956 |
| 1495.349403378766 | 56.011 |
| 1498.936660203924 | 56.066 |
| 1502.5242051094924 | 56.122 |
| 1506.1119302738136 | 56.178 |
| 1509.6997269274573 | 56.235 |
| 1513.2874853516237 | 56.293 |
| 1516.8750948766408 | 56.35 |
| 1520.4624438805538 | 56.409 |
| 1524.0494197878115 | 56.467 |
| 1527.635909068049 | 56.527 |
| 1531.2217972349697 | 56.586 |
| 1534.80696884533 | 56.646 |
| 1538.391307498024 | 56.707 |
| 1541.9746958332753 | 56.768 |
| 1545.5570155319338 | 56.83 |
| 1549.1381473148813 | 56.892 |
| 1552.7179709425473 | 56.954 |
| 1556.2963652145368 | 57.017 |
| 1559.8732079693714 | 57.08 |
| 1563.4483760843473 | 57.144 |
| 1567.02174547551 | 57.209 |
| 1570.5931910977488 | 57.274 |
| 1574.1625869450133 | 57.339 |
| 1577.7298060506525 | 57.405 |
| 1581.2947204878794 | 57.471 |
| 1584.8572013703638 | 57.538 |
| 1588.4171188529529 | 57.605 |
| 1591.9743421325243 | 57.673 |
| 1595.5287394489715 | 57.741 |
| 1599.0801780863242 | 57.81 |
| 1602.6285243740065 | 57.879 |
| 1606.1736436882338 | 57.949 |
| 1609.7154004535503 | 58.019 |
| 1613.2536581445102 | 58.09 |
| 1616.7882792875032 | 58.161 |
| 1620.3191254627282 | 58.233 |
| 1623.8460573063144 | 58.305 |
| 1627.368934512595 | 58.378 |
| 1630.8876158365322 | 58.451 |
| 1634.4019590962992 | 58.525 |
| 1637.9118211760174 | 58.599 |
| 1641.4170580286543 | 58.674 |
| 1644.9175246790808 | 58.749 |
| 1648.4130752272927 | 58.825 |
| 1651.9035628517968 | 58.901 |
| 1655.3888398131646 | 58.978 |
| 1658.8687574577539 | 59.056 |
| 1662.3431662216028 | 59.133 |
| 1665.8119156344958 | 59.212 |
| 1669.274854324205 | 59.291 |
| 1672.7318300209095 | 59.37 |
| 1676.1826895617912 | 59.45 |
| 1679.6272788958154 | 59.53 |
| 1683.06544308869 | 59.611 |
| 1686.4970263280134 | 59.693 |
| 1689.9218719286062 | 59.775 |
| 1693.3398223380336 | 59.857 |
| 1696.7507191423183 | 59.94 |
| 1700.1544030718442 | 60.024 |
| 1703.5507140074567 | 60.108 |
| 1706.939490986759 | 60.192 |
| 1710.320572210605 | 60.277 |
| 1713.6937950497943 | 60.363 |
| 1717.058996051968 | 60.449 |
| 1720.4160109487084 | 60.536 |
| 1723.7646746628443 | 60.623 |
| 1727.104821315964 | 60.711 |
| 1730.4362842361365 | 60.799 |
| 1733.7588959658447 | 60.888 |
| 1737.0724882701295 | 60.977 |
| 1740.3768921449505 | 61.067 |
| 1743.6719378257603 | 61.157 |
| 1746.9574547962975 | 61.248 |
| 1750.2332717975987 | 61.34 |
| 1753.4992168372316 | 61.432 |
| 1756.7551171987502 | 61.525 |
| 1760.0007994513728 | 61.618 |
| 1763.2360894598878 | 61.711 |
| 1766.460812394784 | 61.806 |
| 1769.6747927426102 | 61.9 |
| 1772.8778543165652 | 61.996 |
| 1776.0698202673173 | 62.091 |
| 1779.2505130940574 | 62.188 |
| 1782.4197546557853 | 62.285 |
| 1785.5773661828312 | 62.382 |
| 1788.7231682886134 | 62.48 |
| 1791.8569809816331 | 62.579 |
| 1794.9786236777081 | 62.678 |
| 1798.0879152124453 | 62.777 |
| 1801.1846738539548 | 62.878 |
| 1804.268717315805 | 62.978 |
| 1807.3398627702204 | 63.08 |
| 1810.3979268615237 | 63.182 |
| 1813.4427257198204 | 63.284 |
| 1816.4740749749303 | 63.387 |
| 1819.4917897705639 | 63.49 |
| 1822.4956847787457 | 63.595 |
| 1825.4855742144855 | 63.699 |
| 1828.4612718506953 | 63.804 |
| 1831.422591033357 | 63.91 |
| 1834.369344696938 | 64.016 |
| 1837.3013453800545 | 64.123 |
| 1840.2184052413872 | 64.231 |
| 1843.1203360758443 | 64.338 |
| 1846.0069493309759 | 64.447 |
| 1848.8780561236379 | 64.556 |
| 1851.7334672569068 | 64.666 |
| 1854.572993237244 | 64.776 |
| 1857.396444291911 | 64.886 |
| 1860.2036303866341 | 64.998 |
| 1862.9943612435195 | 65.11 |
| 1865.7684463592175 | 65.222 |
| 1868.5256950233363 | 65.335 |
| 1871.2659163371043 | 65.448 |
| 1873.9889192322812 | 65.562 |
| 1876.694512490316 | 65.677 |
| 1879.382504761753 | 65.792 |
| 1882.052704585883 | 65.908 |
| 1884.7049204106418 | 66.024 |
| 1887.3389606127503 | 66.141 |
| 1889.9546335181008 | 66.258 |
| 1892.551747422385 | 66.376 |
| 1895.1301106119622 | 66.495 |
| 1897.689531384969 | 66.614 |
| 1900.2298180726666 | 66.733 |
| 1902.7507790610252 | 66.854 |
| 1905.2522228125454 | 66.974 |
| 1907.7339578883114 | 67.096 |
| 1910.1957929702785 | 67.217 |
| 1912.6375368837896 | 67.34 |
| 1915.058998620321 | 67.463 |
| 1917.459987360454 | 67.586 |
| 1919.8403124970714 | 67.71 |
| 1922.1997836587755 | 67.835 |
| 1924.5382107335265 | 67.96 |
| 1926.8554038924979 | 68.085 |
| 1929.1511736141456 | 68.212 |
| 1931.4253307084916 | 68.338 |
| 1933.6776863416146 | 68.466 |
| 1935.9080520603484 | 68.594 |
| 1938.1162398171834 | 68.722 |
| 1940.302061995369 | 68.851 |
| 1942.4653314342127 | 68.98 |
| 1944.605861454573 | 69.11 |
| 1946.7234658845448 | 69.241 |
| 1948.817959085329 | 69.372 |
| 1950.8891559772878 | 69.504 |
| 1952.9368720661787 | 69.636 |
| 1954.9609234695645 | 69.769 |
| 1956.9611269433956 | 69.902 |
| 1958.9372999087595 | 70.036 |
| 1960.8892604787945 | 70.17 |
| 1962.8168274857626 | 70.305 |
| 1964.719820508277 | 70.44 |
| 1966.598059898681 | 70.576 |
| 1968.4513668105708 | 70.713 |
| 1970.2795632264617 | 70.849 |
| 1972.0824719855882 | 70.987 |
| 1973.859916811837 | 71.125 |
| 1975.6117223418046 | 71.264 |
| 1977.337714152977 | 71.403 |
| 1979.0377187920242 | 71.542 |
| 1980.7115638032046 | 71.682 |
| 1982.3590777568745 | 71.823 |
| 1983.980090278096 | 71.964 |
| 1985.5744320753379 | 72.106 |
| 1987.1419349692646 | 72.248 |
| 1988.682431921605 | 72.39 |
| 1990.1957570640973 | 72.533 |
| 1991.6817457275017 | 72.677 |
| 1993.140234470677 | 72.821 |
| 1994.5710611097118 | 72.966 |
| 1995.9740647471067 | 73.111 |
| 1997.3490858009977 | 73.257 |
| 1998.695966034417 | 73.403 |
| 2000.0145485845828 | 73.549 |
| 2001.3046779922101 | 73.697 |
| 2002.5662002308395 | 73.844 |
| 2003.7989627361706 | 73.992 |
| 2005.0028144353992 | 74.141 |
| 2006.177605776546 | 74.29 |
| 2007.3231887577722 | 74.439 |
| 2008.4394169566729 | 74.589 |
| 2009.5261455595423 | 74.74 |
| 2010.5832313906008 | 74.891 |
| 2011.6105329411778 | 75.042 |
| 2012.6079103988427 | 75.194 |
| 2013.5752256764736 | 75.346 |
| 2014.5123424412589 | 75.499 |
| 2015.419126143621 | 75.652 |
| 2016.2954440460558 | 75.806 |
| 2017.1411652518777 | 75.96 |
| 2017.9561607338644 | 76.114 |
| 2018.74030336279 | 76.269 |
| 2019.4934679358412 | 76.425 |
| 2020.2155312049044 | 76.58 |
| 2020.9063719047188 | 76.737 |
| 2021.5658707808832 | 76.893 |
| 2022.1939106177117 | 77.05 |
| 2022.7903762659253 | 77.208 |
| 2023.3551546701742 | 77.366 |
| 2023.8881348963796 | 77.524 |
| 2024.3892081588867 | 77.683 |
| 2024.8582678474218 | 77.842 |
| 2025.2952095538396 | 78.002 |
| 2025.699931098659 | 78.162 |
| 2026.0723325573701 | 78.322 |
| 2026.4123162865117 | 78.483 |
| 2026.719786949502 | 78.644 |
| 2026.99465154222 | 78.805 |
| 2027.2368194183257 | 78.967 |
| 2027.4462023143085 | 79.129 |
| 2027.6227143742585 | 79.292 |
| 2027.7662721743482 | 79.455 |
| 2027.876794747016 | 79.618 |
| 2027.9542036048451 | 79.782 |
| 2027.9984227641248 | 79.946 |
| 2028.009378768088 | 80.11 |
| 2027.9870007098143 | 80.275 |
| 2027.9312202547906 | 80.44 |
| 2027.841971663119 | 80.605 |
| 2027.7191918113654 | 80.771 |
| 2027.5628202140363 | 80.937 |
| 2027.372799044678 | 81.104 |
| 2027.1490731565882 | 81.27 |
| 2026.8915901031307 | 81.437 |
| 2026.6003001576462 | 81.604 |
| 2026.2751563329475 | 81.772 |
| 2025.916114400394 | 81.94 |
| 2025.5231329085345 | 82.108 |
| 2025.0961732013109 | 82.276 |
| 2024.6351994358142 | 82.445 |
| 2024.1401785995847 | 82.614 |
| 2023.611080527447 | 82.783 |
| 2023.0478779178748 | 82.953 |
| 2022.450546348873 | 83.122 |
| 2021.819064293374 | 83.292 |
| 2021.1534131341355 | 83.463 |
| 2020.4535771781375 | 83.633 |
| 2019.7195436704658 | 83.804 |
| 2018.9513028076788 | 83.975 |
| 2018.1488477506468 | 84.146 |
| 2017.3121746368597 | 84.317 |
| 2016.441282592194 | 84.489 |
| 2015.536173742133 | 84.66 |
| 2014.5968532224338 | 84.832 |
| 2013.6233291892331 | 85.004 |
| 2012.6156128285882 | 85.177 |
| 2011.573718365443 | 85.349 |
| 2010.4976630720175 | 85.522 |
| 2009.3874672756103 | 85.695 |
| 2008.2431543658122 | 85.868 |
| 2007.0647508011225 | 86.041 |
| 2005.852286114965 | 86.214 |
| 2004.6057929210958 | 86.388 |
| 2003.3253069184018 | 86.561 |
| 2002.01086689508 | 86.735 |
| 2000.6625147321981 | 86.909 |
| 1999.2802954066287 | 87.083 |
| 1997.8642569933534 | 87.257 |
| 1996.4144506671346 | 87.431 |
| 1994.9309307035492 | 87.605 |
| 1993.413754479381 | 87.779 |
| 1991.8629824723703 | 87.954 |
| 1990.2786782603155 | 88.128 |
| 1988.6609085195234 | 88.303 |
| 1987.0097430226097 | 88.478 |
| 1985.3252546356412 | 88.652 |
| 1983.6075193146226 | 88.827 |
| 1981.8566161013237 | 89.002 |
| 1980.0726271184458 | 89.176 |
| 1978.255637564125 | 89.351 |
| 1976.4057357057736 | 89.526 |
| 1974.523012873255 | 89.701 |
| 1972.607563451396 | 89.876 |
| 1970.65948487183 | 90.05 |
| 1968.6788776041797 | 90.225 |
| 1966.665845146568 | 90.4 |
| 1964.6204940154694 | 90.575 |
| 1962.5429337348924 | 90.75 |
| 1960.4332768249 | 90.924 |
| 1958.2916387894684 | 91.099 |
| 1956.1181381036815 | 91.274 |
| 1953.9128962002687 | 91.448 |
| 1951.6760374554838 | 91.623 |
| 1949.407689174327 | 91.797 |
| 1947.1079815751166 | 91.971 |
| 1944.7770477734075 | 92.145 |
| 1942.4150237652639 | 92.32 |
| 1940.0220484098872 | 92.494 |
| 1937.5982634116035 | 92.667 |
| 1935.143813301213 | 92.841 |
| 1932.6588454167081 | 93.015 |
| 1930.1435098833617 | 93.188 |
| 1927.5979595931917 | 93.362 |
| 1925.022350183806 | 93.535 |
| 1922.4168400166338 | 93.708 |
| 1919.7815901545464 | 93.881 |
| 1917.1167643388765 | 94.054 |
| 1914.4225289658389 | 94.226 |
| 1911.6990530623598 | 94.398 |
| 1908.9465082613206 | 94.571 |
| 1906.1650687762235 | 94.742 |
| 1903.3549113752854 | 94.914 |
| 1900.5162153549657 | 95.086 |
| 1897.6491625129386 | 95.257 |
| 1894.7539371205135 | 95.428 |
| 1891.830725894514 | 95.599 |
| 1888.879717968623 | 95.769 |
| 1885.9011048642 | 95.939 |
| 1882.895080460583 | 96.109 |
| 1879.8618409648784 | 96.279 |
| 1876.801584881254 | 96.449 |
| 1873.714512979738 | 96.618 |
| 1870.6008282645366 | 96.787 |
| 1867.4607359418806 | 96.955 |
| 1864.2944433874068 | 97.123 |
| 1861.1021601130883 | 97.291 |
| 1857.8840977337202 | 97.459 |
| 1854.640469932973 | 97.626 |
| 1851.3714924290243 | 97.793 |
| 1848.0773829397767 | 97.959 |
| 1844.758361147676 | 98.125 |
| 1841.414648664138 | 98.291 |
| 1838.0464689935968 | 98.457 |
| 1834.6540474971835 | 98.622 |
| 1831.2376113560488 | 98.786 |
| 1827.7973895343403 | 98.951 |
| 1824.3336127418447 | 99.114 |
| 1820.846513396309 | 99.278 |
| 1817.3363255854504 | 99.441 |
| 1813.803285028667 | 99.603 |
| 1810.2476290384639 | 99.765 |
| 1806.6695964816029 | 99.927 |
| 1803.0694277399905 | 100.088 |
| 1799.447364671317 | 100.249 |
| 1795.8036505694565 | 100.409 |
| 1792.1385301246428 | 100.569 |
| 1788.4522493834322 | 100.729 |
| 1784.745055708467 | 100.887 |
| 1781.0171977380505 | 101.046 |
| 1777.2689253455487 | 101.204 |
| 1773.500489598629 | 101.361 |
| 1769.71214271835 | 101.518 |
| 1765.9041380381145 | 101.674 |
| 1762.0767299625008 | 101.83 |
| 1758.23017392598 | 101.985 |
| 1754.364726351538 | 102.14 |
| 1750.4806446092114 | 102.294 |
| 1746.5781869745515 | 102.447 |
| 1742.657612587028 | 102.6 |
| 1738.719181408387 | 102.753 |
| 1734.763154180974 | 102.904 |
| 1730.789792386037 | 103.056 |
| 1726.7993582020208 | 103.206 |
| 1722.792114462864 | 103.356 |
| 1718.7683246163153 | 103.506 |
| 1714.7282526822771 | 103.654 |
| 1710.6721632111924 | 103.803 |
| 1706.6003212424844 | 103.95 |
| 1702.512992263064 | 104.097 |
| 1698.4104421659163 | 104.243 |
| 1694.2929372087767 | 104.389 |
| 1690.1607439729116 | 104.534 |
| 1686.0141293220133 | 104.678 |
| 1681.8533603612227 | 104.822 |
| 1677.67870439629 | 104.965 |
| 1673.4904288928858 | 105.107 |
| 1669.2888014360756 | 105.249 |
| 1665.0740896899654 | 105.389 |
| 1660.8465613575336 | 105.53 |
| 1656.6064841406587 | 105.669 |
| 1652.3541257003524 | 105.808 |
| 1648.0897536172122 | 105.946 |
| 1643.8136353521008 | 106.083 |
| 1639.5260382070655 | 106.22 |
| 1635.2272292865061 | 106.356 |
| 1630.9174754586033 | 106.491 |
| 1626.5970433170155 | 106.625 |
| 1622.2661991428563 | 106.759 |
| 1617.9252088669607 | 106.892 |
| 1613.5743380324495 | 107.024 |
| 1609.2138517576027 | 107.155 |
| 1604.8440146990501 | 107.286 |
| 1600.4650910152875 | 107.415 |
| 1596.0773443305286 | 107.544 |
| 1591.6810376989004 | 107.673 |
| 1587.27643356899 | 107.8 |
| 1582.8637937487526 | 107.927 |
| 1578.4433793707883 | 108.053 |
| 1574.015450857992 | 108.178 |
| 1569.5802678895898 | 108.302 |
| 1565.1380893675662 | 108.425 |
| 1560.6891733834873 | 108.548 |
| 1556.2337771857308 | 108.669 |
| 1551.7721571471277 | 108.79 |
| 1547.3045687330214 | 108.91 |
| 1542.831266469752 | 109.03 |
| 1538.3525039135716 | 109.148 |
| 1533.8685336199944 | 109.265 |
| 1529.3796071135916 | 109.382 |
| 1524.8859748582315 | 109.498 |
| 1520.387886227773 | 109.613 |
| 1515.885589477217 | 109.727 |
| 1511.3793317143209 | 109.84 |
| 1506.8693588716776 | 109.952 |
| 1502.355915679269 | 110.064 |
| 1497.8392456374918 | 110.174 |
| 1493.319590990664 | 110.284 |
| 1488.7971927010135 | 110.393 |
| 1484.2722904231537 | 110.501 |
| 1479.7451224790464 | 110.608 |
| 1475.2159258334596 | 110.714 |
| 1470.6849360699177 | 110.819 |
| 1466.152387367151 | 110.924 |
| 1461.6185124760439 | 111.027 |
| 1457.0835426970848 | 111.13 |
| 1452.547707858321 | 111.231 |
| 1448.0112362938175 | 111.332 |
| 1443.474354822623 | 111.432 |
| 1438.9372887282434 | 111.53 |
| 1434.4002617386268 | 111.628 |
| 1429.8634960066538 | 111.725 |
| 1425.3272120911422 | 111.821 |
| 1420.7916289383606 | 111.916 |
| 1416.2569638640534 | 112.011 |
| 1411.7234325359764 | 112.104 |
| 1407.191248956944 | 112.196 |
| 1402.6606254483859 | 112.288 |
| 1398.1317726344141 | 112.378 |
| 1393.6048994263988 | 112.467 |
| 1389.0802130080526 | 112.556 |
| 1384.5579188210215 | 112.644 |
| 1380.0382205509811 | 112.73 |
| 1375.5213201142378 | 112.816 |
| 1371.0074176448315 | 112.901 |
| 1366.4967114821402 | 112.984 |
| 1361.9893981589814 | 113.067 |
| 1357.4856723902121 | 113.149 |
| 1352.9857270618213 | 113.23 |
| 1348.4897532205148 | 113.31 |
| 1343.9979400637887 | 113.389 |
| 1339.51047493049 | 113.467 |
| 1335.0275432918593 | 113.544 |
| 1330.5493287430538 | 113.62 |
| 1326.0760129951486 | 113.695 |
| 1321.60777586761 | 113.769 |
| 1317.1447952812396 | 113.843 |
| 1312.6872472515854 | 113.915 |
| 1308.2353058828146 | 113.986 |
| 1303.789143362046 | 114.056 |
| 1299.3489299541366 | 114.126 |
| 1294.9148339969206 | 114.194 |
| 1290.4870218968927 | 114.261 |
| 1286.065658125335 | 114.328 |
| 1281.6509052148817 | 114.393 |
| 1277.2429237565168 | 114.457 |
| 1272.841872397 | 114.521 |
| 1268.4479078367178 | 114.583 |
| 1264.061184827952 | 114.645 |
| 1259.681856173564 | 114.705 |
| 1255.3100727260874 | 114.765 |
| 1250.945983387225 | 114.824 |
| 1246.5897351077454 | 114.881 |
| 1242.2414728877725 | 114.938 |
| 1237.901339777464 | 114.994 |
| 1233.569476878074 | 115.048 |
| 1229.246023343392 | 115.102 |
| 1224.9311163815546 | 115.155 |
| 1220.6248912572257 | 115.207 |
| 1216.3274812941359 | 115.257 |
| 1212.0390178779787 | 115.307 |
| 1207.7596304596573 | 115.356 |
| 1203.489446558874 | 115.404 |
| 1199.2285917680604 | 115.451 |
| 1194.977189756639 | 115.497 |
| 1190.735362275613 | 115.542 |
| 1186.503229162476 | 115.586 |
| 1182.2809083464388 | 115.629 |
| 1178.068515853965 | 115.672 |
| 1173.8661658146098 | 115.713 |
| 1169.6739704671577 | 115.753 |
| 1165.4920401660515 | 115.792 |
| 1161.3204833881073 | 115.831 |
| 1157.1594067395097 | 115.868 |
| 1153.008914963081 | 115.904 |
| 1148.8691109458189 | 115.94 |
| 1144.7400957266966 | 115.974 |
| 1140.6219685047183 | 116.008 |
| 1136.5148266472265 | 116.041 |
| 1132.4187656984527 | 116.072 |
| 1128.3338793883077 | 116.103 |
| 1124.2602596414038 | 116.133 |
| 1120.1979965863045 | 116.162 |
| 1116.147178564995 | 116.19 |
| 1112.107892142568 | 116.217 |
| 1108.080222117119 | 116.243 |
| 1104.0642515298453 | 116.268 |
| 1100.0600616753418 | 116.292 |
| 1096.0677321120918 | 116.315 |
| 1092.0873406731407 | 116.338 |
| 1088.1189634769535 | 116.359 |
| 1084.162674938446 | 116.379 |
| 1080.2185477801854 | 116.399 |
| 1076.2866530437568 | 116.418 |
| 1072.3670601012864 | 116.436 |
| 1068.4598366671185 | 116.452 |
| 1064.5650488096403 | 116.468 |
| 1060.6827609632498 | 116.483 |
| 1056.8130359404595 | 116.497 |
| 1052.9559349441317 | 116.511 |
| 1049.1115175798423 | 116.523 |
| 1045.2798418683635 | 116.534 |
| 1041.460964258265 | 116.545 |
| 1037.654939638624 | 116.555 |
| 1033.8618213518434 | 116.563 |
| 1030.0816612065705 | 116.571 |
| 1026.314509490711 | 116.578 |
| 1022.5604149845365 | 116.585 |
| 1018.8194249738758 | 116.59 |
| 1015.0915852633913 | 116.594 |
| 1011.3769401899298 | 116.598 |
| 1007.6755326359479 | 116.6 |
| 1003.9874040430044 | 116.602 |
| 1000.3125944253165 | 116.603 |
| 996.6511423833754 | 116.603 |
| 993.0030851176161 | 116.602 |
| 989.368458442139 | 116.601 |
| 985.7472967984754 | 116.598 |
| 982.139633269398 | 116.595 |
| 978.545499592767 | 116.591 |
| 974.9649261754109 | 116.586 |
| 971.3979421070379 | 116.58 |
| 967.8445751741724 | 116.573 |
| 964.3048518741141 | 116.566 |
| 960.7787974289157 | 116.557 |
| 957.2664357993748 | 116.548 |
| 953.7677896990372 | 116.538 |
| 950.2828806082078 | 116.528 |
| 946.8117287879653 | 116.516 |
| 943.3543532941769 | 116.504 |
| 939.9107719915114 | 116.49 |
| 936.4810015674447 | 116.476 |
| 933.0650575462568 | 116.462 |
| 929.662954303016 | 116.446 |
| 926.2747050775474 | 116.43 |
| 922.9003219883822 | 116.412 |
| 919.5398160466859 | 116.394 |
| 916.1931971701614 | 116.376 |
| 912.8604741969249 | 116.356 |
| 909.541654899351 | 116.336 |
| 906.2367459978854 | 116.315 |
| 902.9457531748214 | 116.293 |
| 899.6686810880386 | 116.271 |
| 896.4055333847001 | 116.247 |
| 893.1563127149072 | 116.223 |
| 889.9210207453078 | 116.198 |
| 886.6996581726572 | 116.173 |
| 883.4922247373285 | 116.146 |
| 880.2987192367698 | 116.119 |
| 877.1191395389083 | 116.092 |
| 873.9534825954958 | 116.063 |
| 870.8017444553965 | 116.034 |
| 867.6639202778138 | 116.004 |
| 864.5400043454541 | 115.973 |
| 861.4299900776264 | 115.942 |
| 858.3338700432749 | 115.91 |
| 855.2516359739446 | 115.877 |
| 852.1832787766756 | 115.843 |
| 849.1287885468269 | 115.809 |
| 846.0881545808269 | 115.774 |
| 843.0613653888497 | 115.738 |
| 840.0484087074145 | 115.702 |
| 837.0492715119083 | 115.665 |
| 834.0639400290293 | 115.627 |
| 831.0923997491502 | 115.589 |
| 828.1346354386009 | 115.55 |
| 825.1906311518667 | 115.51 |
| 822.2603702437049 | 115.47 |
| 819.3438353811748 | 115.429 |
| 816.4410085555827 | 115.387 |
| 813.5518710943392 | 115.345 |
| 810.6764036727288 | 115.302 |
| 807.8145863255911 | 115.258 |
| 804.9663984589109 | 115.214 |
| 802.1318188613194 | 115.169 |
| 799.3108257155021 | 115.123 |
| 796.503396609516 | 115.077 |
| 793.7095085480132 | 115.03 |
| 790.929137963371 | 114.983 |
| 788.1622607267276 | 114.935 |
| 785.4088521589239 | 114.886 |
| 782.6688870413485 | 114.837 |
| 779.9423396266885 | 114.787 |
| 777.2291836495825 | 114.736 |
| 774.5293923371779 | 114.685 |
| 771.8429384195905 | 114.633 |
| 769.1697941402666 | 114.581 |
| 766.5099312662478 | 114.528 |
| 763.8633210983368 | 114.475 |
| 761.2299344811655 | 114.421 |
| 758.6097418131645 | 114.366 |
| 756.002713056433 | 114.311 |
| 753.4088177465105 | 114.255 |
| 750.8280250020492 | 114.199 |
| 748.2603035343872 | 114.142 |
| 745.705621657022 | 114.084 |
| 743.1639472949853 | 114.026 |
| 740.6352479941182 | 113.968 |
| 738.1194909302469 | 113.908 |
| 735.6166429182591 | 113.849 |
| 733.1266704210817 | 113.789 |
| 730.6495395585587 | 113.728 |
| 728.1852161162301 | 113.667 |
| 725.7336655540129 | 113.605 |
| 723.2948530147818 | 113.542 |
| 720.8687433328527 | 113.48 |
| 718.4553010423671 | 113.416 |
| 716.054490385579 | 113.352 |
| 713.6662753210433 | 113.288 |
| 711.2906195317067 | 113.223 |
| 708.9274864329024 | 113.158 |
| 706.5768391802458 | 113.092 |
| 704.2386406774357 | 113.026 |
| 701.9128535839577 | 112.959 |
| 699.5994403226923 | 112.891 |
| 697.2983630874272 | 112.824 |
| 695.0095838502747 | 112.755 |
| 692.733064368994 | 112.686 |
| 690.4687661942195 | 112.617 |
| 688.2166506765953 | 112.547 |
| 685.9766789738161 | 112.477 |
| 683.7488120575745 | 112.407 |
| 681.5330107204175 | 112.336 |
| 679.3292355825093 | 112.264 |
| 677.1374470983042 | 112.192 |
| 674.9576055631269 | 112.12 |
| 672.7896711196639 | 112.047 |
| 670.6336037643647 | 111.973 |
| 668.4893633537528 | 111.9 |
| 666.3569096106495 | 111.825 |
| 664.2362021303082 | 111.751 |
| 662.1272003864623 | 111.676 |
| 660.0298637372849 | 111.6 |
| 657.9441514312637 | 111.524 |
| 655.8700226129885 | 111.448 |
| 653.8074363288548 | 111.371 |
| 651.7563515326826 | 111.294 |
| 649.7167270912511 | 111.217 |
| 647.6885217897503 | 111.139 |
| 645.6716943371505 | 111.061 |
| 643.6662033714888 | 110.982 |
| 641.6720074650756 | 110.903 |
| 639.6890651296195 | 110.823 |
| 637.7173348212733 | 110.743 |
| 635.7567749455994 | 110.663 |
| 633.8073438624581 | 110.583 |
| 631.8689998908167 | 110.502 |
| 629.9417013134823 | 110.42 |
| 628.0254063817579 | 110.338 |
| 626.1200733200221 | 110.256 |
| 624.2256603302345 | 110.174 |
| 622.342125596366 | 110.091 |
| 620.4694272887559 | 110.008 |
| 618.6075235683952 | 109.924 |
| 616.7563725911385 | 109.841 |
| 614.9159325118436 | 109.756 |
| 613.0861614884402 | 109.672 |
| 611.2670176859287 | 109.587 |
| 609.4584592803095 | 109.502 |
| 607.6604444624427 | 109.416 |
| 605.8729314418406 | 109.33 |
| 604.0958784503928 | 109.244 |
| 602.3292437460234 | 109.158 |
| 600.572985616284 | 109.071 |
| 598.8270623818796 | 108.984 |
| 597.0914324001315 | 108.896 |
| 595.366054068375 | 108.809 |
| 593.6508858272948 | 108.721 |
| 591.9458861641978 | 108.632 |
| 590.2510136162233 | 108.544 |
| 588.5662267734936 | 108.455 |
| 586.8914842822024 | 108.365 |
| 585.2267448476456 | 108.276 |
| 583.5719672371908 | 108.186 |
| 581.9271102831905 | 108.096 |
| 580.292132885836 | 108.006 |
| 578.6669940159561 | 107.915 |
| 577.0516527177579 | 107.824 |
| 575.4460681115127 | 107.733 |
| 573.8501993961875 | 107.641 |
| 572.2640058520212 | 107.55 |
| 570.6874468430483 | 107.457 |
| 569.1204818195686 | 107.365 |
| 567.5630703205657 | 107.273 |
| 566.015171976073 | 107.18 |
| 564.47674650949 | 107.087 |
| 562.9477537398466 | 106.994 |
| 561.4281535840194 | 106.9 |
| 559.917906058898 | 106.806 |
| 558.4169712835035 | 106.712 |
| 556.925309481059 | 106.618 |
| 555.4428809810132 | 106.524 |
| 553.9696462210173 | 106.429 |
| 552.5055657488566 | 106.334 |
| 551.0506002243361 | 106.239 |
| 549.6047104211224 | 106.143 |
| 548.1678572285409 | 106.048 |
| 546.7400016533302 | 105.952 |
| 545.3211048213531 | 105.856 |
| 543.9111279792662 | 105.76 |
| 542.5100324961473 | 105.663 |
| 541.1177798650822 | 105.566 |
| 539.7343317047105 | 105.47 |
| 538.3596497607325 | 105.373 |
| 536.9936959073763 | 105.275 |
| 535.636432148826 | 105.178 |
| 534.2878206206124 | 105.08 |
| 532.9478235909655 | 104.982 |
| 531.6164034621305 | 104.884 |
| 530.2935227716471 | 104.786 |
| 528.9791441935929 | 104.687 |
| 527.6732305397916 | 104.589 |
| 526.375744760986 | 104.49 |
| 525.0866499479774 | 104.391 |
| 523.8059093327304 | 104.292 |
| 522.5334862894448 | 104.193 |
| 521.269344335595 | 104.093 |
| 520.0134471329367 | 103.993 |
| 518.7657584884824 | 103.894 |
| 517.5262423554454 | 103.794 |
| 516.2948628341527 | 103.693 |
| 515.0715841729282 | 103.593 |
| 513.8563707689461 | 103.493 |
| 512.6491871690552 | 103.392 |
| 511.44999807057303 | 103.291 |
| 510.258768322054 | 103.19 |
| 509.0754629240276 | 103.089 |
| 507.9000470297103 | 102.988 |
| 506.73248594569026 | 102.887 |
| 505.5727451325852 | 102.785 |
| 504.4207902056749 | 102.684 |
| 503.27658693550734 | 102.582 |
| 502.14010124848033 | 102.48 |
| 501.0112992273979 | 102.378 |
| 499.8901471120026 | 102.276 |
| 498.7766112994839 | 102.173 |
| 497.6706583449631 | 102.071 |
| 496.5722549619551 | 101.968 |
| 495.4813680228074 | 101.866 |
| 494.3979645591172 | 101.763 |
| 493.32201176212646 | 101.66 |
| 492.25347698309514 | 101.557 |
| 491.19232773365394 | 101.454 |
| 490.1385316861359 | 101.351 |
| 489.0920566738878 | 101.247 |
| 488.0528706915618 | 101.144 |
| 487.02094189538724 | 101.04 |
| 485.99623860342325 | 100.937 |
| 484.9787292957926 | 100.833 |
| 483.96838261489705 | 100.729 |
| 482.9651673656144 | 100.625 |
| 481.9690525154779 | 100.521 |
| 480.9800071948383 | 100.417 |
| 479.99800069700825 | 100.313 |
| 479.0230024783905 | 100.208 |
| 478.05498215858916 | 100.104 |
| 477.09390952050546 | 99.999 |
| 476.13975451041676 | 99.895 |
| 475.192487238041 | 99.79 |
| 474.25207797658516 | 99.685 |
| 473.3184971627795 | 99.581 |
| 472.3917153968967 | 99.476 |
| 471.4717034427569 | 99.371 |
| 470.558432227719 | 99.266 |
| 469.6518728426577 | 99.16 |
| 468.75199654192784 | 99.055 |
| 467.85877474331477 | 98.95 |
| 466.9721790279728 | 98.845 |
| 466.0921811403502 | 98.739 |
| 465.2187529881025 | 98.634 |
| 464.3518666419935 | 98.528 |
| 463.4914943357847 | 98.423 |
| 462.6376084661127 | 98.317 |
| 461.790181592356 | 98.212 |
| 460.9491864364906 | 98.106 |
| 460.11459588293445 | 98 |
| 459.2863829783819 | 97.894 |
| 458.46452093162753 | 97.788 |
| 457.6489831133803 | 97.683 |
| 456.8397430560675 | 97.577 |
| 456.0367744536293 | 97.471 |
| 455.24005116130405 | 97.365 |
| 454.44954719540453 | 97.258 |
| 453.66523673308507 | 97.152 |
| 452.8870941121 | 97.046 |
| 452.11509383055386 | 96.94 |
| 451.3492105466432 | 96.834 |
| 450.5894190783904 | 96.728 |
| 449.8356944033696 | 96.621 |
| 449.088011658425 | 96.515 |
| 448.3463461393817 | 96.409 |
| 447.61067330074945 | 96.302 |
| 446.88096875541913 | 96.196 |
| 446.15720827435246 | 96.089 |
| 445.43936778626505 | 95.983 |
| 444.7274233773029 | 95.877 |
| 444.02135129071274 | 95.77 |
| 443.32112792650594 | 95.664 |
| 442.6267298411167 | 95.557 |
| 441.93813374705445 | 95.451 |
| 441.2553165125504 | 95.344 |
| 440.5782551611989 | 95.237 |
| 439.9069268715934 | 95.131 |
| 439.24130897695704 | 95.024 |
| 438.5813789647688 | 94.918 |
| 437.9271144763843 | 94.811 |
| 437.2784933066522 | 94.705 |
| 436.6354934035259 | 94.598 |
| 435.9980928676713 | 94.491 |
| 435.3662699520697 | 94.385 |
| 434.740003061617 | 94.278 |
| 434.11927075271916 | 94.172 |
| 433.5040517328832 | 94.065 |
| 432.8943248603053 | 93.959 |
| 432.2900691434545 | 93.852 |
| 431.691263740654 | 93.745 |
| 431.0978879596583 | 93.639 |
| 430.5099212572276 | 93.532 |
| 429.92734323869917 | 93.426 |
| 429.3501336575558 | 93.319 |
| 428.7782724149912 | 93.213 |
| 428.2117395594732 | 93.106 |
| 427.6505152863039 | 93 |
| 427.09457993717785 | 92.893 |
| 426.5439139997374 | 92.787 |
| 425.99849810712635 | 92.68 |
| 425.4583130375409 | 92.574 |
| 424.9233397137793 | 92.468 |
| 424.3935592027889 | 92.361 |
| 423.86895271521183 | 92.255 |
| 423.34950160492895 | 92.149 |
| 422.83518736860174 | 92.042 |
| 422.3259916452134 | 91.936 |
| 421.8218962156078 | 91.83 |
| 421.32288300202794 | 91.724 |
| 420.82893406765214 | 91.618 |
| 420.34003161613 | 91.511 |
| 419.85615799111673 | 91.405 |
| 419.37729567580686 | 91.299 |
| 418.9034272924667 | 91.193 |
| 418.43453560196633 | 91.087 |
| 417.9706035033107 | 90.981 |
| 417.51161403317013 | 90.875 |
| 417.05755036540995 | 90.77 |
| 416.60839581062015 | 90.664 |
| 416.1641338156443 | 90.558 |
| 415.724747963108 | 90.452 |
| 415.2902219709473 | 90.347 |
| 414.86053969193694 | 90.241 |
| 414.4356851132181 | 90.135 |
| 414.01564235582623 | 90.03 |
| 413.6003956742192 | 89.924 |
| 413.1899294558051 | 89.819 |
| 412.78422822047 | 89.713 |
| 412.3832766201067 | 89.608 |
| 411.98705943814264 | 89.503 |
| 411.5955615890689 | 89.397 |
| 411.20876811796927 | 89.292 |
| 410.82666420004966 | 89.187 |
| 410.44923514016807 | 89.082 |
| 410.07646637236513 | 88.977 |
| 409.70834345939505 | 88.872 |
| 409.3448520922572 | 88.767 |
| 408.9859780897286 | 88.662 |
| 408.63170739789666 | 88.557 |
| 408.28202608969343 | 88.453 |
| 407.93692036442974 | 88.348 |
| 407.5963765473309 | 88.243 |
| 407.260381089073 | 88.139 |
| 406.92892056532025 | 88.034 |
| 406.6019816762633 | 87.93 |
| 406.27955124615835 | 87.826 |